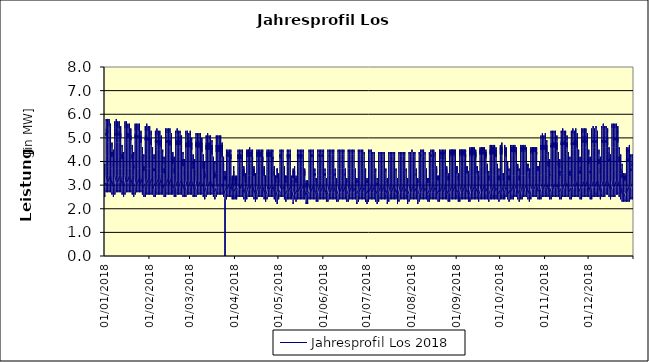
| Category | Jahresprofil Los 2018 |
|---|---|
| 01/01/2018 | 2.9 |
| 01/01/2018 | 2.8 |
| 01/01/2018 | 2.7 |
| 01/01/2018 | 2.6 |
| 01/01/2018 | 2.5 |
| 01/01/2018 | 2.5 |
| 01/01/2018 | 2.5 |
| 01/01/2018 | 2.6 |
| 01/01/2018 | 2.6 |
| 01/01/2018 | 2.8 |
| 01/01/2018 | 2.9 |
| 01/01/2018 | 3.1 |
| 01/01/2018 | 3.3 |
| 01/01/2018 | 3.3 |
| 01/01/2018 | 3.3 |
| 01/01/2018 | 3.4 |
| 01/01/2018 | 3.7 |
| 01/01/2018 | 3.9 |
| 01/01/2018 | 3.9 |
| 01/01/2018 | 3.8 |
| 01/01/2018 | 3.6 |
| 01/01/2018 | 3.3 |
| 01/01/2018 | 3.2 |
| 02/01/2018 | 3 |
| 02/01/2018 | 3.1 |
| 02/01/2018 | 2.9 |
| 02/01/2018 | 2.7 |
| 02/01/2018 | 2.7 |
| 02/01/2018 | 2.8 |
| 02/01/2018 | 3.1 |
| 02/01/2018 | 3.6 |
| 02/01/2018 | 4.3 |
| 02/01/2018 | 4.7 |
| 02/01/2018 | 4.9 |
| 02/01/2018 | 5.1 |
| 02/01/2018 | 5.2 |
| 02/01/2018 | 5.2 |
| 02/01/2018 | 5.1 |
| 02/01/2018 | 5.1 |
| 02/01/2018 | 5.1 |
| 02/01/2018 | 5.4 |
| 02/01/2018 | 5.8 |
| 02/01/2018 | 5.7 |
| 02/01/2018 | 5.3 |
| 02/01/2018 | 4.7 |
| 02/01/2018 | 4.2 |
| 02/01/2018 | 3.8 |
| 03/01/2018 | 3.4 |
| 03/01/2018 | 3.1 |
| 03/01/2018 | 2.8 |
| 03/01/2018 | 2.7 |
| 03/01/2018 | 2.7 |
| 03/01/2018 | 2.8 |
| 03/01/2018 | 3.1 |
| 03/01/2018 | 3.8 |
| 03/01/2018 | 4.5 |
| 03/01/2018 | 4.8 |
| 03/01/2018 | 5 |
| 03/01/2018 | 5.2 |
| 03/01/2018 | 5.3 |
| 03/01/2018 | 5.3 |
| 03/01/2018 | 5.2 |
| 03/01/2018 | 5.2 |
| 03/01/2018 | 5.2 |
| 03/01/2018 | 5.5 |
| 03/01/2018 | 5.8 |
| 03/01/2018 | 5.8 |
| 03/01/2018 | 5.5 |
| 03/01/2018 | 4.8 |
| 03/01/2018 | 4.2 |
| 03/01/2018 | 3.8 |
| 04/01/2018 | 3.4 |
| 04/01/2018 | 3.1 |
| 04/01/2018 | 2.8 |
| 04/01/2018 | 2.7 |
| 04/01/2018 | 2.7 |
| 04/01/2018 | 2.8 |
| 04/01/2018 | 3.1 |
| 04/01/2018 | 3.8 |
| 04/01/2018 | 4.5 |
| 04/01/2018 | 4.8 |
| 04/01/2018 | 5 |
| 04/01/2018 | 5.1 |
| 04/01/2018 | 5.2 |
| 04/01/2018 | 5.2 |
| 04/01/2018 | 5.2 |
| 04/01/2018 | 5.2 |
| 04/01/2018 | 5.2 |
| 04/01/2018 | 5.4 |
| 04/01/2018 | 5.8 |
| 04/01/2018 | 5.8 |
| 04/01/2018 | 5.5 |
| 04/01/2018 | 4.8 |
| 04/01/2018 | 4.2 |
| 04/01/2018 | 3.8 |
| 05/01/2018 | 3.4 |
| 05/01/2018 | 3.1 |
| 05/01/2018 | 2.9 |
| 05/01/2018 | 2.7 |
| 05/01/2018 | 2.7 |
| 05/01/2018 | 2.8 |
| 05/01/2018 | 3.1 |
| 05/01/2018 | 3.7 |
| 05/01/2018 | 4.4 |
| 05/01/2018 | 4.8 |
| 05/01/2018 | 5 |
| 05/01/2018 | 5.2 |
| 05/01/2018 | 5.2 |
| 05/01/2018 | 5.2 |
| 05/01/2018 | 5.1 |
| 05/01/2018 | 5 |
| 05/01/2018 | 5 |
| 05/01/2018 | 5.3 |
| 05/01/2018 | 5.6 |
| 05/01/2018 | 5.5 |
| 05/01/2018 | 5.2 |
| 05/01/2018 | 4.6 |
| 05/01/2018 | 4 |
| 05/01/2018 | 3.7 |
| 06/01/2018 | 3.4 |
| 06/01/2018 | 3 |
| 06/01/2018 | 2.8 |
| 06/01/2018 | 2.7 |
| 06/01/2018 | 2.6 |
| 06/01/2018 | 2.6 |
| 06/01/2018 | 2.7 |
| 06/01/2018 | 2.9 |
| 06/01/2018 | 3.2 |
| 06/01/2018 | 3.6 |
| 06/01/2018 | 4 |
| 06/01/2018 | 4.2 |
| 06/01/2018 | 4.4 |
| 06/01/2018 | 4.4 |
| 06/01/2018 | 4.3 |
| 06/01/2018 | 4.2 |
| 06/01/2018 | 4.2 |
| 06/01/2018 | 4.4 |
| 06/01/2018 | 4.8 |
| 06/01/2018 | 4.8 |
| 06/01/2018 | 4.6 |
| 06/01/2018 | 4.1 |
| 06/01/2018 | 3.7 |
| 06/01/2018 | 3.5 |
| 07/01/2018 | 3.2 |
| 07/01/2018 | 2.9 |
| 07/01/2018 | 2.7 |
| 07/01/2018 | 2.6 |
| 07/01/2018 | 2.5 |
| 07/01/2018 | 2.5 |
| 07/01/2018 | 2.5 |
| 07/01/2018 | 2.6 |
| 07/01/2018 | 2.9 |
| 07/01/2018 | 3.1 |
| 07/01/2018 | 3.4 |
| 07/01/2018 | 3.6 |
| 07/01/2018 | 3.8 |
| 07/01/2018 | 3.9 |
| 07/01/2018 | 3.8 |
| 07/01/2018 | 3.8 |
| 07/01/2018 | 3.8 |
| 07/01/2018 | 4 |
| 07/01/2018 | 4.4 |
| 07/01/2018 | 4.5 |
| 07/01/2018 | 4.3 |
| 07/01/2018 | 3.9 |
| 07/01/2018 | 3.6 |
| 07/01/2018 | 3.5 |
| 08/01/2018 | 3.2 |
| 08/01/2018 | 2.9 |
| 08/01/2018 | 2.7 |
| 08/01/2018 | 2.6 |
| 08/01/2018 | 2.6 |
| 08/01/2018 | 2.7 |
| 08/01/2018 | 3 |
| 08/01/2018 | 3.7 |
| 08/01/2018 | 4.4 |
| 08/01/2018 | 4.7 |
| 08/01/2018 | 4.9 |
| 08/01/2018 | 5.1 |
| 08/01/2018 | 5.2 |
| 08/01/2018 | 5.2 |
| 08/01/2018 | 5.2 |
| 08/01/2018 | 5.1 |
| 08/01/2018 | 5.1 |
| 08/01/2018 | 5.4 |
| 08/01/2018 | 5.7 |
| 08/01/2018 | 5.7 |
| 08/01/2018 | 5.4 |
| 08/01/2018 | 4.8 |
| 08/01/2018 | 4.2 |
| 08/01/2018 | 3.8 |
| 09/01/2018 | 3.4 |
| 09/01/2018 | 3.1 |
| 09/01/2018 | 2.8 |
| 09/01/2018 | 2.7 |
| 09/01/2018 | 2.7 |
| 09/01/2018 | 2.8 |
| 09/01/2018 | 3.1 |
| 09/01/2018 | 3.7 |
| 09/01/2018 | 4.4 |
| 09/01/2018 | 4.8 |
| 09/01/2018 | 5 |
| 09/01/2018 | 5.1 |
| 09/01/2018 | 5.2 |
| 09/01/2018 | 5.2 |
| 09/01/2018 | 5.2 |
| 09/01/2018 | 5.1 |
| 09/01/2018 | 5.1 |
| 09/01/2018 | 5.4 |
| 09/01/2018 | 5.8 |
| 09/01/2018 | 5.8 |
| 09/01/2018 | 5.5 |
| 09/01/2018 | 4.8 |
| 09/01/2018 | 4.2 |
| 09/01/2018 | 3.8 |
| 10/01/2018 | 3.4 |
| 10/01/2018 | 3.1 |
| 10/01/2018 | 2.8 |
| 10/01/2018 | 2.7 |
| 10/01/2018 | 2.7 |
| 10/01/2018 | 2.8 |
| 10/01/2018 | 3.1 |
| 10/01/2018 | 3.7 |
| 10/01/2018 | 4.4 |
| 10/01/2018 | 4.8 |
| 10/01/2018 | 5 |
| 10/01/2018 | 5.1 |
| 10/01/2018 | 5.2 |
| 10/01/2018 | 5.2 |
| 10/01/2018 | 5.1 |
| 10/01/2018 | 5.1 |
| 10/01/2018 | 5.1 |
| 10/01/2018 | 5.3 |
| 10/01/2018 | 5.7 |
| 10/01/2018 | 5.7 |
| 10/01/2018 | 5.4 |
| 10/01/2018 | 4.8 |
| 10/01/2018 | 4.2 |
| 10/01/2018 | 3.8 |
| 11/01/2018 | 3.4 |
| 11/01/2018 | 3.1 |
| 11/01/2018 | 2.8 |
| 11/01/2018 | 2.7 |
| 11/01/2018 | 2.7 |
| 11/01/2018 | 2.8 |
| 11/01/2018 | 3.1 |
| 11/01/2018 | 3.7 |
| 11/01/2018 | 4.4 |
| 11/01/2018 | 4.8 |
| 11/01/2018 | 5 |
| 11/01/2018 | 5.1 |
| 11/01/2018 | 5.2 |
| 11/01/2018 | 5.2 |
| 11/01/2018 | 5.1 |
| 11/01/2018 | 5.1 |
| 11/01/2018 | 5.1 |
| 11/01/2018 | 5.3 |
| 11/01/2018 | 5.7 |
| 11/01/2018 | 5.7 |
| 11/01/2018 | 5.4 |
| 11/01/2018 | 4.8 |
| 11/01/2018 | 4.2 |
| 11/01/2018 | 3.8 |
| 12/01/2018 | 3.4 |
| 12/01/2018 | 3.1 |
| 12/01/2018 | 2.8 |
| 12/01/2018 | 2.7 |
| 12/01/2018 | 2.7 |
| 12/01/2018 | 2.8 |
| 12/01/2018 | 3.1 |
| 12/01/2018 | 3.7 |
| 12/01/2018 | 4.4 |
| 12/01/2018 | 4.8 |
| 12/01/2018 | 5 |
| 12/01/2018 | 5.1 |
| 12/01/2018 | 5.2 |
| 12/01/2018 | 5.2 |
| 12/01/2018 | 5 |
| 12/01/2018 | 5 |
| 12/01/2018 | 5 |
| 12/01/2018 | 5.2 |
| 12/01/2018 | 5.5 |
| 12/01/2018 | 5.5 |
| 12/01/2018 | 5.2 |
| 12/01/2018 | 4.6 |
| 12/01/2018 | 4 |
| 12/01/2018 | 3.7 |
| 13/01/2018 | 3.4 |
| 13/01/2018 | 3 |
| 13/01/2018 | 2.8 |
| 13/01/2018 | 2.7 |
| 13/01/2018 | 2.6 |
| 13/01/2018 | 2.6 |
| 13/01/2018 | 2.7 |
| 13/01/2018 | 2.9 |
| 13/01/2018 | 3.2 |
| 13/01/2018 | 3.6 |
| 13/01/2018 | 3.9 |
| 13/01/2018 | 4.2 |
| 13/01/2018 | 4.3 |
| 13/01/2018 | 4.3 |
| 13/01/2018 | 4.2 |
| 13/01/2018 | 4.2 |
| 13/01/2018 | 4.1 |
| 13/01/2018 | 4.4 |
| 13/01/2018 | 4.7 |
| 13/01/2018 | 4.7 |
| 13/01/2018 | 4.6 |
| 13/01/2018 | 4.1 |
| 13/01/2018 | 3.7 |
| 13/01/2018 | 3.4 |
| 14/01/2018 | 3.2 |
| 14/01/2018 | 2.9 |
| 14/01/2018 | 2.7 |
| 14/01/2018 | 2.6 |
| 14/01/2018 | 2.5 |
| 14/01/2018 | 2.5 |
| 14/01/2018 | 2.5 |
| 14/01/2018 | 2.6 |
| 14/01/2018 | 2.8 |
| 14/01/2018 | 3.1 |
| 14/01/2018 | 3.4 |
| 14/01/2018 | 3.6 |
| 14/01/2018 | 3.8 |
| 14/01/2018 | 3.9 |
| 14/01/2018 | 3.8 |
| 14/01/2018 | 3.7 |
| 14/01/2018 | 3.7 |
| 14/01/2018 | 3.9 |
| 14/01/2018 | 4.3 |
| 14/01/2018 | 4.4 |
| 14/01/2018 | 4.3 |
| 14/01/2018 | 3.9 |
| 14/01/2018 | 3.6 |
| 14/01/2018 | 3.5 |
| 15/01/2018 | 3.2 |
| 15/01/2018 | 2.9 |
| 15/01/2018 | 2.7 |
| 15/01/2018 | 2.6 |
| 15/01/2018 | 2.6 |
| 15/01/2018 | 2.7 |
| 15/01/2018 | 3 |
| 15/01/2018 | 3.7 |
| 15/01/2018 | 4.3 |
| 15/01/2018 | 4.7 |
| 15/01/2018 | 4.9 |
| 15/01/2018 | 5 |
| 15/01/2018 | 5.1 |
| 15/01/2018 | 5.1 |
| 15/01/2018 | 5.1 |
| 15/01/2018 | 5.1 |
| 15/01/2018 | 5.1 |
| 15/01/2018 | 5.3 |
| 15/01/2018 | 5.6 |
| 15/01/2018 | 5.7 |
| 15/01/2018 | 5.4 |
| 15/01/2018 | 4.8 |
| 15/01/2018 | 4.2 |
| 15/01/2018 | 3.8 |
| 16/01/2018 | 3.4 |
| 16/01/2018 | 3 |
| 16/01/2018 | 2.8 |
| 16/01/2018 | 2.7 |
| 16/01/2018 | 2.7 |
| 16/01/2018 | 2.8 |
| 16/01/2018 | 3.1 |
| 16/01/2018 | 3.7 |
| 16/01/2018 | 4.4 |
| 16/01/2018 | 4.8 |
| 16/01/2018 | 4.9 |
| 16/01/2018 | 5.1 |
| 16/01/2018 | 5.1 |
| 16/01/2018 | 5.2 |
| 16/01/2018 | 5.1 |
| 16/01/2018 | 5.1 |
| 16/01/2018 | 5.1 |
| 16/01/2018 | 5.3 |
| 16/01/2018 | 5.7 |
| 16/01/2018 | 5.7 |
| 16/01/2018 | 5.4 |
| 16/01/2018 | 4.8 |
| 16/01/2018 | 4.2 |
| 16/01/2018 | 3.8 |
| 17/01/2018 | 3.4 |
| 17/01/2018 | 3.1 |
| 17/01/2018 | 2.8 |
| 17/01/2018 | 2.7 |
| 17/01/2018 | 2.7 |
| 17/01/2018 | 2.8 |
| 17/01/2018 | 3.1 |
| 17/01/2018 | 3.7 |
| 17/01/2018 | 4.4 |
| 17/01/2018 | 4.8 |
| 17/01/2018 | 4.9 |
| 17/01/2018 | 5.1 |
| 17/01/2018 | 5.1 |
| 17/01/2018 | 5.2 |
| 17/01/2018 | 5.1 |
| 17/01/2018 | 5.1 |
| 17/01/2018 | 5 |
| 17/01/2018 | 5.2 |
| 17/01/2018 | 5.6 |
| 17/01/2018 | 5.6 |
| 17/01/2018 | 5.4 |
| 17/01/2018 | 4.7 |
| 17/01/2018 | 4.2 |
| 17/01/2018 | 3.8 |
| 18/01/2018 | 3.4 |
| 18/01/2018 | 3.1 |
| 18/01/2018 | 2.8 |
| 18/01/2018 | 2.7 |
| 18/01/2018 | 2.7 |
| 18/01/2018 | 2.8 |
| 18/01/2018 | 3.1 |
| 18/01/2018 | 3.7 |
| 18/01/2018 | 4.4 |
| 18/01/2018 | 4.7 |
| 18/01/2018 | 4.9 |
| 18/01/2018 | 5.1 |
| 18/01/2018 | 5.1 |
| 18/01/2018 | 5.1 |
| 18/01/2018 | 5.1 |
| 18/01/2018 | 5 |
| 18/01/2018 | 5 |
| 18/01/2018 | 5.2 |
| 18/01/2018 | 5.6 |
| 18/01/2018 | 5.6 |
| 18/01/2018 | 5.4 |
| 18/01/2018 | 4.8 |
| 18/01/2018 | 4.2 |
| 18/01/2018 | 3.8 |
| 19/01/2018 | 3.4 |
| 19/01/2018 | 3.1 |
| 19/01/2018 | 2.8 |
| 19/01/2018 | 2.7 |
| 19/01/2018 | 2.7 |
| 19/01/2018 | 2.8 |
| 19/01/2018 | 3.1 |
| 19/01/2018 | 3.7 |
| 19/01/2018 | 4.4 |
| 19/01/2018 | 4.7 |
| 19/01/2018 | 4.9 |
| 19/01/2018 | 5.1 |
| 19/01/2018 | 5.1 |
| 19/01/2018 | 5.1 |
| 19/01/2018 | 5 |
| 19/01/2018 | 4.9 |
| 19/01/2018 | 4.9 |
| 19/01/2018 | 5.1 |
| 19/01/2018 | 5.4 |
| 19/01/2018 | 5.4 |
| 19/01/2018 | 5.1 |
| 19/01/2018 | 4.5 |
| 19/01/2018 | 4 |
| 19/01/2018 | 3.7 |
| 20/01/2018 | 3.3 |
| 20/01/2018 | 3 |
| 20/01/2018 | 2.8 |
| 20/01/2018 | 2.7 |
| 20/01/2018 | 2.6 |
| 20/01/2018 | 2.6 |
| 20/01/2018 | 2.7 |
| 20/01/2018 | 2.9 |
| 20/01/2018 | 3.2 |
| 20/01/2018 | 3.5 |
| 20/01/2018 | 3.9 |
| 20/01/2018 | 4.2 |
| 20/01/2018 | 4.3 |
| 20/01/2018 | 4.3 |
| 20/01/2018 | 4.2 |
| 20/01/2018 | 4.1 |
| 20/01/2018 | 4.1 |
| 20/01/2018 | 4.3 |
| 20/01/2018 | 4.6 |
| 20/01/2018 | 4.7 |
| 20/01/2018 | 4.5 |
| 20/01/2018 | 4.1 |
| 20/01/2018 | 3.7 |
| 20/01/2018 | 3.4 |
| 21/01/2018 | 3.1 |
| 21/01/2018 | 2.9 |
| 21/01/2018 | 2.7 |
| 21/01/2018 | 2.6 |
| 21/01/2018 | 2.5 |
| 21/01/2018 | 2.5 |
| 21/01/2018 | 2.5 |
| 21/01/2018 | 2.6 |
| 21/01/2018 | 2.8 |
| 21/01/2018 | 3.1 |
| 21/01/2018 | 3.4 |
| 21/01/2018 | 3.6 |
| 21/01/2018 | 3.8 |
| 21/01/2018 | 3.8 |
| 21/01/2018 | 3.8 |
| 21/01/2018 | 3.7 |
| 21/01/2018 | 3.7 |
| 21/01/2018 | 3.9 |
| 21/01/2018 | 4.2 |
| 21/01/2018 | 4.4 |
| 21/01/2018 | 4.2 |
| 21/01/2018 | 3.9 |
| 21/01/2018 | 3.6 |
| 21/01/2018 | 3.4 |
| 22/01/2018 | 3.1 |
| 22/01/2018 | 2.9 |
| 22/01/2018 | 2.7 |
| 22/01/2018 | 2.6 |
| 22/01/2018 | 2.6 |
| 22/01/2018 | 2.7 |
| 22/01/2018 | 3 |
| 22/01/2018 | 3.6 |
| 22/01/2018 | 4.3 |
| 22/01/2018 | 4.7 |
| 22/01/2018 | 4.9 |
| 22/01/2018 | 5 |
| 22/01/2018 | 5.1 |
| 22/01/2018 | 5.1 |
| 22/01/2018 | 5 |
| 22/01/2018 | 5 |
| 22/01/2018 | 5 |
| 22/01/2018 | 5.2 |
| 22/01/2018 | 5.5 |
| 22/01/2018 | 5.6 |
| 22/01/2018 | 5.3 |
| 22/01/2018 | 4.7 |
| 22/01/2018 | 4.2 |
| 22/01/2018 | 3.7 |
| 23/01/2018 | 3.3 |
| 23/01/2018 | 3 |
| 23/01/2018 | 2.8 |
| 23/01/2018 | 2.7 |
| 23/01/2018 | 2.7 |
| 23/01/2018 | 2.8 |
| 23/01/2018 | 3 |
| 23/01/2018 | 3.7 |
| 23/01/2018 | 4.4 |
| 23/01/2018 | 4.7 |
| 23/01/2018 | 4.9 |
| 23/01/2018 | 5 |
| 23/01/2018 | 5.1 |
| 23/01/2018 | 5.1 |
| 23/01/2018 | 5 |
| 23/01/2018 | 5 |
| 23/01/2018 | 5 |
| 23/01/2018 | 5.2 |
| 23/01/2018 | 5.5 |
| 23/01/2018 | 5.6 |
| 23/01/2018 | 5.4 |
| 23/01/2018 | 4.8 |
| 23/01/2018 | 4.2 |
| 23/01/2018 | 3.8 |
| 24/01/2018 | 3.3 |
| 24/01/2018 | 3 |
| 24/01/2018 | 2.8 |
| 24/01/2018 | 2.7 |
| 24/01/2018 | 2.7 |
| 24/01/2018 | 2.8 |
| 24/01/2018 | 3 |
| 24/01/2018 | 3.7 |
| 24/01/2018 | 4.4 |
| 24/01/2018 | 4.7 |
| 24/01/2018 | 4.9 |
| 24/01/2018 | 5 |
| 24/01/2018 | 5.1 |
| 24/01/2018 | 5.1 |
| 24/01/2018 | 5 |
| 24/01/2018 | 5 |
| 24/01/2018 | 5 |
| 24/01/2018 | 5.1 |
| 24/01/2018 | 5.5 |
| 24/01/2018 | 5.6 |
| 24/01/2018 | 5.3 |
| 24/01/2018 | 4.7 |
| 24/01/2018 | 4.1 |
| 24/01/2018 | 3.7 |
| 25/01/2018 | 3.3 |
| 25/01/2018 | 3 |
| 25/01/2018 | 2.8 |
| 25/01/2018 | 2.7 |
| 25/01/2018 | 2.7 |
| 25/01/2018 | 2.8 |
| 25/01/2018 | 3 |
| 25/01/2018 | 3.7 |
| 25/01/2018 | 4.4 |
| 25/01/2018 | 4.7 |
| 25/01/2018 | 4.9 |
| 25/01/2018 | 5 |
| 25/01/2018 | 5.1 |
| 25/01/2018 | 5.1 |
| 25/01/2018 | 5 |
| 25/01/2018 | 5 |
| 25/01/2018 | 4.9 |
| 25/01/2018 | 5.1 |
| 25/01/2018 | 5.5 |
| 25/01/2018 | 5.6 |
| 25/01/2018 | 5.3 |
| 25/01/2018 | 4.7 |
| 25/01/2018 | 4.2 |
| 25/01/2018 | 3.8 |
| 26/01/2018 | 3.4 |
| 26/01/2018 | 3 |
| 26/01/2018 | 2.8 |
| 26/01/2018 | 2.7 |
| 26/01/2018 | 2.7 |
| 26/01/2018 | 2.8 |
| 26/01/2018 | 3 |
| 26/01/2018 | 3.7 |
| 26/01/2018 | 4.3 |
| 26/01/2018 | 4.7 |
| 26/01/2018 | 4.9 |
| 26/01/2018 | 5 |
| 26/01/2018 | 5.1 |
| 26/01/2018 | 5 |
| 26/01/2018 | 4.9 |
| 26/01/2018 | 4.9 |
| 26/01/2018 | 4.8 |
| 26/01/2018 | 5 |
| 26/01/2018 | 5.3 |
| 26/01/2018 | 5.3 |
| 26/01/2018 | 5.1 |
| 26/01/2018 | 4.5 |
| 26/01/2018 | 4 |
| 26/01/2018 | 3.6 |
| 27/01/2018 | 3.3 |
| 27/01/2018 | 3 |
| 27/01/2018 | 2.8 |
| 27/01/2018 | 2.7 |
| 27/01/2018 | 2.6 |
| 27/01/2018 | 2.6 |
| 27/01/2018 | 2.7 |
| 27/01/2018 | 2.8 |
| 27/01/2018 | 3.1 |
| 27/01/2018 | 3.5 |
| 27/01/2018 | 3.9 |
| 27/01/2018 | 4.1 |
| 27/01/2018 | 4.2 |
| 27/01/2018 | 4.2 |
| 27/01/2018 | 4.1 |
| 27/01/2018 | 4 |
| 27/01/2018 | 4 |
| 27/01/2018 | 4.2 |
| 27/01/2018 | 4.5 |
| 27/01/2018 | 4.6 |
| 27/01/2018 | 4.5 |
| 27/01/2018 | 4.1 |
| 27/01/2018 | 3.6 |
| 27/01/2018 | 3.4 |
| 28/01/2018 | 3.1 |
| 28/01/2018 | 2.9 |
| 28/01/2018 | 2.7 |
| 28/01/2018 | 2.6 |
| 28/01/2018 | 2.5 |
| 28/01/2018 | 2.5 |
| 28/01/2018 | 2.5 |
| 28/01/2018 | 2.6 |
| 28/01/2018 | 2.8 |
| 28/01/2018 | 3 |
| 28/01/2018 | 3.3 |
| 28/01/2018 | 3.5 |
| 28/01/2018 | 3.7 |
| 28/01/2018 | 3.8 |
| 28/01/2018 | 3.7 |
| 28/01/2018 | 3.6 |
| 28/01/2018 | 3.6 |
| 28/01/2018 | 3.8 |
| 28/01/2018 | 4.1 |
| 28/01/2018 | 4.3 |
| 28/01/2018 | 4.2 |
| 28/01/2018 | 3.9 |
| 28/01/2018 | 3.6 |
| 28/01/2018 | 3.4 |
| 29/01/2018 | 3.1 |
| 29/01/2018 | 2.9 |
| 29/01/2018 | 2.7 |
| 29/01/2018 | 2.6 |
| 29/01/2018 | 2.5 |
| 29/01/2018 | 2.7 |
| 29/01/2018 | 3 |
| 29/01/2018 | 3.6 |
| 29/01/2018 | 4.3 |
| 29/01/2018 | 4.6 |
| 29/01/2018 | 4.8 |
| 29/01/2018 | 5 |
| 29/01/2018 | 5 |
| 29/01/2018 | 5 |
| 29/01/2018 | 5 |
| 29/01/2018 | 5 |
| 29/01/2018 | 4.9 |
| 29/01/2018 | 5.1 |
| 29/01/2018 | 5.4 |
| 29/01/2018 | 5.5 |
| 29/01/2018 | 5.3 |
| 29/01/2018 | 4.7 |
| 29/01/2018 | 4.1 |
| 29/01/2018 | 3.7 |
| 30/01/2018 | 3.3 |
| 30/01/2018 | 3 |
| 30/01/2018 | 2.8 |
| 30/01/2018 | 2.7 |
| 30/01/2018 | 2.6 |
| 30/01/2018 | 2.7 |
| 30/01/2018 | 3 |
| 30/01/2018 | 3.7 |
| 30/01/2018 | 4.3 |
| 30/01/2018 | 4.7 |
| 30/01/2018 | 4.9 |
| 30/01/2018 | 5 |
| 30/01/2018 | 5 |
| 30/01/2018 | 5 |
| 30/01/2018 | 5 |
| 30/01/2018 | 4.9 |
| 30/01/2018 | 4.9 |
| 30/01/2018 | 5.1 |
| 30/01/2018 | 5.4 |
| 30/01/2018 | 5.6 |
| 30/01/2018 | 5.3 |
| 30/01/2018 | 4.7 |
| 30/01/2018 | 4.1 |
| 30/01/2018 | 3.7 |
| 31/01/2018 | 3.3 |
| 31/01/2018 | 3 |
| 31/01/2018 | 2.8 |
| 31/01/2018 | 2.7 |
| 31/01/2018 | 2.6 |
| 31/01/2018 | 2.7 |
| 31/01/2018 | 3 |
| 31/01/2018 | 3.7 |
| 31/01/2018 | 4.3 |
| 31/01/2018 | 4.7 |
| 31/01/2018 | 4.9 |
| 31/01/2018 | 5 |
| 31/01/2018 | 5 |
| 31/01/2018 | 5 |
| 31/01/2018 | 5 |
| 31/01/2018 | 4.9 |
| 31/01/2018 | 4.9 |
| 31/01/2018 | 5 |
| 31/01/2018 | 5.4 |
| 31/01/2018 | 5.5 |
| 31/01/2018 | 5.3 |
| 31/01/2018 | 4.7 |
| 31/01/2018 | 4.1 |
| 31/01/2018 | 3.7 |
| 01/02/2018 | 3.3 |
| 01/02/2018 | 3 |
| 01/02/2018 | 2.8 |
| 01/02/2018 | 2.7 |
| 01/02/2018 | 2.6 |
| 01/02/2018 | 2.7 |
| 01/02/2018 | 3 |
| 01/02/2018 | 3.7 |
| 01/02/2018 | 4.3 |
| 01/02/2018 | 4.7 |
| 01/02/2018 | 4.9 |
| 01/02/2018 | 5 |
| 01/02/2018 | 5 |
| 01/02/2018 | 5 |
| 01/02/2018 | 5 |
| 01/02/2018 | 4.9 |
| 01/02/2018 | 4.9 |
| 01/02/2018 | 5 |
| 01/02/2018 | 5.4 |
| 01/02/2018 | 5.5 |
| 01/02/2018 | 5.3 |
| 01/02/2018 | 4.7 |
| 01/02/2018 | 4.1 |
| 01/02/2018 | 3.7 |
| 02/02/2018 | 3.3 |
| 02/02/2018 | 3 |
| 02/02/2018 | 2.8 |
| 02/02/2018 | 2.7 |
| 02/02/2018 | 2.6 |
| 02/02/2018 | 2.7 |
| 02/02/2018 | 3 |
| 02/02/2018 | 3.7 |
| 02/02/2018 | 4.3 |
| 02/02/2018 | 4.7 |
| 02/02/2018 | 4.9 |
| 02/02/2018 | 5 |
| 02/02/2018 | 5 |
| 02/02/2018 | 5 |
| 02/02/2018 | 4.9 |
| 02/02/2018 | 4.8 |
| 02/02/2018 | 4.7 |
| 02/02/2018 | 4.9 |
| 02/02/2018 | 5.2 |
| 02/02/2018 | 5.3 |
| 02/02/2018 | 5.1 |
| 02/02/2018 | 4.5 |
| 02/02/2018 | 3.9 |
| 02/02/2018 | 3.6 |
| 03/02/2018 | 3.3 |
| 03/02/2018 | 3 |
| 03/02/2018 | 2.8 |
| 03/02/2018 | 2.6 |
| 03/02/2018 | 2.6 |
| 03/02/2018 | 2.6 |
| 03/02/2018 | 2.6 |
| 03/02/2018 | 2.8 |
| 03/02/2018 | 3.1 |
| 03/02/2018 | 3.5 |
| 03/02/2018 | 3.8 |
| 03/02/2018 | 4.1 |
| 03/02/2018 | 4.2 |
| 03/02/2018 | 4.2 |
| 03/02/2018 | 4.1 |
| 03/02/2018 | 4 |
| 03/02/2018 | 4 |
| 03/02/2018 | 4.1 |
| 03/02/2018 | 4.4 |
| 03/02/2018 | 4.6 |
| 03/02/2018 | 4.4 |
| 03/02/2018 | 4 |
| 03/02/2018 | 3.6 |
| 03/02/2018 | 3.4 |
| 04/02/2018 | 3.1 |
| 04/02/2018 | 2.8 |
| 04/02/2018 | 2.7 |
| 04/02/2018 | 2.6 |
| 04/02/2018 | 2.5 |
| 04/02/2018 | 2.5 |
| 04/02/2018 | 2.5 |
| 04/02/2018 | 2.6 |
| 04/02/2018 | 2.8 |
| 04/02/2018 | 3 |
| 04/02/2018 | 3.3 |
| 04/02/2018 | 3.5 |
| 04/02/2018 | 3.7 |
| 04/02/2018 | 3.7 |
| 04/02/2018 | 3.7 |
| 04/02/2018 | 3.6 |
| 04/02/2018 | 3.6 |
| 04/02/2018 | 3.7 |
| 04/02/2018 | 4 |
| 04/02/2018 | 4.3 |
| 04/02/2018 | 4.1 |
| 04/02/2018 | 3.8 |
| 04/02/2018 | 3.5 |
| 04/02/2018 | 3.4 |
| 05/02/2018 | 3.1 |
| 05/02/2018 | 2.9 |
| 05/02/2018 | 2.7 |
| 05/02/2018 | 2.6 |
| 05/02/2018 | 2.5 |
| 05/02/2018 | 2.7 |
| 05/02/2018 | 2.9 |
| 05/02/2018 | 3.5 |
| 05/02/2018 | 4.1 |
| 05/02/2018 | 4.4 |
| 05/02/2018 | 4.7 |
| 05/02/2018 | 4.8 |
| 05/02/2018 | 4.9 |
| 05/02/2018 | 4.9 |
| 05/02/2018 | 4.9 |
| 05/02/2018 | 4.8 |
| 05/02/2018 | 4.8 |
| 05/02/2018 | 4.9 |
| 05/02/2018 | 5.2 |
| 05/02/2018 | 5.3 |
| 05/02/2018 | 5.1 |
| 05/02/2018 | 4.5 |
| 05/02/2018 | 4.1 |
| 05/02/2018 | 3.7 |
| 06/02/2018 | 3.3 |
| 06/02/2018 | 3 |
| 06/02/2018 | 2.8 |
| 06/02/2018 | 2.7 |
| 06/02/2018 | 2.6 |
| 06/02/2018 | 2.7 |
| 06/02/2018 | 3 |
| 06/02/2018 | 3.6 |
| 06/02/2018 | 4.1 |
| 06/02/2018 | 4.5 |
| 06/02/2018 | 4.7 |
| 06/02/2018 | 4.9 |
| 06/02/2018 | 4.9 |
| 06/02/2018 | 4.9 |
| 06/02/2018 | 4.9 |
| 06/02/2018 | 4.8 |
| 06/02/2018 | 4.8 |
| 06/02/2018 | 4.9 |
| 06/02/2018 | 5.2 |
| 06/02/2018 | 5.4 |
| 06/02/2018 | 5.1 |
| 06/02/2018 | 4.6 |
| 06/02/2018 | 4.1 |
| 06/02/2018 | 3.7 |
| 07/02/2018 | 3.3 |
| 07/02/2018 | 3 |
| 07/02/2018 | 2.8 |
| 07/02/2018 | 2.7 |
| 07/02/2018 | 2.6 |
| 07/02/2018 | 2.7 |
| 07/02/2018 | 3 |
| 07/02/2018 | 3.5 |
| 07/02/2018 | 4.1 |
| 07/02/2018 | 4.5 |
| 07/02/2018 | 4.7 |
| 07/02/2018 | 4.9 |
| 07/02/2018 | 4.9 |
| 07/02/2018 | 4.9 |
| 07/02/2018 | 4.9 |
| 07/02/2018 | 4.8 |
| 07/02/2018 | 4.7 |
| 07/02/2018 | 4.8 |
| 07/02/2018 | 5.2 |
| 07/02/2018 | 5.3 |
| 07/02/2018 | 5.1 |
| 07/02/2018 | 4.5 |
| 07/02/2018 | 4 |
| 07/02/2018 | 3.7 |
| 08/02/2018 | 3.3 |
| 08/02/2018 | 3 |
| 08/02/2018 | 2.8 |
| 08/02/2018 | 2.7 |
| 08/02/2018 | 2.6 |
| 08/02/2018 | 2.7 |
| 08/02/2018 | 3 |
| 08/02/2018 | 3.5 |
| 08/02/2018 | 4.1 |
| 08/02/2018 | 4.5 |
| 08/02/2018 | 4.7 |
| 08/02/2018 | 4.8 |
| 08/02/2018 | 4.9 |
| 08/02/2018 | 4.9 |
| 08/02/2018 | 4.8 |
| 08/02/2018 | 4.8 |
| 08/02/2018 | 4.7 |
| 08/02/2018 | 4.8 |
| 08/02/2018 | 5.2 |
| 08/02/2018 | 5.3 |
| 08/02/2018 | 5.1 |
| 08/02/2018 | 4.6 |
| 08/02/2018 | 4.1 |
| 08/02/2018 | 3.7 |
| 09/02/2018 | 3.3 |
| 09/02/2018 | 3 |
| 09/02/2018 | 2.8 |
| 09/02/2018 | 2.7 |
| 09/02/2018 | 2.6 |
| 09/02/2018 | 2.7 |
| 09/02/2018 | 3 |
| 09/02/2018 | 3.5 |
| 09/02/2018 | 4.1 |
| 09/02/2018 | 4.5 |
| 09/02/2018 | 4.7 |
| 09/02/2018 | 4.9 |
| 09/02/2018 | 4.9 |
| 09/02/2018 | 4.9 |
| 09/02/2018 | 4.8 |
| 09/02/2018 | 4.7 |
| 09/02/2018 | 4.6 |
| 09/02/2018 | 4.7 |
| 09/02/2018 | 5 |
| 09/02/2018 | 5.1 |
| 09/02/2018 | 4.8 |
| 09/02/2018 | 4.3 |
| 09/02/2018 | 3.9 |
| 09/02/2018 | 3.5 |
| 10/02/2018 | 3.2 |
| 10/02/2018 | 2.9 |
| 10/02/2018 | 2.7 |
| 10/02/2018 | 2.6 |
| 10/02/2018 | 2.6 |
| 10/02/2018 | 2.6 |
| 10/02/2018 | 2.6 |
| 10/02/2018 | 2.8 |
| 10/02/2018 | 3.1 |
| 10/02/2018 | 3.5 |
| 10/02/2018 | 3.8 |
| 10/02/2018 | 4.1 |
| 10/02/2018 | 4.2 |
| 10/02/2018 | 4.1 |
| 10/02/2018 | 4 |
| 10/02/2018 | 3.9 |
| 10/02/2018 | 3.9 |
| 10/02/2018 | 4 |
| 10/02/2018 | 4.3 |
| 10/02/2018 | 4.5 |
| 10/02/2018 | 4.4 |
| 10/02/2018 | 4 |
| 10/02/2018 | 3.6 |
| 10/02/2018 | 3.3 |
| 11/02/2018 | 3.1 |
| 11/02/2018 | 2.8 |
| 11/02/2018 | 2.6 |
| 11/02/2018 | 2.5 |
| 11/02/2018 | 2.5 |
| 11/02/2018 | 2.5 |
| 11/02/2018 | 2.5 |
| 11/02/2018 | 2.6 |
| 11/02/2018 | 2.7 |
| 11/02/2018 | 3 |
| 11/02/2018 | 3.3 |
| 11/02/2018 | 3.5 |
| 11/02/2018 | 3.6 |
| 11/02/2018 | 3.7 |
| 11/02/2018 | 3.6 |
| 11/02/2018 | 3.5 |
| 11/02/2018 | 3.5 |
| 11/02/2018 | 3.6 |
| 11/02/2018 | 4 |
| 11/02/2018 | 4.2 |
| 11/02/2018 | 4.1 |
| 11/02/2018 | 3.8 |
| 11/02/2018 | 3.5 |
| 11/02/2018 | 3.3 |
| 12/02/2018 | 3.1 |
| 12/02/2018 | 2.8 |
| 12/02/2018 | 2.6 |
| 12/02/2018 | 2.5 |
| 12/02/2018 | 2.5 |
| 12/02/2018 | 2.6 |
| 12/02/2018 | 2.9 |
| 12/02/2018 | 3.6 |
| 12/02/2018 | 4.2 |
| 12/02/2018 | 4.6 |
| 12/02/2018 | 4.8 |
| 12/02/2018 | 4.9 |
| 12/02/2018 | 4.9 |
| 12/02/2018 | 4.9 |
| 12/02/2018 | 4.9 |
| 12/02/2018 | 4.8 |
| 12/02/2018 | 4.8 |
| 12/02/2018 | 4.9 |
| 12/02/2018 | 5.2 |
| 12/02/2018 | 5.4 |
| 12/02/2018 | 5.2 |
| 12/02/2018 | 4.6 |
| 12/02/2018 | 4.1 |
| 12/02/2018 | 3.7 |
| 13/02/2018 | 3.3 |
| 13/02/2018 | 3 |
| 13/02/2018 | 2.7 |
| 13/02/2018 | 2.6 |
| 13/02/2018 | 2.6 |
| 13/02/2018 | 2.7 |
| 13/02/2018 | 3 |
| 13/02/2018 | 3.6 |
| 13/02/2018 | 4.3 |
| 13/02/2018 | 4.6 |
| 13/02/2018 | 4.8 |
| 13/02/2018 | 4.9 |
| 13/02/2018 | 4.9 |
| 13/02/2018 | 4.9 |
| 13/02/2018 | 4.9 |
| 13/02/2018 | 4.8 |
| 13/02/2018 | 4.8 |
| 13/02/2018 | 4.9 |
| 13/02/2018 | 5.2 |
| 13/02/2018 | 5.4 |
| 13/02/2018 | 5.2 |
| 13/02/2018 | 4.7 |
| 13/02/2018 | 4.1 |
| 13/02/2018 | 3.7 |
| 14/02/2018 | 3.3 |
| 14/02/2018 | 3 |
| 14/02/2018 | 2.7 |
| 14/02/2018 | 2.6 |
| 14/02/2018 | 2.6 |
| 14/02/2018 | 2.7 |
| 14/02/2018 | 3 |
| 14/02/2018 | 3.6 |
| 14/02/2018 | 4.3 |
| 14/02/2018 | 4.6 |
| 14/02/2018 | 4.8 |
| 14/02/2018 | 4.9 |
| 14/02/2018 | 5 |
| 14/02/2018 | 4.9 |
| 14/02/2018 | 4.9 |
| 14/02/2018 | 4.8 |
| 14/02/2018 | 4.8 |
| 14/02/2018 | 4.8 |
| 14/02/2018 | 5.2 |
| 14/02/2018 | 5.4 |
| 14/02/2018 | 5.2 |
| 14/02/2018 | 4.6 |
| 14/02/2018 | 4.1 |
| 14/02/2018 | 3.7 |
| 15/02/2018 | 3.3 |
| 15/02/2018 | 3 |
| 15/02/2018 | 2.7 |
| 15/02/2018 | 2.6 |
| 15/02/2018 | 2.6 |
| 15/02/2018 | 2.7 |
| 15/02/2018 | 3 |
| 15/02/2018 | 3.6 |
| 15/02/2018 | 4.3 |
| 15/02/2018 | 4.6 |
| 15/02/2018 | 4.8 |
| 15/02/2018 | 4.9 |
| 15/02/2018 | 4.9 |
| 15/02/2018 | 4.9 |
| 15/02/2018 | 4.9 |
| 15/02/2018 | 4.8 |
| 15/02/2018 | 4.7 |
| 15/02/2018 | 4.8 |
| 15/02/2018 | 5.2 |
| 15/02/2018 | 5.4 |
| 15/02/2018 | 5.2 |
| 15/02/2018 | 4.6 |
| 15/02/2018 | 4.1 |
| 15/02/2018 | 3.7 |
| 16/02/2018 | 3.3 |
| 16/02/2018 | 3 |
| 16/02/2018 | 2.8 |
| 16/02/2018 | 2.6 |
| 16/02/2018 | 2.6 |
| 16/02/2018 | 2.7 |
| 16/02/2018 | 3 |
| 16/02/2018 | 3.6 |
| 16/02/2018 | 4.2 |
| 16/02/2018 | 4.6 |
| 16/02/2018 | 4.8 |
| 16/02/2018 | 4.9 |
| 16/02/2018 | 4.9 |
| 16/02/2018 | 4.9 |
| 16/02/2018 | 4.8 |
| 16/02/2018 | 4.7 |
| 16/02/2018 | 4.6 |
| 16/02/2018 | 4.7 |
| 16/02/2018 | 5 |
| 16/02/2018 | 5.2 |
| 16/02/2018 | 5 |
| 16/02/2018 | 4.4 |
| 16/02/2018 | 3.9 |
| 16/02/2018 | 3.5 |
| 17/02/2018 | 3.2 |
| 17/02/2018 | 2.9 |
| 17/02/2018 | 2.7 |
| 17/02/2018 | 2.6 |
| 17/02/2018 | 2.6 |
| 17/02/2018 | 2.6 |
| 17/02/2018 | 2.6 |
| 17/02/2018 | 2.8 |
| 17/02/2018 | 3.1 |
| 17/02/2018 | 3.4 |
| 17/02/2018 | 3.8 |
| 17/02/2018 | 4 |
| 17/02/2018 | 4.1 |
| 17/02/2018 | 4.1 |
| 17/02/2018 | 4 |
| 17/02/2018 | 3.9 |
| 17/02/2018 | 3.9 |
| 17/02/2018 | 3.9 |
| 17/02/2018 | 4.2 |
| 17/02/2018 | 4.4 |
| 17/02/2018 | 4.4 |
| 17/02/2018 | 4 |
| 17/02/2018 | 3.6 |
| 17/02/2018 | 3.3 |
| 18/02/2018 | 3 |
| 18/02/2018 | 2.8 |
| 18/02/2018 | 2.6 |
| 18/02/2018 | 2.5 |
| 18/02/2018 | 2.5 |
| 18/02/2018 | 2.5 |
| 18/02/2018 | 2.5 |
| 18/02/2018 | 2.6 |
| 18/02/2018 | 2.7 |
| 18/02/2018 | 3 |
| 18/02/2018 | 3.2 |
| 18/02/2018 | 3.4 |
| 18/02/2018 | 3.6 |
| 18/02/2018 | 3.7 |
| 18/02/2018 | 3.6 |
| 18/02/2018 | 3.5 |
| 18/02/2018 | 3.5 |
| 18/02/2018 | 3.5 |
| 18/02/2018 | 3.9 |
| 18/02/2018 | 4.2 |
| 18/02/2018 | 4.1 |
| 18/02/2018 | 3.8 |
| 18/02/2018 | 3.5 |
| 18/02/2018 | 3.3 |
| 19/02/2018 | 3 |
| 19/02/2018 | 2.8 |
| 19/02/2018 | 2.6 |
| 19/02/2018 | 2.5 |
| 19/02/2018 | 2.5 |
| 19/02/2018 | 2.6 |
| 19/02/2018 | 2.9 |
| 19/02/2018 | 3.6 |
| 19/02/2018 | 4.2 |
| 19/02/2018 | 4.5 |
| 19/02/2018 | 4.7 |
| 19/02/2018 | 4.8 |
| 19/02/2018 | 4.9 |
| 19/02/2018 | 4.9 |
| 19/02/2018 | 4.8 |
| 19/02/2018 | 4.8 |
| 19/02/2018 | 4.7 |
| 19/02/2018 | 4.8 |
| 19/02/2018 | 5.1 |
| 19/02/2018 | 5.3 |
| 19/02/2018 | 5.2 |
| 19/02/2018 | 4.6 |
| 19/02/2018 | 4 |
| 19/02/2018 | 3.6 |
| 20/02/2018 | 3.2 |
| 20/02/2018 | 2.9 |
| 20/02/2018 | 2.7 |
| 20/02/2018 | 2.6 |
| 20/02/2018 | 2.6 |
| 20/02/2018 | 2.7 |
| 20/02/2018 | 3 |
| 20/02/2018 | 3.6 |
| 20/02/2018 | 4.2 |
| 20/02/2018 | 4.6 |
| 20/02/2018 | 4.8 |
| 20/02/2018 | 4.8 |
| 20/02/2018 | 4.9 |
| 20/02/2018 | 4.9 |
| 20/02/2018 | 4.8 |
| 20/02/2018 | 4.8 |
| 20/02/2018 | 4.7 |
| 20/02/2018 | 4.8 |
| 20/02/2018 | 5.1 |
| 20/02/2018 | 5.4 |
| 20/02/2018 | 5.2 |
| 20/02/2018 | 4.6 |
| 20/02/2018 | 4.1 |
| 20/02/2018 | 3.6 |
| 21/02/2018 | 3.2 |
| 21/02/2018 | 2.9 |
| 21/02/2018 | 2.7 |
| 21/02/2018 | 2.6 |
| 21/02/2018 | 2.6 |
| 21/02/2018 | 2.7 |
| 21/02/2018 | 3 |
| 21/02/2018 | 3.6 |
| 21/02/2018 | 4.2 |
| 21/02/2018 | 4.6 |
| 21/02/2018 | 4.8 |
| 21/02/2018 | 4.9 |
| 21/02/2018 | 4.9 |
| 21/02/2018 | 4.9 |
| 21/02/2018 | 4.8 |
| 21/02/2018 | 4.7 |
| 21/02/2018 | 4.7 |
| 21/02/2018 | 4.8 |
| 21/02/2018 | 5.1 |
| 21/02/2018 | 5.3 |
| 21/02/2018 | 5.2 |
| 21/02/2018 | 4.6 |
| 21/02/2018 | 4 |
| 21/02/2018 | 3.6 |
| 22/02/2018 | 3.2 |
| 22/02/2018 | 2.9 |
| 22/02/2018 | 2.7 |
| 22/02/2018 | 2.6 |
| 22/02/2018 | 2.6 |
| 22/02/2018 | 2.7 |
| 22/02/2018 | 3 |
| 22/02/2018 | 3.6 |
| 22/02/2018 | 4.2 |
| 22/02/2018 | 4.6 |
| 22/02/2018 | 4.7 |
| 22/02/2018 | 4.8 |
| 22/02/2018 | 4.9 |
| 22/02/2018 | 4.9 |
| 22/02/2018 | 4.8 |
| 22/02/2018 | 4.7 |
| 22/02/2018 | 4.7 |
| 22/02/2018 | 4.7 |
| 22/02/2018 | 5.1 |
| 22/02/2018 | 5.3 |
| 22/02/2018 | 5.2 |
| 22/02/2018 | 4.6 |
| 22/02/2018 | 4.1 |
| 22/02/2018 | 3.6 |
| 23/02/2018 | 3.2 |
| 23/02/2018 | 3 |
| 23/02/2018 | 2.7 |
| 23/02/2018 | 2.6 |
| 23/02/2018 | 2.6 |
| 23/02/2018 | 2.7 |
| 23/02/2018 | 3 |
| 23/02/2018 | 3.6 |
| 23/02/2018 | 4.2 |
| 23/02/2018 | 4.6 |
| 23/02/2018 | 4.7 |
| 23/02/2018 | 4.8 |
| 23/02/2018 | 4.9 |
| 23/02/2018 | 4.8 |
| 23/02/2018 | 4.7 |
| 23/02/2018 | 4.6 |
| 23/02/2018 | 4.5 |
| 23/02/2018 | 4.6 |
| 23/02/2018 | 4.9 |
| 23/02/2018 | 5.1 |
| 23/02/2018 | 4.9 |
| 23/02/2018 | 4.4 |
| 23/02/2018 | 3.9 |
| 23/02/2018 | 3.5 |
| 24/02/2018 | 3.2 |
| 24/02/2018 | 2.9 |
| 24/02/2018 | 2.7 |
| 24/02/2018 | 2.6 |
| 24/02/2018 | 2.6 |
| 24/02/2018 | 2.5 |
| 24/02/2018 | 2.6 |
| 24/02/2018 | 2.8 |
| 24/02/2018 | 3 |
| 24/02/2018 | 3.4 |
| 24/02/2018 | 3.8 |
| 24/02/2018 | 4 |
| 24/02/2018 | 4.1 |
| 24/02/2018 | 4 |
| 24/02/2018 | 3.9 |
| 24/02/2018 | 3.8 |
| 24/02/2018 | 3.8 |
| 24/02/2018 | 3.8 |
| 24/02/2018 | 4.1 |
| 24/02/2018 | 4.4 |
| 24/02/2018 | 4.3 |
| 24/02/2018 | 3.9 |
| 24/02/2018 | 3.6 |
| 24/02/2018 | 3.3 |
| 25/02/2018 | 3 |
| 25/02/2018 | 2.8 |
| 25/02/2018 | 2.6 |
| 25/02/2018 | 2.5 |
| 25/02/2018 | 2.5 |
| 25/02/2018 | 2.5 |
| 25/02/2018 | 2.5 |
| 25/02/2018 | 2.6 |
| 25/02/2018 | 2.7 |
| 25/02/2018 | 3 |
| 25/02/2018 | 3.2 |
| 25/02/2018 | 3.4 |
| 25/02/2018 | 3.6 |
| 25/02/2018 | 3.6 |
| 25/02/2018 | 3.5 |
| 25/02/2018 | 3.4 |
| 25/02/2018 | 3.4 |
| 25/02/2018 | 3.5 |
| 25/02/2018 | 3.8 |
| 25/02/2018 | 4.1 |
| 25/02/2018 | 4 |
| 25/02/2018 | 3.8 |
| 25/02/2018 | 3.5 |
| 25/02/2018 | 3.3 |
| 26/02/2018 | 3 |
| 26/02/2018 | 2.8 |
| 26/02/2018 | 2.6 |
| 26/02/2018 | 2.5 |
| 26/02/2018 | 2.5 |
| 26/02/2018 | 2.6 |
| 26/02/2018 | 2.9 |
| 26/02/2018 | 3.6 |
| 26/02/2018 | 4.1 |
| 26/02/2018 | 4.5 |
| 26/02/2018 | 4.7 |
| 26/02/2018 | 4.8 |
| 26/02/2018 | 4.8 |
| 26/02/2018 | 4.8 |
| 26/02/2018 | 4.8 |
| 26/02/2018 | 4.7 |
| 26/02/2018 | 4.6 |
| 26/02/2018 | 4.7 |
| 26/02/2018 | 5 |
| 26/02/2018 | 5.3 |
| 26/02/2018 | 5.1 |
| 26/02/2018 | 4.6 |
| 26/02/2018 | 4 |
| 26/02/2018 | 3.6 |
| 27/02/2018 | 3.2 |
| 27/02/2018 | 2.9 |
| 27/02/2018 | 2.7 |
| 27/02/2018 | 2.6 |
| 27/02/2018 | 2.6 |
| 27/02/2018 | 2.7 |
| 27/02/2018 | 3 |
| 27/02/2018 | 3.6 |
| 27/02/2018 | 4.2 |
| 27/02/2018 | 4.6 |
| 27/02/2018 | 4.7 |
| 27/02/2018 | 4.8 |
| 27/02/2018 | 4.8 |
| 27/02/2018 | 4.8 |
| 27/02/2018 | 4.8 |
| 27/02/2018 | 4.7 |
| 27/02/2018 | 4.6 |
| 27/02/2018 | 4.7 |
| 27/02/2018 | 5 |
| 27/02/2018 | 5.3 |
| 27/02/2018 | 5.2 |
| 27/02/2018 | 4.6 |
| 27/02/2018 | 4 |
| 27/02/2018 | 3.6 |
| 28/02/2018 | 3.2 |
| 28/02/2018 | 2.9 |
| 28/02/2018 | 2.7 |
| 28/02/2018 | 2.6 |
| 28/02/2018 | 2.6 |
| 28/02/2018 | 2.7 |
| 28/02/2018 | 3 |
| 28/02/2018 | 3.6 |
| 28/02/2018 | 4.2 |
| 28/02/2018 | 4.6 |
| 28/02/2018 | 4.7 |
| 28/02/2018 | 4.8 |
| 28/02/2018 | 4.9 |
| 28/02/2018 | 4.8 |
| 28/02/2018 | 4.8 |
| 28/02/2018 | 4.7 |
| 28/02/2018 | 4.6 |
| 28/02/2018 | 4.7 |
| 28/02/2018 | 5 |
| 28/02/2018 | 5.2 |
| 28/02/2018 | 5.1 |
| 28/02/2018 | 4.6 |
| 28/02/2018 | 4 |
| 28/02/2018 | 3.6 |
| 01/03/2018 | 3.2 |
| 01/03/2018 | 2.9 |
| 01/03/2018 | 2.7 |
| 01/03/2018 | 2.6 |
| 01/03/2018 | 2.6 |
| 01/03/2018 | 2.7 |
| 01/03/2018 | 3 |
| 01/03/2018 | 3.6 |
| 01/03/2018 | 4.2 |
| 01/03/2018 | 4.6 |
| 01/03/2018 | 4.7 |
| 01/03/2018 | 4.8 |
| 01/03/2018 | 4.8 |
| 01/03/2018 | 4.8 |
| 01/03/2018 | 4.7 |
| 01/03/2018 | 4.7 |
| 01/03/2018 | 4.6 |
| 01/03/2018 | 4.6 |
| 01/03/2018 | 5 |
| 01/03/2018 | 5.3 |
| 01/03/2018 | 5.1 |
| 01/03/2018 | 4.6 |
| 01/03/2018 | 4 |
| 01/03/2018 | 3.6 |
| 02/03/2018 | 3.2 |
| 02/03/2018 | 2.9 |
| 02/03/2018 | 2.7 |
| 02/03/2018 | 2.6 |
| 02/03/2018 | 2.6 |
| 02/03/2018 | 2.7 |
| 02/03/2018 | 3 |
| 02/03/2018 | 3.6 |
| 02/03/2018 | 4.2 |
| 02/03/2018 | 4.5 |
| 02/03/2018 | 4.7 |
| 02/03/2018 | 4.8 |
| 02/03/2018 | 4.8 |
| 02/03/2018 | 4.8 |
| 02/03/2018 | 4.7 |
| 02/03/2018 | 4.6 |
| 02/03/2018 | 4.5 |
| 02/03/2018 | 4.5 |
| 02/03/2018 | 4.8 |
| 02/03/2018 | 5 |
| 02/03/2018 | 4.9 |
| 02/03/2018 | 4.4 |
| 02/03/2018 | 3.8 |
| 02/03/2018 | 3.5 |
| 03/03/2018 | 3.2 |
| 03/03/2018 | 2.9 |
| 03/03/2018 | 2.7 |
| 03/03/2018 | 2.6 |
| 03/03/2018 | 2.5 |
| 03/03/2018 | 2.5 |
| 03/03/2018 | 2.6 |
| 03/03/2018 | 2.8 |
| 03/03/2018 | 3 |
| 03/03/2018 | 3.4 |
| 03/03/2018 | 3.7 |
| 03/03/2018 | 3.9 |
| 03/03/2018 | 4 |
| 03/03/2018 | 4 |
| 03/03/2018 | 3.9 |
| 03/03/2018 | 3.8 |
| 03/03/2018 | 3.7 |
| 03/03/2018 | 3.8 |
| 03/03/2018 | 4 |
| 03/03/2018 | 4.3 |
| 03/03/2018 | 4.3 |
| 03/03/2018 | 3.9 |
| 03/03/2018 | 3.5 |
| 03/03/2018 | 3.3 |
| 04/03/2018 | 3 |
| 04/03/2018 | 2.8 |
| 04/03/2018 | 2.6 |
| 04/03/2018 | 2.5 |
| 04/03/2018 | 2.5 |
| 04/03/2018 | 2.5 |
| 04/03/2018 | 2.5 |
| 04/03/2018 | 2.5 |
| 04/03/2018 | 2.7 |
| 04/03/2018 | 2.9 |
| 04/03/2018 | 3.2 |
| 04/03/2018 | 3.4 |
| 04/03/2018 | 3.5 |
| 04/03/2018 | 3.6 |
| 04/03/2018 | 3.5 |
| 04/03/2018 | 3.4 |
| 04/03/2018 | 3.4 |
| 04/03/2018 | 3.4 |
| 04/03/2018 | 3.7 |
| 04/03/2018 | 4.1 |
| 04/03/2018 | 4 |
| 04/03/2018 | 3.7 |
| 04/03/2018 | 3.5 |
| 04/03/2018 | 3.3 |
| 05/03/2018 | 3 |
| 05/03/2018 | 2.8 |
| 05/03/2018 | 2.6 |
| 05/03/2018 | 2.5 |
| 05/03/2018 | 2.5 |
| 05/03/2018 | 2.6 |
| 05/03/2018 | 2.9 |
| 05/03/2018 | 3.5 |
| 05/03/2018 | 4.1 |
| 05/03/2018 | 4.5 |
| 05/03/2018 | 4.6 |
| 05/03/2018 | 4.7 |
| 05/03/2018 | 4.8 |
| 05/03/2018 | 4.8 |
| 05/03/2018 | 4.7 |
| 05/03/2018 | 4.7 |
| 05/03/2018 | 4.6 |
| 05/03/2018 | 4.6 |
| 05/03/2018 | 4.9 |
| 05/03/2018 | 5.2 |
| 05/03/2018 | 5.1 |
| 05/03/2018 | 4.5 |
| 05/03/2018 | 4 |
| 05/03/2018 | 3.6 |
| 06/03/2018 | 3.2 |
| 06/03/2018 | 2.9 |
| 06/03/2018 | 2.7 |
| 06/03/2018 | 2.6 |
| 06/03/2018 | 2.6 |
| 06/03/2018 | 2.7 |
| 06/03/2018 | 3 |
| 06/03/2018 | 3.6 |
| 06/03/2018 | 4.2 |
| 06/03/2018 | 4.5 |
| 06/03/2018 | 4.7 |
| 06/03/2018 | 4.8 |
| 06/03/2018 | 4.8 |
| 06/03/2018 | 4.8 |
| 06/03/2018 | 4.7 |
| 06/03/2018 | 4.6 |
| 06/03/2018 | 4.6 |
| 06/03/2018 | 4.6 |
| 06/03/2018 | 4.9 |
| 06/03/2018 | 5.2 |
| 06/03/2018 | 5.1 |
| 06/03/2018 | 4.6 |
| 06/03/2018 | 4 |
| 06/03/2018 | 3.6 |
| 07/03/2018 | 3.2 |
| 07/03/2018 | 2.9 |
| 07/03/2018 | 2.7 |
| 07/03/2018 | 2.6 |
| 07/03/2018 | 2.6 |
| 07/03/2018 | 2.7 |
| 07/03/2018 | 3 |
| 07/03/2018 | 3.6 |
| 07/03/2018 | 4.2 |
| 07/03/2018 | 4.5 |
| 07/03/2018 | 4.7 |
| 07/03/2018 | 4.8 |
| 07/03/2018 | 4.8 |
| 07/03/2018 | 4.8 |
| 07/03/2018 | 4.7 |
| 07/03/2018 | 4.6 |
| 07/03/2018 | 4.6 |
| 07/03/2018 | 4.6 |
| 07/03/2018 | 4.9 |
| 07/03/2018 | 5.2 |
| 07/03/2018 | 5.1 |
| 07/03/2018 | 4.5 |
| 07/03/2018 | 4 |
| 07/03/2018 | 3.6 |
| 08/03/2018 | 3.2 |
| 08/03/2018 | 2.9 |
| 08/03/2018 | 2.7 |
| 08/03/2018 | 2.6 |
| 08/03/2018 | 2.6 |
| 08/03/2018 | 2.7 |
| 08/03/2018 | 3 |
| 08/03/2018 | 3.6 |
| 08/03/2018 | 4.2 |
| 08/03/2018 | 4.5 |
| 08/03/2018 | 4.7 |
| 08/03/2018 | 4.8 |
| 08/03/2018 | 4.8 |
| 08/03/2018 | 4.8 |
| 08/03/2018 | 4.7 |
| 08/03/2018 | 4.6 |
| 08/03/2018 | 4.5 |
| 08/03/2018 | 4.5 |
| 08/03/2018 | 4.9 |
| 08/03/2018 | 5.2 |
| 08/03/2018 | 5.1 |
| 08/03/2018 | 4.5 |
| 08/03/2018 | 4 |
| 08/03/2018 | 3.6 |
| 09/03/2018 | 3.2 |
| 09/03/2018 | 2.9 |
| 09/03/2018 | 2.7 |
| 09/03/2018 | 2.6 |
| 09/03/2018 | 2.6 |
| 09/03/2018 | 2.7 |
| 09/03/2018 | 3 |
| 09/03/2018 | 3.6 |
| 09/03/2018 | 4.1 |
| 09/03/2018 | 4.5 |
| 09/03/2018 | 4.7 |
| 09/03/2018 | 4.8 |
| 09/03/2018 | 4.8 |
| 09/03/2018 | 4.7 |
| 09/03/2018 | 4.6 |
| 09/03/2018 | 4.5 |
| 09/03/2018 | 4.4 |
| 09/03/2018 | 4.4 |
| 09/03/2018 | 4.7 |
| 09/03/2018 | 5 |
| 09/03/2018 | 4.8 |
| 09/03/2018 | 4.3 |
| 09/03/2018 | 3.8 |
| 09/03/2018 | 3.5 |
| 10/03/2018 | 3.1 |
| 10/03/2018 | 2.9 |
| 10/03/2018 | 2.7 |
| 10/03/2018 | 2.6 |
| 10/03/2018 | 2.5 |
| 10/03/2018 | 2.5 |
| 10/03/2018 | 2.6 |
| 10/03/2018 | 2.8 |
| 10/03/2018 | 3 |
| 10/03/2018 | 3.4 |
| 10/03/2018 | 3.7 |
| 10/03/2018 | 3.9 |
| 10/03/2018 | 4 |
| 10/03/2018 | 4 |
| 10/03/2018 | 3.8 |
| 10/03/2018 | 3.7 |
| 10/03/2018 | 3.7 |
| 10/03/2018 | 3.7 |
| 10/03/2018 | 3.9 |
| 10/03/2018 | 4.3 |
| 10/03/2018 | 4.2 |
| 10/03/2018 | 3.9 |
| 10/03/2018 | 3.5 |
| 10/03/2018 | 3.2 |
| 11/03/2018 | 3 |
| 11/03/2018 | 2.7 |
| 11/03/2018 | 2.6 |
| 11/03/2018 | 2.5 |
| 11/03/2018 | 2.5 |
| 11/03/2018 | 2.4 |
| 11/03/2018 | 2.5 |
| 11/03/2018 | 2.5 |
| 11/03/2018 | 2.7 |
| 11/03/2018 | 2.9 |
| 11/03/2018 | 3.2 |
| 11/03/2018 | 3.3 |
| 11/03/2018 | 3.5 |
| 11/03/2018 | 3.5 |
| 11/03/2018 | 3.4 |
| 11/03/2018 | 3.4 |
| 11/03/2018 | 3.3 |
| 11/03/2018 | 3.3 |
| 11/03/2018 | 3.6 |
| 11/03/2018 | 4 |
| 11/03/2018 | 4 |
| 11/03/2018 | 3.7 |
| 11/03/2018 | 3.4 |
| 11/03/2018 | 3.2 |
| 12/03/2018 | 3 |
| 12/03/2018 | 2.7 |
| 12/03/2018 | 2.6 |
| 12/03/2018 | 2.5 |
| 12/03/2018 | 2.5 |
| 12/03/2018 | 2.6 |
| 12/03/2018 | 2.9 |
| 12/03/2018 | 3.5 |
| 12/03/2018 | 4.1 |
| 12/03/2018 | 4.4 |
| 12/03/2018 | 4.6 |
| 12/03/2018 | 4.7 |
| 12/03/2018 | 4.7 |
| 12/03/2018 | 4.7 |
| 12/03/2018 | 4.7 |
| 12/03/2018 | 4.6 |
| 12/03/2018 | 4.5 |
| 12/03/2018 | 4.5 |
| 12/03/2018 | 4.8 |
| 12/03/2018 | 5.1 |
| 12/03/2018 | 5 |
| 12/03/2018 | 4.5 |
| 12/03/2018 | 4 |
| 12/03/2018 | 3.5 |
| 13/03/2018 | 3.1 |
| 13/03/2018 | 2.9 |
| 13/03/2018 | 2.7 |
| 13/03/2018 | 2.6 |
| 13/03/2018 | 2.6 |
| 13/03/2018 | 2.7 |
| 13/03/2018 | 3 |
| 13/03/2018 | 3.6 |
| 13/03/2018 | 4.1 |
| 13/03/2018 | 4.5 |
| 13/03/2018 | 4.7 |
| 13/03/2018 | 4.7 |
| 13/03/2018 | 4.7 |
| 13/03/2018 | 4.7 |
| 13/03/2018 | 4.7 |
| 13/03/2018 | 4.6 |
| 13/03/2018 | 4.5 |
| 13/03/2018 | 4.5 |
| 13/03/2018 | 4.8 |
| 13/03/2018 | 5.2 |
| 13/03/2018 | 5.1 |
| 13/03/2018 | 4.5 |
| 13/03/2018 | 4 |
| 13/03/2018 | 3.6 |
| 14/03/2018 | 3.2 |
| 14/03/2018 | 2.9 |
| 14/03/2018 | 2.7 |
| 14/03/2018 | 2.6 |
| 14/03/2018 | 2.6 |
| 14/03/2018 | 2.7 |
| 14/03/2018 | 3 |
| 14/03/2018 | 3.6 |
| 14/03/2018 | 4.1 |
| 14/03/2018 | 4.5 |
| 14/03/2018 | 4.7 |
| 14/03/2018 | 4.7 |
| 14/03/2018 | 4.8 |
| 14/03/2018 | 4.7 |
| 14/03/2018 | 4.6 |
| 14/03/2018 | 4.6 |
| 14/03/2018 | 4.5 |
| 14/03/2018 | 4.5 |
| 14/03/2018 | 4.8 |
| 14/03/2018 | 5.1 |
| 14/03/2018 | 5 |
| 14/03/2018 | 4.5 |
| 14/03/2018 | 4 |
| 14/03/2018 | 3.6 |
| 15/03/2018 | 3.2 |
| 15/03/2018 | 2.9 |
| 15/03/2018 | 2.7 |
| 15/03/2018 | 2.6 |
| 15/03/2018 | 2.6 |
| 15/03/2018 | 2.7 |
| 15/03/2018 | 3 |
| 15/03/2018 | 3.6 |
| 15/03/2018 | 4.1 |
| 15/03/2018 | 4.5 |
| 15/03/2018 | 4.6 |
| 15/03/2018 | 4.7 |
| 15/03/2018 | 4.7 |
| 15/03/2018 | 4.7 |
| 15/03/2018 | 4.6 |
| 15/03/2018 | 4.6 |
| 15/03/2018 | 4.5 |
| 15/03/2018 | 4.5 |
| 15/03/2018 | 4.8 |
| 15/03/2018 | 5.1 |
| 15/03/2018 | 5 |
| 15/03/2018 | 4.5 |
| 15/03/2018 | 4 |
| 15/03/2018 | 3.6 |
| 16/03/2018 | 3.2 |
| 16/03/2018 | 2.9 |
| 16/03/2018 | 2.7 |
| 16/03/2018 | 2.6 |
| 16/03/2018 | 2.6 |
| 16/03/2018 | 2.7 |
| 16/03/2018 | 3 |
| 16/03/2018 | 3.6 |
| 16/03/2018 | 4.1 |
| 16/03/2018 | 4.5 |
| 16/03/2018 | 4.6 |
| 16/03/2018 | 4.7 |
| 16/03/2018 | 4.7 |
| 16/03/2018 | 4.7 |
| 16/03/2018 | 4.5 |
| 16/03/2018 | 4.4 |
| 16/03/2018 | 4.4 |
| 16/03/2018 | 4.3 |
| 16/03/2018 | 4.6 |
| 16/03/2018 | 4.9 |
| 16/03/2018 | 4.8 |
| 16/03/2018 | 4.3 |
| 16/03/2018 | 3.8 |
| 16/03/2018 | 3.4 |
| 17/03/2018 | 3.1 |
| 17/03/2018 | 2.8 |
| 17/03/2018 | 2.7 |
| 17/03/2018 | 2.6 |
| 17/03/2018 | 2.5 |
| 17/03/2018 | 2.5 |
| 17/03/2018 | 2.6 |
| 17/03/2018 | 2.7 |
| 17/03/2018 | 3 |
| 17/03/2018 | 3.3 |
| 17/03/2018 | 3.7 |
| 17/03/2018 | 3.9 |
| 17/03/2018 | 3.9 |
| 17/03/2018 | 3.9 |
| 17/03/2018 | 3.8 |
| 17/03/2018 | 3.7 |
| 17/03/2018 | 3.6 |
| 17/03/2018 | 3.6 |
| 17/03/2018 | 3.9 |
| 17/03/2018 | 4.2 |
| 17/03/2018 | 4.2 |
| 17/03/2018 | 3.9 |
| 17/03/2018 | 3.5 |
| 17/03/2018 | 3.2 |
| 18/03/2018 | 2.9 |
| 18/03/2018 | 2.7 |
| 18/03/2018 | 2.6 |
| 18/03/2018 | 2.5 |
| 18/03/2018 | 2.4 |
| 18/03/2018 | 2.4 |
| 18/03/2018 | 2.5 |
| 18/03/2018 | 2.5 |
| 18/03/2018 | 2.6 |
| 18/03/2018 | 2.9 |
| 18/03/2018 | 3.1 |
| 18/03/2018 | 3.3 |
| 18/03/2018 | 3.5 |
| 18/03/2018 | 3.5 |
| 18/03/2018 | 3.4 |
| 18/03/2018 | 3.3 |
| 18/03/2018 | 3.3 |
| 18/03/2018 | 3.3 |
| 18/03/2018 | 3.6 |
| 18/03/2018 | 4 |
| 18/03/2018 | 3.9 |
| 18/03/2018 | 3.7 |
| 18/03/2018 | 3.4 |
| 18/03/2018 | 3.2 |
| 19/03/2018 | 2.9 |
| 19/03/2018 | 2.7 |
| 19/03/2018 | 2.6 |
| 19/03/2018 | 2.5 |
| 19/03/2018 | 2.5 |
| 19/03/2018 | 2.6 |
| 19/03/2018 | 2.9 |
| 19/03/2018 | 3.5 |
| 19/03/2018 | 4 |
| 19/03/2018 | 4.4 |
| 19/03/2018 | 4.6 |
| 19/03/2018 | 4.7 |
| 19/03/2018 | 4.7 |
| 19/03/2018 | 4.7 |
| 19/03/2018 | 4.6 |
| 19/03/2018 | 4.5 |
| 19/03/2018 | 4.4 |
| 19/03/2018 | 4.4 |
| 19/03/2018 | 4.7 |
| 19/03/2018 | 5.1 |
| 19/03/2018 | 5 |
| 19/03/2018 | 4.5 |
| 19/03/2018 | 3.9 |
| 19/03/2018 | 3.5 |
| 20/03/2018 | 3.1 |
| 20/03/2018 | 2.9 |
| 20/03/2018 | 2.7 |
| 20/03/2018 | 2.6 |
| 20/03/2018 | 2.6 |
| 20/03/2018 | 2.7 |
| 20/03/2018 | 3 |
| 20/03/2018 | 3.6 |
| 20/03/2018 | 4.1 |
| 20/03/2018 | 4.5 |
| 20/03/2018 | 4.6 |
| 20/03/2018 | 4.7 |
| 20/03/2018 | 4.7 |
| 20/03/2018 | 4.7 |
| 20/03/2018 | 4.6 |
| 20/03/2018 | 4.5 |
| 20/03/2018 | 4.5 |
| 20/03/2018 | 4.4 |
| 20/03/2018 | 4.7 |
| 20/03/2018 | 5.1 |
| 20/03/2018 | 5 |
| 20/03/2018 | 4.5 |
| 20/03/2018 | 4 |
| 20/03/2018 | 3.5 |
| 21/03/2018 | 3.1 |
| 21/03/2018 | 2.9 |
| 21/03/2018 | 2.7 |
| 21/03/2018 | 2.6 |
| 21/03/2018 | 2.6 |
| 21/03/2018 | 2.7 |
| 21/03/2018 | 3 |
| 21/03/2018 | 3.6 |
| 21/03/2018 | 4.1 |
| 21/03/2018 | 4.5 |
| 21/03/2018 | 4.6 |
| 21/03/2018 | 4.7 |
| 21/03/2018 | 4.7 |
| 21/03/2018 | 4.7 |
| 21/03/2018 | 4.6 |
| 21/03/2018 | 4.5 |
| 21/03/2018 | 4.4 |
| 21/03/2018 | 4.4 |
| 21/03/2018 | 4.7 |
| 21/03/2018 | 5.1 |
| 21/03/2018 | 5 |
| 21/03/2018 | 4.5 |
| 21/03/2018 | 3.9 |
| 21/03/2018 | 3.5 |
| 22/03/2018 | 3.1 |
| 22/03/2018 | 2.9 |
| 22/03/2018 | 2.7 |
| 22/03/2018 | 2.6 |
| 22/03/2018 | 2.6 |
| 22/03/2018 | 2.7 |
| 22/03/2018 | 3 |
| 22/03/2018 | 3.6 |
| 22/03/2018 | 4.1 |
| 22/03/2018 | 4.5 |
| 22/03/2018 | 4.6 |
| 22/03/2018 | 4.7 |
| 22/03/2018 | 4.7 |
| 22/03/2018 | 4.7 |
| 22/03/2018 | 4.6 |
| 22/03/2018 | 4.5 |
| 22/03/2018 | 4.4 |
| 22/03/2018 | 4.4 |
| 22/03/2018 | 4.7 |
| 22/03/2018 | 5.1 |
| 22/03/2018 | 5 |
| 22/03/2018 | 4.5 |
| 22/03/2018 | 3.9 |
| 22/03/2018 | 3.5 |
| 23/03/2018 | 3.1 |
| 23/03/2018 | 2.9 |
| 23/03/2018 | 2.7 |
| 23/03/2018 | 2.6 |
| 23/03/2018 | 2.6 |
| 23/03/2018 | 2.7 |
| 23/03/2018 | 3 |
| 23/03/2018 | 3.5 |
| 23/03/2018 | 4.1 |
| 23/03/2018 | 4.4 |
| 23/03/2018 | 4.6 |
| 23/03/2018 | 4.7 |
| 23/03/2018 | 4.7 |
| 23/03/2018 | 4.6 |
| 23/03/2018 | 4.5 |
| 23/03/2018 | 4.4 |
| 23/03/2018 | 4.3 |
| 23/03/2018 | 4.2 |
| 23/03/2018 | 4.5 |
| 23/03/2018 | 4.8 |
| 23/03/2018 | 4.8 |
| 23/03/2018 | 4.3 |
| 23/03/2018 | 3.8 |
| 23/03/2018 | 3.4 |
| 24/03/2018 | 3.1 |
| 24/03/2018 | 2.8 |
| 24/03/2018 | 2.6 |
| 24/03/2018 | 2.6 |
| 24/03/2018 | 2.5 |
| 24/03/2018 | 2.5 |
| 24/03/2018 | 2.6 |
| 24/03/2018 | 2.7 |
| 24/03/2018 | 2.9 |
| 24/03/2018 | 3.3 |
| 24/03/2018 | 3.6 |
| 24/03/2018 | 3.8 |
| 24/03/2018 | 3.9 |
| 24/03/2018 | 3.9 |
| 24/03/2018 | 3.7 |
| 24/03/2018 | 3.6 |
| 24/03/2018 | 3.6 |
| 24/03/2018 | 3.5 |
| 24/03/2018 | 3.8 |
| 24/03/2018 | 4.2 |
| 24/03/2018 | 4.2 |
| 24/03/2018 | 3.8 |
| 24/03/2018 | 3.5 |
| 24/03/2018 | 3.2 |
| 25/03/2018 | 2.9 |
| 25/03/2018 | 2.6 |
| 25/03/2018 | 2.5 |
| 25/03/2018 | 0 |
| 25/03/2018 | 2.4 |
| 25/03/2018 | 2.4 |
| 25/03/2018 | 2.4 |
| 25/03/2018 | 2.4 |
| 25/03/2018 | 2.5 |
| 25/03/2018 | 2.8 |
| 25/03/2018 | 3.1 |
| 25/03/2018 | 3.2 |
| 25/03/2018 | 3.4 |
| 25/03/2018 | 3.4 |
| 25/03/2018 | 3.3 |
| 25/03/2018 | 3.2 |
| 25/03/2018 | 3.2 |
| 25/03/2018 | 3.2 |
| 25/03/2018 | 3.2 |
| 25/03/2018 | 3.4 |
| 25/03/2018 | 3.5 |
| 25/03/2018 | 3.6 |
| 25/03/2018 | 3.4 |
| 25/03/2018 | 3.2 |
| 26/03/2018 | 2.9 |
| 26/03/2018 | 2.7 |
| 26/03/2018 | 2.5 |
| 26/03/2018 | 2.4 |
| 26/03/2018 | 2.4 |
| 26/03/2018 | 2.5 |
| 26/03/2018 | 2.8 |
| 26/03/2018 | 3.2 |
| 26/03/2018 | 3.7 |
| 26/03/2018 | 4.1 |
| 26/03/2018 | 4.3 |
| 26/03/2018 | 4.5 |
| 26/03/2018 | 4.5 |
| 26/03/2018 | 4.5 |
| 26/03/2018 | 4.5 |
| 26/03/2018 | 4.4 |
| 26/03/2018 | 4.3 |
| 26/03/2018 | 4.2 |
| 26/03/2018 | 4.2 |
| 26/03/2018 | 4.3 |
| 26/03/2018 | 4.3 |
| 26/03/2018 | 4.2 |
| 26/03/2018 | 3.9 |
| 26/03/2018 | 3.4 |
| 27/03/2018 | 3.1 |
| 27/03/2018 | 2.8 |
| 27/03/2018 | 2.6 |
| 27/03/2018 | 2.5 |
| 27/03/2018 | 2.5 |
| 27/03/2018 | 2.6 |
| 27/03/2018 | 2.8 |
| 27/03/2018 | 3.3 |
| 27/03/2018 | 3.8 |
| 27/03/2018 | 4.2 |
| 27/03/2018 | 4.4 |
| 27/03/2018 | 4.5 |
| 27/03/2018 | 4.5 |
| 27/03/2018 | 4.5 |
| 27/03/2018 | 4.5 |
| 27/03/2018 | 4.3 |
| 27/03/2018 | 4.3 |
| 27/03/2018 | 4.2 |
| 27/03/2018 | 4.2 |
| 27/03/2018 | 4.3 |
| 27/03/2018 | 4.4 |
| 27/03/2018 | 4.3 |
| 27/03/2018 | 3.9 |
| 27/03/2018 | 3.4 |
| 28/03/2018 | 3.1 |
| 28/03/2018 | 2.8 |
| 28/03/2018 | 2.6 |
| 28/03/2018 | 2.5 |
| 28/03/2018 | 2.5 |
| 28/03/2018 | 2.6 |
| 28/03/2018 | 2.8 |
| 28/03/2018 | 3.3 |
| 28/03/2018 | 3.8 |
| 28/03/2018 | 4.2 |
| 28/03/2018 | 4.4 |
| 28/03/2018 | 4.5 |
| 28/03/2018 | 4.5 |
| 28/03/2018 | 4.5 |
| 28/03/2018 | 4.4 |
| 28/03/2018 | 4.3 |
| 28/03/2018 | 4.3 |
| 28/03/2018 | 4.2 |
| 28/03/2018 | 4.2 |
| 28/03/2018 | 4.3 |
| 28/03/2018 | 4.3 |
| 28/03/2018 | 4.2 |
| 28/03/2018 | 3.9 |
| 28/03/2018 | 3.4 |
| 29/03/2018 | 3.1 |
| 29/03/2018 | 2.8 |
| 29/03/2018 | 2.6 |
| 29/03/2018 | 2.5 |
| 29/03/2018 | 2.5 |
| 29/03/2018 | 2.6 |
| 29/03/2018 | 2.9 |
| 29/03/2018 | 3.3 |
| 29/03/2018 | 3.8 |
| 29/03/2018 | 4.2 |
| 29/03/2018 | 4.4 |
| 29/03/2018 | 4.5 |
| 29/03/2018 | 4.5 |
| 29/03/2018 | 4.5 |
| 29/03/2018 | 4.4 |
| 29/03/2018 | 4.3 |
| 29/03/2018 | 4.2 |
| 29/03/2018 | 4.1 |
| 29/03/2018 | 4.2 |
| 29/03/2018 | 4.3 |
| 29/03/2018 | 4.3 |
| 29/03/2018 | 4.2 |
| 29/03/2018 | 3.9 |
| 29/03/2018 | 3.4 |
| 30/03/2018 | 3.1 |
| 30/03/2018 | 2.7 |
| 30/03/2018 | 2.6 |
| 30/03/2018 | 2.5 |
| 30/03/2018 | 2.4 |
| 30/03/2018 | 2.4 |
| 30/03/2018 | 2.4 |
| 30/03/2018 | 2.4 |
| 30/03/2018 | 2.6 |
| 30/03/2018 | 2.8 |
| 30/03/2018 | 3.1 |
| 30/03/2018 | 3.3 |
| 30/03/2018 | 3.4 |
| 30/03/2018 | 3.4 |
| 30/03/2018 | 3.3 |
| 30/03/2018 | 3.2 |
| 30/03/2018 | 3.1 |
| 30/03/2018 | 3 |
| 30/03/2018 | 3.1 |
| 30/03/2018 | 3.2 |
| 30/03/2018 | 3.2 |
| 30/03/2018 | 3.3 |
| 30/03/2018 | 3.2 |
| 30/03/2018 | 3 |
| 31/03/2018 | 2.8 |
| 31/03/2018 | 2.8 |
| 31/03/2018 | 2.6 |
| 31/03/2018 | 2.5 |
| 31/03/2018 | 2.4 |
| 31/03/2018 | 2.4 |
| 31/03/2018 | 2.5 |
| 31/03/2018 | 2.5 |
| 31/03/2018 | 2.7 |
| 31/03/2018 | 3.1 |
| 31/03/2018 | 3.4 |
| 31/03/2018 | 3.7 |
| 31/03/2018 | 3.8 |
| 31/03/2018 | 3.7 |
| 31/03/2018 | 3.6 |
| 31/03/2018 | 3.5 |
| 31/03/2018 | 3.4 |
| 31/03/2018 | 3.3 |
| 31/03/2018 | 3.4 |
| 31/03/2018 | 3.5 |
| 31/03/2018 | 3.6 |
| 31/03/2018 | 3.6 |
| 31/03/2018 | 3.4 |
| 31/03/2018 | 3.1 |
| 01/04/2018 | 2.9 |
| 01/04/2018 | 2.7 |
| 01/04/2018 | 2.5 |
| 01/04/2018 | 2.4 |
| 01/04/2018 | 2.4 |
| 01/04/2018 | 2.4 |
| 01/04/2018 | 2.4 |
| 01/04/2018 | 2.4 |
| 01/04/2018 | 2.6 |
| 01/04/2018 | 2.8 |
| 01/04/2018 | 3 |
| 01/04/2018 | 3.2 |
| 01/04/2018 | 3.3 |
| 01/04/2018 | 3.3 |
| 01/04/2018 | 3.2 |
| 01/04/2018 | 3.1 |
| 01/04/2018 | 3 |
| 01/04/2018 | 3 |
| 01/04/2018 | 3.1 |
| 01/04/2018 | 3.1 |
| 01/04/2018 | 3.3 |
| 01/04/2018 | 3.4 |
| 01/04/2018 | 3.2 |
| 01/04/2018 | 3.1 |
| 02/04/2018 | 2.9 |
| 02/04/2018 | 2.7 |
| 02/04/2018 | 2.5 |
| 02/04/2018 | 2.4 |
| 02/04/2018 | 2.4 |
| 02/04/2018 | 2.4 |
| 02/04/2018 | 2.4 |
| 02/04/2018 | 2.4 |
| 02/04/2018 | 2.6 |
| 02/04/2018 | 2.8 |
| 02/04/2018 | 3 |
| 02/04/2018 | 3.2 |
| 02/04/2018 | 3.3 |
| 02/04/2018 | 3.3 |
| 02/04/2018 | 3.2 |
| 02/04/2018 | 3.1 |
| 02/04/2018 | 3 |
| 02/04/2018 | 3 |
| 02/04/2018 | 3.1 |
| 02/04/2018 | 3.1 |
| 02/04/2018 | 3.3 |
| 02/04/2018 | 3.4 |
| 02/04/2018 | 3.2 |
| 02/04/2018 | 3.1 |
| 03/04/2018 | 2.9 |
| 03/04/2018 | 2.8 |
| 03/04/2018 | 2.6 |
| 03/04/2018 | 2.5 |
| 03/04/2018 | 2.5 |
| 03/04/2018 | 2.6 |
| 03/04/2018 | 2.8 |
| 03/04/2018 | 3.3 |
| 03/04/2018 | 3.8 |
| 03/04/2018 | 4.1 |
| 03/04/2018 | 4.4 |
| 03/04/2018 | 4.5 |
| 03/04/2018 | 4.5 |
| 03/04/2018 | 4.5 |
| 03/04/2018 | 4.4 |
| 03/04/2018 | 4.3 |
| 03/04/2018 | 4.2 |
| 03/04/2018 | 4.1 |
| 03/04/2018 | 4.1 |
| 03/04/2018 | 4.3 |
| 03/04/2018 | 4.3 |
| 03/04/2018 | 4.2 |
| 03/04/2018 | 3.9 |
| 03/04/2018 | 3.4 |
| 04/04/2018 | 3.1 |
| 04/04/2018 | 2.8 |
| 04/04/2018 | 2.6 |
| 04/04/2018 | 2.5 |
| 04/04/2018 | 2.5 |
| 04/04/2018 | 2.6 |
| 04/04/2018 | 2.8 |
| 04/04/2018 | 3.3 |
| 04/04/2018 | 3.8 |
| 04/04/2018 | 4.1 |
| 04/04/2018 | 4.4 |
| 04/04/2018 | 4.5 |
| 04/04/2018 | 4.5 |
| 04/04/2018 | 4.5 |
| 04/04/2018 | 4.4 |
| 04/04/2018 | 4.3 |
| 04/04/2018 | 4.2 |
| 04/04/2018 | 4.1 |
| 04/04/2018 | 4.1 |
| 04/04/2018 | 4.3 |
| 04/04/2018 | 4.3 |
| 04/04/2018 | 4.2 |
| 04/04/2018 | 3.8 |
| 04/04/2018 | 3.4 |
| 05/04/2018 | 3.1 |
| 05/04/2018 | 2.8 |
| 05/04/2018 | 2.6 |
| 05/04/2018 | 2.5 |
| 05/04/2018 | 2.5 |
| 05/04/2018 | 2.6 |
| 05/04/2018 | 2.8 |
| 05/04/2018 | 3.3 |
| 05/04/2018 | 3.8 |
| 05/04/2018 | 4.1 |
| 05/04/2018 | 4.3 |
| 05/04/2018 | 4.5 |
| 05/04/2018 | 4.5 |
| 05/04/2018 | 4.5 |
| 05/04/2018 | 4.4 |
| 05/04/2018 | 4.3 |
| 05/04/2018 | 4.2 |
| 05/04/2018 | 4.1 |
| 05/04/2018 | 4.1 |
| 05/04/2018 | 4.3 |
| 05/04/2018 | 4.3 |
| 05/04/2018 | 4.2 |
| 05/04/2018 | 3.9 |
| 05/04/2018 | 3.4 |
| 06/04/2018 | 3.1 |
| 06/04/2018 | 2.8 |
| 06/04/2018 | 2.6 |
| 06/04/2018 | 2.5 |
| 06/04/2018 | 2.5 |
| 06/04/2018 | 2.6 |
| 06/04/2018 | 2.8 |
| 06/04/2018 | 3.3 |
| 06/04/2018 | 3.7 |
| 06/04/2018 | 4.1 |
| 06/04/2018 | 4.3 |
| 06/04/2018 | 4.5 |
| 06/04/2018 | 4.5 |
| 06/04/2018 | 4.5 |
| 06/04/2018 | 4.3 |
| 06/04/2018 | 4.2 |
| 06/04/2018 | 4.1 |
| 06/04/2018 | 4 |
| 06/04/2018 | 4 |
| 06/04/2018 | 4.1 |
| 06/04/2018 | 4.1 |
| 06/04/2018 | 4 |
| 06/04/2018 | 3.7 |
| 06/04/2018 | 3.3 |
| 07/04/2018 | 3 |
| 07/04/2018 | 2.7 |
| 07/04/2018 | 2.6 |
| 07/04/2018 | 2.5 |
| 07/04/2018 | 2.4 |
| 07/04/2018 | 2.4 |
| 07/04/2018 | 2.5 |
| 07/04/2018 | 2.6 |
| 07/04/2018 | 2.8 |
| 07/04/2018 | 3.2 |
| 07/04/2018 | 3.5 |
| 07/04/2018 | 3.7 |
| 07/04/2018 | 3.8 |
| 07/04/2018 | 3.8 |
| 07/04/2018 | 3.7 |
| 07/04/2018 | 3.5 |
| 07/04/2018 | 3.5 |
| 07/04/2018 | 3.4 |
| 07/04/2018 | 3.4 |
| 07/04/2018 | 3.6 |
| 07/04/2018 | 3.7 |
| 07/04/2018 | 3.7 |
| 07/04/2018 | 3.4 |
| 07/04/2018 | 3.1 |
| 08/04/2018 | 2.9 |
| 08/04/2018 | 2.6 |
| 08/04/2018 | 2.5 |
| 08/04/2018 | 2.4 |
| 08/04/2018 | 2.4 |
| 08/04/2018 | 2.3 |
| 08/04/2018 | 2.4 |
| 08/04/2018 | 2.4 |
| 08/04/2018 | 2.5 |
| 08/04/2018 | 2.8 |
| 08/04/2018 | 3 |
| 08/04/2018 | 3.2 |
| 08/04/2018 | 3.3 |
| 08/04/2018 | 3.4 |
| 08/04/2018 | 3.3 |
| 08/04/2018 | 3.2 |
| 08/04/2018 | 3.1 |
| 08/04/2018 | 3.1 |
| 08/04/2018 | 3.1 |
| 08/04/2018 | 3.4 |
| 08/04/2018 | 3.5 |
| 08/04/2018 | 3.5 |
| 08/04/2018 | 3.3 |
| 08/04/2018 | 3.1 |
| 09/04/2018 | 2.9 |
| 09/04/2018 | 2.6 |
| 09/04/2018 | 2.5 |
| 09/04/2018 | 2.4 |
| 09/04/2018 | 2.4 |
| 09/04/2018 | 2.5 |
| 09/04/2018 | 2.8 |
| 09/04/2018 | 3.3 |
| 09/04/2018 | 3.8 |
| 09/04/2018 | 4.2 |
| 09/04/2018 | 4.4 |
| 09/04/2018 | 4.5 |
| 09/04/2018 | 4.5 |
| 09/04/2018 | 4.5 |
| 09/04/2018 | 4.5 |
| 09/04/2018 | 4.4 |
| 09/04/2018 | 4.3 |
| 09/04/2018 | 4.2 |
| 09/04/2018 | 4.2 |
| 09/04/2018 | 4.4 |
| 09/04/2018 | 4.4 |
| 09/04/2018 | 4.3 |
| 09/04/2018 | 3.9 |
| 09/04/2018 | 3.4 |
| 10/04/2018 | 3 |
| 10/04/2018 | 2.7 |
| 10/04/2018 | 2.6 |
| 10/04/2018 | 2.5 |
| 10/04/2018 | 2.5 |
| 10/04/2018 | 2.6 |
| 10/04/2018 | 2.8 |
| 10/04/2018 | 3.4 |
| 10/04/2018 | 3.9 |
| 10/04/2018 | 4.3 |
| 10/04/2018 | 4.4 |
| 10/04/2018 | 4.5 |
| 10/04/2018 | 4.5 |
| 10/04/2018 | 4.5 |
| 10/04/2018 | 4.5 |
| 10/04/2018 | 4.4 |
| 10/04/2018 | 4.3 |
| 10/04/2018 | 4.2 |
| 10/04/2018 | 4.2 |
| 10/04/2018 | 4.4 |
| 10/04/2018 | 4.5 |
| 10/04/2018 | 4.3 |
| 10/04/2018 | 3.9 |
| 10/04/2018 | 3.4 |
| 10/04/2018 | 3 |
| 11/04/2018 | 2.8 |
| 11/04/2018 | 2.6 |
| 11/04/2018 | 2.5 |
| 11/04/2018 | 2.5 |
| 11/04/2018 | 2.6 |
| 11/04/2018 | 2.8 |
| 11/04/2018 | 3.4 |
| 11/04/2018 | 3.9 |
| 11/04/2018 | 4.3 |
| 11/04/2018 | 4.5 |
| 11/04/2018 | 4.5 |
| 11/04/2018 | 4.6 |
| 11/04/2018 | 4.6 |
| 11/04/2018 | 4.5 |
| 11/04/2018 | 4.4 |
| 11/04/2018 | 4.3 |
| 11/04/2018 | 4.2 |
| 11/04/2018 | 4.2 |
| 11/04/2018 | 4.4 |
| 11/04/2018 | 4.4 |
| 11/04/2018 | 4.3 |
| 11/04/2018 | 3.9 |
| 11/04/2018 | 3.4 |
| 11/04/2018 | 3.1 |
| 12/04/2018 | 2.8 |
| 12/04/2018 | 2.6 |
| 12/04/2018 | 2.5 |
| 12/04/2018 | 2.5 |
| 12/04/2018 | 2.6 |
| 12/04/2018 | 2.8 |
| 12/04/2018 | 3.4 |
| 12/04/2018 | 3.9 |
| 12/04/2018 | 4.3 |
| 12/04/2018 | 4.4 |
| 12/04/2018 | 4.5 |
| 12/04/2018 | 4.5 |
| 12/04/2018 | 4.5 |
| 12/04/2018 | 4.5 |
| 12/04/2018 | 4.4 |
| 12/04/2018 | 4.3 |
| 12/04/2018 | 4.2 |
| 12/04/2018 | 4.2 |
| 12/04/2018 | 4.4 |
| 12/04/2018 | 4.4 |
| 12/04/2018 | 4.3 |
| 12/04/2018 | 3.9 |
| 12/04/2018 | 3.4 |
| 12/04/2018 | 3.1 |
| 13/04/2018 | 2.8 |
| 13/04/2018 | 2.6 |
| 13/04/2018 | 2.5 |
| 13/04/2018 | 2.5 |
| 13/04/2018 | 2.6 |
| 13/04/2018 | 2.8 |
| 13/04/2018 | 3.3 |
| 13/04/2018 | 3.9 |
| 13/04/2018 | 4.3 |
| 13/04/2018 | 4.4 |
| 13/04/2018 | 4.5 |
| 13/04/2018 | 4.5 |
| 13/04/2018 | 4.5 |
| 13/04/2018 | 4.4 |
| 13/04/2018 | 4.3 |
| 13/04/2018 | 4.2 |
| 13/04/2018 | 4.1 |
| 13/04/2018 | 4 |
| 13/04/2018 | 4.2 |
| 13/04/2018 | 4.2 |
| 13/04/2018 | 4.1 |
| 13/04/2018 | 3.7 |
| 13/04/2018 | 3.3 |
| 13/04/2018 | 3 |
| 14/04/2018 | 2.7 |
| 14/04/2018 | 2.6 |
| 14/04/2018 | 2.5 |
| 14/04/2018 | 2.4 |
| 14/04/2018 | 2.4 |
| 14/04/2018 | 2.5 |
| 14/04/2018 | 2.6 |
| 14/04/2018 | 2.8 |
| 14/04/2018 | 3.2 |
| 14/04/2018 | 3.5 |
| 14/04/2018 | 3.7 |
| 14/04/2018 | 3.8 |
| 14/04/2018 | 3.8 |
| 14/04/2018 | 3.7 |
| 14/04/2018 | 3.5 |
| 14/04/2018 | 3.5 |
| 14/04/2018 | 3.4 |
| 14/04/2018 | 3.4 |
| 14/04/2018 | 3.6 |
| 14/04/2018 | 3.7 |
| 14/04/2018 | 3.7 |
| 14/04/2018 | 3.4 |
| 14/04/2018 | 3.1 |
| 14/04/2018 | 2.8 |
| 15/04/2018 | 2.6 |
| 15/04/2018 | 2.5 |
| 15/04/2018 | 2.4 |
| 15/04/2018 | 2.3 |
| 15/04/2018 | 2.3 |
| 15/04/2018 | 2.3 |
| 15/04/2018 | 2.4 |
| 15/04/2018 | 2.5 |
| 15/04/2018 | 2.7 |
| 15/04/2018 | 3 |
| 15/04/2018 | 3.2 |
| 15/04/2018 | 3.3 |
| 15/04/2018 | 3.4 |
| 15/04/2018 | 3.3 |
| 15/04/2018 | 3.2 |
| 15/04/2018 | 3.1 |
| 15/04/2018 | 3.1 |
| 15/04/2018 | 3.1 |
| 15/04/2018 | 3.4 |
| 15/04/2018 | 3.4 |
| 15/04/2018 | 3.5 |
| 15/04/2018 | 3.3 |
| 15/04/2018 | 3.1 |
| 15/04/2018 | 2.9 |
| 16/04/2018 | 2.6 |
| 16/04/2018 | 2.5 |
| 16/04/2018 | 2.4 |
| 16/04/2018 | 2.4 |
| 16/04/2018 | 2.5 |
| 16/04/2018 | 2.7 |
| 16/04/2018 | 3.3 |
| 16/04/2018 | 3.8 |
| 16/04/2018 | 4.2 |
| 16/04/2018 | 4.4 |
| 16/04/2018 | 4.5 |
| 16/04/2018 | 4.5 |
| 16/04/2018 | 4.5 |
| 16/04/2018 | 4.5 |
| 16/04/2018 | 4.4 |
| 16/04/2018 | 4.3 |
| 16/04/2018 | 4.2 |
| 16/04/2018 | 4.2 |
| 16/04/2018 | 4.3 |
| 16/04/2018 | 4.4 |
| 16/04/2018 | 4.2 |
| 16/04/2018 | 3.9 |
| 16/04/2018 | 3.4 |
| 16/04/2018 | 3 |
| 17/04/2018 | 2.7 |
| 17/04/2018 | 2.6 |
| 17/04/2018 | 2.5 |
| 17/04/2018 | 2.5 |
| 17/04/2018 | 2.6 |
| 17/04/2018 | 2.8 |
| 17/04/2018 | 3.3 |
| 17/04/2018 | 3.9 |
| 17/04/2018 | 4.3 |
| 17/04/2018 | 4.4 |
| 17/04/2018 | 4.5 |
| 17/04/2018 | 4.5 |
| 17/04/2018 | 4.5 |
| 17/04/2018 | 4.5 |
| 17/04/2018 | 4.4 |
| 17/04/2018 | 4.3 |
| 17/04/2018 | 4.2 |
| 17/04/2018 | 4.2 |
| 17/04/2018 | 4.4 |
| 17/04/2018 | 4.4 |
| 17/04/2018 | 4.3 |
| 17/04/2018 | 3.9 |
| 17/04/2018 | 3.4 |
| 17/04/2018 | 3 |
| 18/04/2018 | 2.8 |
| 18/04/2018 | 2.6 |
| 18/04/2018 | 2.5 |
| 18/04/2018 | 2.5 |
| 18/04/2018 | 2.6 |
| 18/04/2018 | 2.8 |
| 18/04/2018 | 3.3 |
| 18/04/2018 | 3.9 |
| 18/04/2018 | 4.3 |
| 18/04/2018 | 4.4 |
| 18/04/2018 | 4.5 |
| 18/04/2018 | 4.5 |
| 18/04/2018 | 4.5 |
| 18/04/2018 | 4.5 |
| 18/04/2018 | 4.4 |
| 18/04/2018 | 4.3 |
| 18/04/2018 | 4.2 |
| 18/04/2018 | 4.2 |
| 18/04/2018 | 4.3 |
| 18/04/2018 | 4.4 |
| 18/04/2018 | 4.2 |
| 18/04/2018 | 3.8 |
| 18/04/2018 | 3.4 |
| 18/04/2018 | 3 |
| 19/04/2018 | 2.8 |
| 19/04/2018 | 2.6 |
| 19/04/2018 | 2.5 |
| 19/04/2018 | 2.5 |
| 19/04/2018 | 2.6 |
| 19/04/2018 | 2.8 |
| 19/04/2018 | 3.3 |
| 19/04/2018 | 3.9 |
| 19/04/2018 | 4.2 |
| 19/04/2018 | 4.4 |
| 19/04/2018 | 4.5 |
| 19/04/2018 | 4.5 |
| 19/04/2018 | 4.5 |
| 19/04/2018 | 4.5 |
| 19/04/2018 | 4.4 |
| 19/04/2018 | 4.3 |
| 19/04/2018 | 4.2 |
| 19/04/2018 | 4.2 |
| 19/04/2018 | 4.4 |
| 19/04/2018 | 4.4 |
| 19/04/2018 | 4.2 |
| 19/04/2018 | 3.9 |
| 19/04/2018 | 3.4 |
| 19/04/2018 | 3.1 |
| 20/04/2018 | 2.8 |
| 20/04/2018 | 2.6 |
| 20/04/2018 | 2.5 |
| 20/04/2018 | 2.5 |
| 20/04/2018 | 2.6 |
| 20/04/2018 | 2.8 |
| 20/04/2018 | 3.3 |
| 20/04/2018 | 3.9 |
| 20/04/2018 | 4.2 |
| 20/04/2018 | 4.4 |
| 20/04/2018 | 4.5 |
| 20/04/2018 | 4.5 |
| 20/04/2018 | 4.5 |
| 20/04/2018 | 4.4 |
| 20/04/2018 | 4.3 |
| 20/04/2018 | 4.2 |
| 20/04/2018 | 4.1 |
| 20/04/2018 | 4 |
| 20/04/2018 | 4.2 |
| 20/04/2018 | 4.2 |
| 20/04/2018 | 4 |
| 20/04/2018 | 3.7 |
| 20/04/2018 | 3.3 |
| 20/04/2018 | 3 |
| 21/04/2018 | 2.7 |
| 21/04/2018 | 2.5 |
| 21/04/2018 | 2.5 |
| 21/04/2018 | 2.4 |
| 21/04/2018 | 2.4 |
| 21/04/2018 | 2.5 |
| 21/04/2018 | 2.6 |
| 21/04/2018 | 2.8 |
| 21/04/2018 | 3.1 |
| 21/04/2018 | 3.5 |
| 21/04/2018 | 3.7 |
| 21/04/2018 | 3.8 |
| 21/04/2018 | 3.8 |
| 21/04/2018 | 3.7 |
| 21/04/2018 | 3.5 |
| 21/04/2018 | 3.5 |
| 21/04/2018 | 3.4 |
| 21/04/2018 | 3.4 |
| 21/04/2018 | 3.6 |
| 21/04/2018 | 3.7 |
| 21/04/2018 | 3.6 |
| 21/04/2018 | 3.4 |
| 21/04/2018 | 3.1 |
| 21/04/2018 | 2.8 |
| 22/04/2018 | 2.6 |
| 22/04/2018 | 2.5 |
| 22/04/2018 | 2.4 |
| 22/04/2018 | 2.3 |
| 22/04/2018 | 2.3 |
| 22/04/2018 | 2.3 |
| 22/04/2018 | 2.4 |
| 22/04/2018 | 2.5 |
| 22/04/2018 | 2.7 |
| 22/04/2018 | 3 |
| 22/04/2018 | 3.2 |
| 22/04/2018 | 3.3 |
| 22/04/2018 | 3.4 |
| 22/04/2018 | 3.3 |
| 22/04/2018 | 3.2 |
| 22/04/2018 | 3.1 |
| 22/04/2018 | 3.1 |
| 22/04/2018 | 3.2 |
| 22/04/2018 | 3.3 |
| 22/04/2018 | 3.4 |
| 22/04/2018 | 3.4 |
| 22/04/2018 | 3.3 |
| 22/04/2018 | 3.1 |
| 22/04/2018 | 2.8 |
| 23/04/2018 | 2.6 |
| 23/04/2018 | 2.4 |
| 23/04/2018 | 2.4 |
| 23/04/2018 | 2.4 |
| 23/04/2018 | 2.5 |
| 23/04/2018 | 2.7 |
| 23/04/2018 | 3.3 |
| 23/04/2018 | 3.8 |
| 23/04/2018 | 4.2 |
| 23/04/2018 | 4.4 |
| 23/04/2018 | 4.5 |
| 23/04/2018 | 4.5 |
| 23/04/2018 | 4.5 |
| 23/04/2018 | 4.5 |
| 23/04/2018 | 4.4 |
| 23/04/2018 | 4.3 |
| 23/04/2018 | 4.2 |
| 23/04/2018 | 4.2 |
| 23/04/2018 | 4.3 |
| 23/04/2018 | 4.4 |
| 23/04/2018 | 4.2 |
| 23/04/2018 | 3.8 |
| 23/04/2018 | 3.4 |
| 23/04/2018 | 3 |
| 24/04/2018 | 2.7 |
| 24/04/2018 | 2.5 |
| 24/04/2018 | 2.5 |
| 24/04/2018 | 2.5 |
| 24/04/2018 | 2.6 |
| 24/04/2018 | 2.8 |
| 24/04/2018 | 3.3 |
| 24/04/2018 | 3.9 |
| 24/04/2018 | 4.2 |
| 24/04/2018 | 4.4 |
| 24/04/2018 | 4.5 |
| 24/04/2018 | 4.5 |
| 24/04/2018 | 4.5 |
| 24/04/2018 | 4.5 |
| 24/04/2018 | 4.4 |
| 24/04/2018 | 4.3 |
| 24/04/2018 | 4.2 |
| 24/04/2018 | 4.2 |
| 24/04/2018 | 4.4 |
| 24/04/2018 | 4.4 |
| 24/04/2018 | 4.2 |
| 24/04/2018 | 3.8 |
| 24/04/2018 | 3.4 |
| 24/04/2018 | 3 |
| 25/04/2018 | 2.8 |
| 25/04/2018 | 2.6 |
| 25/04/2018 | 2.5 |
| 25/04/2018 | 2.5 |
| 25/04/2018 | 2.6 |
| 25/04/2018 | 2.8 |
| 25/04/2018 | 3.3 |
| 25/04/2018 | 3.9 |
| 25/04/2018 | 4.2 |
| 25/04/2018 | 4.4 |
| 25/04/2018 | 4.5 |
| 25/04/2018 | 4.5 |
| 25/04/2018 | 4.5 |
| 25/04/2018 | 4.5 |
| 25/04/2018 | 4.4 |
| 25/04/2018 | 4.3 |
| 25/04/2018 | 4.2 |
| 25/04/2018 | 4.2 |
| 25/04/2018 | 4.3 |
| 25/04/2018 | 4.4 |
| 25/04/2018 | 4.2 |
| 25/04/2018 | 3.8 |
| 25/04/2018 | 3.4 |
| 25/04/2018 | 3 |
| 26/04/2018 | 2.8 |
| 26/04/2018 | 2.6 |
| 26/04/2018 | 2.5 |
| 26/04/2018 | 2.5 |
| 26/04/2018 | 2.6 |
| 26/04/2018 | 2.8 |
| 26/04/2018 | 3.3 |
| 26/04/2018 | 3.9 |
| 26/04/2018 | 4.2 |
| 26/04/2018 | 4.4 |
| 26/04/2018 | 4.5 |
| 26/04/2018 | 4.5 |
| 26/04/2018 | 4.5 |
| 26/04/2018 | 4.5 |
| 26/04/2018 | 4.4 |
| 26/04/2018 | 4.3 |
| 26/04/2018 | 4.2 |
| 26/04/2018 | 4.2 |
| 26/04/2018 | 4.3 |
| 26/04/2018 | 4.4 |
| 26/04/2018 | 4.2 |
| 26/04/2018 | 3.8 |
| 26/04/2018 | 3.4 |
| 26/04/2018 | 3.1 |
| 27/04/2018 | 2.8 |
| 27/04/2018 | 2.6 |
| 27/04/2018 | 2.5 |
| 27/04/2018 | 2.5 |
| 27/04/2018 | 2.6 |
| 27/04/2018 | 2.8 |
| 27/04/2018 | 3.3 |
| 27/04/2018 | 3.8 |
| 27/04/2018 | 4.2 |
| 27/04/2018 | 4.4 |
| 27/04/2018 | 4.5 |
| 27/04/2018 | 4.5 |
| 27/04/2018 | 4.5 |
| 27/04/2018 | 4.4 |
| 27/04/2018 | 4.3 |
| 27/04/2018 | 4.2 |
| 27/04/2018 | 4.1 |
| 27/04/2018 | 4.1 |
| 27/04/2018 | 4.1 |
| 27/04/2018 | 4.2 |
| 27/04/2018 | 4 |
| 27/04/2018 | 3.7 |
| 27/04/2018 | 3.3 |
| 27/04/2018 | 3 |
| 28/04/2018 | 2.7 |
| 28/04/2018 | 2.5 |
| 28/04/2018 | 2.5 |
| 28/04/2018 | 2.4 |
| 28/04/2018 | 2.4 |
| 28/04/2018 | 2.5 |
| 28/04/2018 | 2.6 |
| 28/04/2018 | 2.8 |
| 28/04/2018 | 3.1 |
| 28/04/2018 | 3.5 |
| 28/04/2018 | 3.7 |
| 28/04/2018 | 3.8 |
| 28/04/2018 | 3.8 |
| 28/04/2018 | 3.6 |
| 28/04/2018 | 3.5 |
| 28/04/2018 | 3.5 |
| 28/04/2018 | 3.4 |
| 28/04/2018 | 3.4 |
| 28/04/2018 | 3.6 |
| 28/04/2018 | 3.6 |
| 28/04/2018 | 3.6 |
| 28/04/2018 | 3.4 |
| 28/04/2018 | 3.1 |
| 28/04/2018 | 2.8 |
| 29/04/2018 | 2.6 |
| 29/04/2018 | 2.4 |
| 29/04/2018 | 2.4 |
| 29/04/2018 | 2.3 |
| 29/04/2018 | 2.3 |
| 29/04/2018 | 2.3 |
| 29/04/2018 | 2.4 |
| 29/04/2018 | 2.5 |
| 29/04/2018 | 2.7 |
| 29/04/2018 | 3 |
| 29/04/2018 | 3.2 |
| 29/04/2018 | 3.3 |
| 29/04/2018 | 3.4 |
| 29/04/2018 | 3.3 |
| 29/04/2018 | 3.2 |
| 29/04/2018 | 3.1 |
| 29/04/2018 | 3.1 |
| 29/04/2018 | 3.2 |
| 29/04/2018 | 3.3 |
| 29/04/2018 | 3.4 |
| 29/04/2018 | 3.4 |
| 29/04/2018 | 3.3 |
| 29/04/2018 | 3.1 |
| 29/04/2018 | 2.8 |
| 30/04/2018 | 2.5 |
| 30/04/2018 | 2.3 |
| 30/04/2018 | 2.3 |
| 30/04/2018 | 2.2 |
| 30/04/2018 | 2.3 |
| 30/04/2018 | 2.5 |
| 30/04/2018 | 2.7 |
| 30/04/2018 | 2.9 |
| 30/04/2018 | 3.2 |
| 30/04/2018 | 3.5 |
| 30/04/2018 | 3.7 |
| 30/04/2018 | 3.7 |
| 30/04/2018 | 3.7 |
| 30/04/2018 | 3.6 |
| 30/04/2018 | 3.5 |
| 30/04/2018 | 3.4 |
| 30/04/2018 | 3.3 |
| 30/04/2018 | 3.4 |
| 30/04/2018 | 3.6 |
| 30/04/2018 | 3.7 |
| 30/04/2018 | 3.6 |
| 30/04/2018 | 3.4 |
| 30/04/2018 | 3.1 |
| 30/04/2018 | 2.8 |
| 01/05/2018 | 2.7 |
| 01/05/2018 | 2.5 |
| 01/05/2018 | 2.4 |
| 01/05/2018 | 2.4 |
| 01/05/2018 | 2.4 |
| 01/05/2018 | 2.4 |
| 01/05/2018 | 2.4 |
| 01/05/2018 | 2.6 |
| 01/05/2018 | 2.9 |
| 01/05/2018 | 3.1 |
| 01/05/2018 | 3.3 |
| 01/05/2018 | 3.4 |
| 01/05/2018 | 3.5 |
| 01/05/2018 | 3.3 |
| 01/05/2018 | 3.2 |
| 01/05/2018 | 3.1 |
| 01/05/2018 | 3.1 |
| 01/05/2018 | 3.1 |
| 01/05/2018 | 3.2 |
| 01/05/2018 | 3.3 |
| 01/05/2018 | 3.2 |
| 01/05/2018 | 3.2 |
| 01/05/2018 | 3 |
| 01/05/2018 | 2.8 |
| 02/05/2018 | 2.7 |
| 02/05/2018 | 2.6 |
| 02/05/2018 | 2.5 |
| 02/05/2018 | 2.5 |
| 02/05/2018 | 2.6 |
| 02/05/2018 | 2.8 |
| 02/05/2018 | 3.3 |
| 02/05/2018 | 3.8 |
| 02/05/2018 | 4.2 |
| 02/05/2018 | 4.4 |
| 02/05/2018 | 4.5 |
| 02/05/2018 | 4.5 |
| 02/05/2018 | 4.5 |
| 02/05/2018 | 4.5 |
| 02/05/2018 | 4.4 |
| 02/05/2018 | 4.3 |
| 02/05/2018 | 4.2 |
| 02/05/2018 | 4.2 |
| 02/05/2018 | 4.3 |
| 02/05/2018 | 4.3 |
| 02/05/2018 | 4.1 |
| 02/05/2018 | 3.8 |
| 02/05/2018 | 3.4 |
| 02/05/2018 | 3 |
| 03/05/2018 | 2.8 |
| 03/05/2018 | 2.6 |
| 03/05/2018 | 2.5 |
| 03/05/2018 | 2.5 |
| 03/05/2018 | 2.6 |
| 03/05/2018 | 2.8 |
| 03/05/2018 | 3.3 |
| 03/05/2018 | 3.9 |
| 03/05/2018 | 4.2 |
| 03/05/2018 | 4.4 |
| 03/05/2018 | 4.5 |
| 03/05/2018 | 4.5 |
| 03/05/2018 | 4.5 |
| 03/05/2018 | 4.4 |
| 03/05/2018 | 4.4 |
| 03/05/2018 | 4.3 |
| 03/05/2018 | 4.2 |
| 03/05/2018 | 4.2 |
| 03/05/2018 | 4.3 |
| 03/05/2018 | 4.3 |
| 03/05/2018 | 4.2 |
| 03/05/2018 | 3.8 |
| 03/05/2018 | 3.4 |
| 03/05/2018 | 3 |
| 04/05/2018 | 2.8 |
| 04/05/2018 | 2.6 |
| 04/05/2018 | 2.5 |
| 04/05/2018 | 2.5 |
| 04/05/2018 | 2.6 |
| 04/05/2018 | 2.8 |
| 04/05/2018 | 3.3 |
| 04/05/2018 | 3.8 |
| 04/05/2018 | 4.2 |
| 04/05/2018 | 4.4 |
| 04/05/2018 | 4.5 |
| 04/05/2018 | 4.5 |
| 04/05/2018 | 4.5 |
| 04/05/2018 | 4.4 |
| 04/05/2018 | 4.3 |
| 04/05/2018 | 4.2 |
| 04/05/2018 | 4.1 |
| 04/05/2018 | 4.1 |
| 04/05/2018 | 4.1 |
| 04/05/2018 | 4.1 |
| 04/05/2018 | 3.9 |
| 04/05/2018 | 3.6 |
| 04/05/2018 | 3.3 |
| 04/05/2018 | 3 |
| 05/05/2018 | 2.7 |
| 05/05/2018 | 2.5 |
| 05/05/2018 | 2.4 |
| 05/05/2018 | 2.4 |
| 05/05/2018 | 2.4 |
| 05/05/2018 | 2.4 |
| 05/05/2018 | 2.5 |
| 05/05/2018 | 2.8 |
| 05/05/2018 | 3.1 |
| 05/05/2018 | 3.5 |
| 05/05/2018 | 3.7 |
| 05/05/2018 | 3.8 |
| 05/05/2018 | 3.8 |
| 05/05/2018 | 3.6 |
| 05/05/2018 | 3.5 |
| 05/05/2018 | 3.5 |
| 05/05/2018 | 3.4 |
| 05/05/2018 | 3.4 |
| 05/05/2018 | 3.5 |
| 05/05/2018 | 3.6 |
| 05/05/2018 | 3.5 |
| 05/05/2018 | 3.3 |
| 05/05/2018 | 3.1 |
| 05/05/2018 | 2.8 |
| 06/05/2018 | 2.6 |
| 06/05/2018 | 2.4 |
| 06/05/2018 | 2.4 |
| 06/05/2018 | 2.3 |
| 06/05/2018 | 2.3 |
| 06/05/2018 | 2.3 |
| 06/05/2018 | 2.3 |
| 06/05/2018 | 2.5 |
| 06/05/2018 | 2.7 |
| 06/05/2018 | 3 |
| 06/05/2018 | 3.2 |
| 06/05/2018 | 3.3 |
| 06/05/2018 | 3.4 |
| 06/05/2018 | 3.3 |
| 06/05/2018 | 3.2 |
| 06/05/2018 | 3.1 |
| 06/05/2018 | 3.1 |
| 06/05/2018 | 3.2 |
| 06/05/2018 | 3.3 |
| 06/05/2018 | 3.4 |
| 06/05/2018 | 3.4 |
| 06/05/2018 | 3.3 |
| 06/05/2018 | 3.1 |
| 06/05/2018 | 2.8 |
| 07/05/2018 | 2.6 |
| 07/05/2018 | 2.4 |
| 07/05/2018 | 2.4 |
| 07/05/2018 | 2.4 |
| 07/05/2018 | 2.5 |
| 07/05/2018 | 2.7 |
| 07/05/2018 | 3.2 |
| 07/05/2018 | 3.8 |
| 07/05/2018 | 4.1 |
| 07/05/2018 | 4.3 |
| 07/05/2018 | 4.4 |
| 07/05/2018 | 4.5 |
| 07/05/2018 | 4.5 |
| 07/05/2018 | 4.5 |
| 07/05/2018 | 4.4 |
| 07/05/2018 | 4.3 |
| 07/05/2018 | 4.2 |
| 07/05/2018 | 4.2 |
| 07/05/2018 | 4.3 |
| 07/05/2018 | 4.3 |
| 07/05/2018 | 4.1 |
| 07/05/2018 | 3.8 |
| 07/05/2018 | 3.4 |
| 07/05/2018 | 3 |
| 08/05/2018 | 2.7 |
| 08/05/2018 | 2.5 |
| 08/05/2018 | 2.5 |
| 08/05/2018 | 2.4 |
| 08/05/2018 | 2.5 |
| 08/05/2018 | 2.8 |
| 08/05/2018 | 3.3 |
| 08/05/2018 | 3.8 |
| 08/05/2018 | 4.2 |
| 08/05/2018 | 4.4 |
| 08/05/2018 | 4.5 |
| 08/05/2018 | 4.5 |
| 08/05/2018 | 4.5 |
| 08/05/2018 | 4.5 |
| 08/05/2018 | 4.4 |
| 08/05/2018 | 4.3 |
| 08/05/2018 | 4.2 |
| 08/05/2018 | 4.2 |
| 08/05/2018 | 4.3 |
| 08/05/2018 | 4.3 |
| 08/05/2018 | 4.1 |
| 08/05/2018 | 3.8 |
| 08/05/2018 | 3.4 |
| 08/05/2018 | 3 |
| 09/05/2018 | 2.7 |
| 09/05/2018 | 2.5 |
| 09/05/2018 | 2.5 |
| 09/05/2018 | 2.4 |
| 09/05/2018 | 2.5 |
| 09/05/2018 | 2.8 |
| 09/05/2018 | 3.3 |
| 09/05/2018 | 3.8 |
| 09/05/2018 | 4.2 |
| 09/05/2018 | 4.4 |
| 09/05/2018 | 4.5 |
| 09/05/2018 | 4.5 |
| 09/05/2018 | 4.5 |
| 09/05/2018 | 4.5 |
| 09/05/2018 | 4.4 |
| 09/05/2018 | 4.3 |
| 09/05/2018 | 4.2 |
| 09/05/2018 | 4.2 |
| 09/05/2018 | 4.3 |
| 09/05/2018 | 4.3 |
| 09/05/2018 | 4.1 |
| 09/05/2018 | 3.8 |
| 09/05/2018 | 3.4 |
| 09/05/2018 | 3 |
| 10/05/2018 | 2.7 |
| 10/05/2018 | 2.5 |
| 10/05/2018 | 2.4 |
| 10/05/2018 | 2.4 |
| 10/05/2018 | 2.4 |
| 10/05/2018 | 2.4 |
| 10/05/2018 | 2.4 |
| 10/05/2018 | 2.6 |
| 10/05/2018 | 2.9 |
| 10/05/2018 | 3.1 |
| 10/05/2018 | 3.3 |
| 10/05/2018 | 3.4 |
| 10/05/2018 | 3.4 |
| 10/05/2018 | 3.3 |
| 10/05/2018 | 3.2 |
| 10/05/2018 | 3.1 |
| 10/05/2018 | 3.1 |
| 10/05/2018 | 3.1 |
| 10/05/2018 | 3.2 |
| 10/05/2018 | 3.2 |
| 10/05/2018 | 3.2 |
| 10/05/2018 | 3.2 |
| 10/05/2018 | 3 |
| 10/05/2018 | 2.8 |
| 11/05/2018 | 2.5 |
| 11/05/2018 | 2.3 |
| 11/05/2018 | 2.3 |
| 11/05/2018 | 2.2 |
| 11/05/2018 | 2.3 |
| 11/05/2018 | 2.4 |
| 11/05/2018 | 2.6 |
| 11/05/2018 | 2.9 |
| 11/05/2018 | 3.2 |
| 11/05/2018 | 3.5 |
| 11/05/2018 | 3.7 |
| 11/05/2018 | 3.7 |
| 11/05/2018 | 3.7 |
| 11/05/2018 | 3.6 |
| 11/05/2018 | 3.5 |
| 11/05/2018 | 3.4 |
| 11/05/2018 | 3.3 |
| 11/05/2018 | 3.4 |
| 11/05/2018 | 3.5 |
| 11/05/2018 | 3.6 |
| 11/05/2018 | 3.5 |
| 11/05/2018 | 3.3 |
| 11/05/2018 | 3.1 |
| 11/05/2018 | 2.8 |
| 12/05/2018 | 2.7 |
| 12/05/2018 | 2.5 |
| 12/05/2018 | 2.4 |
| 12/05/2018 | 2.4 |
| 12/05/2018 | 2.4 |
| 12/05/2018 | 2.4 |
| 12/05/2018 | 2.5 |
| 12/05/2018 | 2.7 |
| 12/05/2018 | 3.1 |
| 12/05/2018 | 3.4 |
| 12/05/2018 | 3.7 |
| 12/05/2018 | 3.8 |
| 12/05/2018 | 3.7 |
| 12/05/2018 | 3.6 |
| 12/05/2018 | 3.5 |
| 12/05/2018 | 3.5 |
| 12/05/2018 | 3.4 |
| 12/05/2018 | 3.4 |
| 12/05/2018 | 3.5 |
| 12/05/2018 | 3.6 |
| 12/05/2018 | 3.5 |
| 12/05/2018 | 3.3 |
| 12/05/2018 | 3.1 |
| 12/05/2018 | 2.8 |
| 13/05/2018 | 2.6 |
| 13/05/2018 | 2.4 |
| 13/05/2018 | 2.4 |
| 13/05/2018 | 2.3 |
| 13/05/2018 | 2.3 |
| 13/05/2018 | 2.3 |
| 13/05/2018 | 2.3 |
| 13/05/2018 | 2.5 |
| 13/05/2018 | 2.7 |
| 13/05/2018 | 3 |
| 13/05/2018 | 3.1 |
| 13/05/2018 | 3.3 |
| 13/05/2018 | 3.4 |
| 13/05/2018 | 3.3 |
| 13/05/2018 | 3.2 |
| 13/05/2018 | 3.1 |
| 13/05/2018 | 3.1 |
| 13/05/2018 | 3.2 |
| 13/05/2018 | 3.3 |
| 13/05/2018 | 3.3 |
| 13/05/2018 | 3.3 |
| 13/05/2018 | 3.2 |
| 13/05/2018 | 3.1 |
| 13/05/2018 | 2.8 |
| 14/05/2018 | 2.6 |
| 14/05/2018 | 2.4 |
| 14/05/2018 | 2.4 |
| 14/05/2018 | 2.4 |
| 14/05/2018 | 2.5 |
| 14/05/2018 | 2.7 |
| 14/05/2018 | 3.2 |
| 14/05/2018 | 3.7 |
| 14/05/2018 | 4.1 |
| 14/05/2018 | 4.3 |
| 14/05/2018 | 4.4 |
| 14/05/2018 | 4.5 |
| 14/05/2018 | 4.5 |
| 14/05/2018 | 4.5 |
| 14/05/2018 | 4.4 |
| 14/05/2018 | 4.3 |
| 14/05/2018 | 4.2 |
| 14/05/2018 | 4.2 |
| 14/05/2018 | 4.3 |
| 14/05/2018 | 4.3 |
| 14/05/2018 | 4.1 |
| 14/05/2018 | 3.8 |
| 14/05/2018 | 3.4 |
| 14/05/2018 | 3 |
| 15/05/2018 | 2.7 |
| 15/05/2018 | 2.5 |
| 15/05/2018 | 2.4 |
| 15/05/2018 | 2.4 |
| 15/05/2018 | 2.5 |
| 15/05/2018 | 2.8 |
| 15/05/2018 | 3.3 |
| 15/05/2018 | 3.8 |
| 15/05/2018 | 4.2 |
| 15/05/2018 | 4.4 |
| 15/05/2018 | 4.5 |
| 15/05/2018 | 4.5 |
| 15/05/2018 | 4.5 |
| 15/05/2018 | 4.5 |
| 15/05/2018 | 4.4 |
| 15/05/2018 | 4.3 |
| 15/05/2018 | 4.2 |
| 15/05/2018 | 4.2 |
| 15/05/2018 | 4.3 |
| 15/05/2018 | 4.3 |
| 15/05/2018 | 4.1 |
| 15/05/2018 | 3.8 |
| 15/05/2018 | 3.4 |
| 15/05/2018 | 3 |
| 16/05/2018 | 2.7 |
| 16/05/2018 | 2.5 |
| 16/05/2018 | 2.5 |
| 16/05/2018 | 2.4 |
| 16/05/2018 | 2.5 |
| 16/05/2018 | 2.8 |
| 16/05/2018 | 3.3 |
| 16/05/2018 | 3.8 |
| 16/05/2018 | 4.2 |
| 16/05/2018 | 4.4 |
| 16/05/2018 | 4.5 |
| 16/05/2018 | 4.5 |
| 16/05/2018 | 4.5 |
| 16/05/2018 | 4.5 |
| 16/05/2018 | 4.4 |
| 16/05/2018 | 4.3 |
| 16/05/2018 | 4.2 |
| 16/05/2018 | 4.2 |
| 16/05/2018 | 4.3 |
| 16/05/2018 | 4.3 |
| 16/05/2018 | 4.1 |
| 16/05/2018 | 3.8 |
| 16/05/2018 | 3.4 |
| 16/05/2018 | 3 |
| 17/05/2018 | 2.7 |
| 17/05/2018 | 2.5 |
| 17/05/2018 | 2.5 |
| 17/05/2018 | 2.4 |
| 17/05/2018 | 2.5 |
| 17/05/2018 | 2.8 |
| 17/05/2018 | 3.3 |
| 17/05/2018 | 3.8 |
| 17/05/2018 | 4.2 |
| 17/05/2018 | 4.3 |
| 17/05/2018 | 4.5 |
| 17/05/2018 | 4.5 |
| 17/05/2018 | 4.5 |
| 17/05/2018 | 4.4 |
| 17/05/2018 | 4.4 |
| 17/05/2018 | 4.3 |
| 17/05/2018 | 4.2 |
| 17/05/2018 | 4.2 |
| 17/05/2018 | 4.3 |
| 17/05/2018 | 4.3 |
| 17/05/2018 | 4.1 |
| 17/05/2018 | 3.8 |
| 17/05/2018 | 3.4 |
| 17/05/2018 | 3 |
| 18/05/2018 | 2.8 |
| 18/05/2018 | 2.6 |
| 18/05/2018 | 2.5 |
| 18/05/2018 | 2.4 |
| 18/05/2018 | 2.5 |
| 18/05/2018 | 2.8 |
| 18/05/2018 | 3.3 |
| 18/05/2018 | 3.8 |
| 18/05/2018 | 4.2 |
| 18/05/2018 | 4.3 |
| 18/05/2018 | 4.5 |
| 18/05/2018 | 4.5 |
| 18/05/2018 | 4.5 |
| 18/05/2018 | 4.4 |
| 18/05/2018 | 4.3 |
| 18/05/2018 | 4.2 |
| 18/05/2018 | 4.1 |
| 18/05/2018 | 4.1 |
| 18/05/2018 | 4.1 |
| 18/05/2018 | 4.1 |
| 18/05/2018 | 3.9 |
| 18/05/2018 | 3.6 |
| 18/05/2018 | 3.3 |
| 18/05/2018 | 3 |
| 19/05/2018 | 2.7 |
| 19/05/2018 | 2.5 |
| 19/05/2018 | 2.4 |
| 19/05/2018 | 2.4 |
| 19/05/2018 | 2.4 |
| 19/05/2018 | 2.4 |
| 19/05/2018 | 2.5 |
| 19/05/2018 | 2.7 |
| 19/05/2018 | 3.1 |
| 19/05/2018 | 3.4 |
| 19/05/2018 | 3.7 |
| 19/05/2018 | 3.7 |
| 19/05/2018 | 3.7 |
| 19/05/2018 | 3.6 |
| 19/05/2018 | 3.5 |
| 19/05/2018 | 3.5 |
| 19/05/2018 | 3.4 |
| 19/05/2018 | 3.4 |
| 19/05/2018 | 3.5 |
| 19/05/2018 | 3.6 |
| 19/05/2018 | 3.5 |
| 19/05/2018 | 3.3 |
| 19/05/2018 | 3.1 |
| 19/05/2018 | 2.8 |
| 20/05/2018 | 2.5 |
| 20/05/2018 | 2.4 |
| 20/05/2018 | 2.3 |
| 20/05/2018 | 2.3 |
| 20/05/2018 | 2.3 |
| 20/05/2018 | 2.2 |
| 20/05/2018 | 2.3 |
| 20/05/2018 | 2.5 |
| 20/05/2018 | 2.7 |
| 20/05/2018 | 3 |
| 20/05/2018 | 3.1 |
| 20/05/2018 | 3.2 |
| 20/05/2018 | 3.2 |
| 20/05/2018 | 3.1 |
| 20/05/2018 | 3 |
| 20/05/2018 | 3 |
| 20/05/2018 | 2.9 |
| 20/05/2018 | 3 |
| 20/05/2018 | 3.1 |
| 20/05/2018 | 3.1 |
| 20/05/2018 | 3.1 |
| 20/05/2018 | 3.1 |
| 20/05/2018 | 3 |
| 20/05/2018 | 2.7 |
| 21/05/2018 | 2.5 |
| 21/05/2018 | 2.4 |
| 21/05/2018 | 2.3 |
| 21/05/2018 | 2.3 |
| 21/05/2018 | 2.3 |
| 21/05/2018 | 2.2 |
| 21/05/2018 | 2.3 |
| 21/05/2018 | 2.5 |
| 21/05/2018 | 2.7 |
| 21/05/2018 | 3 |
| 21/05/2018 | 3.1 |
| 21/05/2018 | 3.2 |
| 21/05/2018 | 3.2 |
| 21/05/2018 | 3.1 |
| 21/05/2018 | 3 |
| 21/05/2018 | 3 |
| 21/05/2018 | 2.9 |
| 21/05/2018 | 3 |
| 21/05/2018 | 3.1 |
| 21/05/2018 | 3.1 |
| 21/05/2018 | 3.1 |
| 21/05/2018 | 3.1 |
| 21/05/2018 | 3 |
| 21/05/2018 | 2.7 |
| 22/05/2018 | 2.7 |
| 22/05/2018 | 2.5 |
| 22/05/2018 | 2.5 |
| 22/05/2018 | 2.4 |
| 22/05/2018 | 2.5 |
| 22/05/2018 | 2.7 |
| 22/05/2018 | 3.2 |
| 22/05/2018 | 3.6 |
| 22/05/2018 | 4 |
| 22/05/2018 | 4.2 |
| 22/05/2018 | 4.4 |
| 22/05/2018 | 4.4 |
| 22/05/2018 | 4.5 |
| 22/05/2018 | 4.4 |
| 22/05/2018 | 4.3 |
| 22/05/2018 | 4.2 |
| 22/05/2018 | 4.2 |
| 22/05/2018 | 4.2 |
| 22/05/2018 | 4.2 |
| 22/05/2018 | 4.1 |
| 22/05/2018 | 3.9 |
| 22/05/2018 | 3.7 |
| 22/05/2018 | 3.4 |
| 22/05/2018 | 3 |
| 23/05/2018 | 2.7 |
| 23/05/2018 | 2.5 |
| 23/05/2018 | 2.4 |
| 23/05/2018 | 2.4 |
| 23/05/2018 | 2.5 |
| 23/05/2018 | 2.7 |
| 23/05/2018 | 3.3 |
| 23/05/2018 | 3.8 |
| 23/05/2018 | 4.2 |
| 23/05/2018 | 4.3 |
| 23/05/2018 | 4.5 |
| 23/05/2018 | 4.5 |
| 23/05/2018 | 4.5 |
| 23/05/2018 | 4.4 |
| 23/05/2018 | 4.4 |
| 23/05/2018 | 4.3 |
| 23/05/2018 | 4.2 |
| 23/05/2018 | 4.2 |
| 23/05/2018 | 4.3 |
| 23/05/2018 | 4.2 |
| 23/05/2018 | 4 |
| 23/05/2018 | 3.7 |
| 23/05/2018 | 3.4 |
| 23/05/2018 | 3 |
| 24/05/2018 | 2.7 |
| 24/05/2018 | 2.5 |
| 24/05/2018 | 2.5 |
| 24/05/2018 | 2.4 |
| 24/05/2018 | 2.5 |
| 24/05/2018 | 2.8 |
| 24/05/2018 | 3.3 |
| 24/05/2018 | 3.8 |
| 24/05/2018 | 4.1 |
| 24/05/2018 | 4.3 |
| 24/05/2018 | 4.4 |
| 24/05/2018 | 4.5 |
| 24/05/2018 | 4.5 |
| 24/05/2018 | 4.4 |
| 24/05/2018 | 4.4 |
| 24/05/2018 | 4.3 |
| 24/05/2018 | 4.2 |
| 24/05/2018 | 4.2 |
| 24/05/2018 | 4.3 |
| 24/05/2018 | 4.2 |
| 24/05/2018 | 4 |
| 24/05/2018 | 3.7 |
| 24/05/2018 | 3.4 |
| 24/05/2018 | 3 |
| 25/05/2018 | 2.7 |
| 25/05/2018 | 2.5 |
| 25/05/2018 | 2.5 |
| 25/05/2018 | 2.4 |
| 25/05/2018 | 2.5 |
| 25/05/2018 | 2.7 |
| 25/05/2018 | 3.2 |
| 25/05/2018 | 3.8 |
| 25/05/2018 | 4.1 |
| 25/05/2018 | 4.3 |
| 25/05/2018 | 4.5 |
| 25/05/2018 | 4.5 |
| 25/05/2018 | 4.5 |
| 25/05/2018 | 4.4 |
| 25/05/2018 | 4.3 |
| 25/05/2018 | 4.2 |
| 25/05/2018 | 4.1 |
| 25/05/2018 | 4.1 |
| 25/05/2018 | 4.1 |
| 25/05/2018 | 4 |
| 25/05/2018 | 3.8 |
| 25/05/2018 | 3.6 |
| 25/05/2018 | 3.3 |
| 25/05/2018 | 3 |
| 26/05/2018 | 2.7 |
| 26/05/2018 | 2.5 |
| 26/05/2018 | 2.4 |
| 26/05/2018 | 2.4 |
| 26/05/2018 | 2.4 |
| 26/05/2018 | 2.4 |
| 26/05/2018 | 2.5 |
| 26/05/2018 | 2.7 |
| 26/05/2018 | 3.1 |
| 26/05/2018 | 3.4 |
| 26/05/2018 | 3.7 |
| 26/05/2018 | 3.7 |
| 26/05/2018 | 3.7 |
| 26/05/2018 | 3.6 |
| 26/05/2018 | 3.5 |
| 26/05/2018 | 3.5 |
| 26/05/2018 | 3.4 |
| 26/05/2018 | 3.4 |
| 26/05/2018 | 3.5 |
| 26/05/2018 | 3.5 |
| 26/05/2018 | 3.4 |
| 26/05/2018 | 3.3 |
| 26/05/2018 | 3.1 |
| 26/05/2018 | 2.8 |
| 27/05/2018 | 2.6 |
| 27/05/2018 | 2.4 |
| 27/05/2018 | 2.4 |
| 27/05/2018 | 2.3 |
| 27/05/2018 | 2.3 |
| 27/05/2018 | 2.3 |
| 27/05/2018 | 2.3 |
| 27/05/2018 | 2.4 |
| 27/05/2018 | 2.7 |
| 27/05/2018 | 2.9 |
| 27/05/2018 | 3.1 |
| 27/05/2018 | 3.3 |
| 27/05/2018 | 3.3 |
| 27/05/2018 | 3.3 |
| 27/05/2018 | 3.2 |
| 27/05/2018 | 3.1 |
| 27/05/2018 | 3.1 |
| 27/05/2018 | 3.2 |
| 27/05/2018 | 3.3 |
| 27/05/2018 | 3.3 |
| 27/05/2018 | 3.3 |
| 27/05/2018 | 3.2 |
| 27/05/2018 | 3.1 |
| 27/05/2018 | 2.8 |
| 28/05/2018 | 2.6 |
| 28/05/2018 | 2.4 |
| 28/05/2018 | 2.4 |
| 28/05/2018 | 2.3 |
| 28/05/2018 | 2.4 |
| 28/05/2018 | 2.7 |
| 28/05/2018 | 3.2 |
| 28/05/2018 | 3.7 |
| 28/05/2018 | 4.1 |
| 28/05/2018 | 4.3 |
| 28/05/2018 | 4.4 |
| 28/05/2018 | 4.5 |
| 28/05/2018 | 4.5 |
| 28/05/2018 | 4.4 |
| 28/05/2018 | 4.4 |
| 28/05/2018 | 4.3 |
| 28/05/2018 | 4.2 |
| 28/05/2018 | 4.2 |
| 28/05/2018 | 4.2 |
| 28/05/2018 | 4.2 |
| 28/05/2018 | 4 |
| 28/05/2018 | 3.7 |
| 28/05/2018 | 3.4 |
| 28/05/2018 | 3 |
| 29/05/2018 | 2.7 |
| 29/05/2018 | 2.5 |
| 29/05/2018 | 2.4 |
| 29/05/2018 | 2.4 |
| 29/05/2018 | 2.5 |
| 29/05/2018 | 2.7 |
| 29/05/2018 | 3.2 |
| 29/05/2018 | 3.8 |
| 29/05/2018 | 4.1 |
| 29/05/2018 | 4.3 |
| 29/05/2018 | 4.4 |
| 29/05/2018 | 4.5 |
| 29/05/2018 | 4.5 |
| 29/05/2018 | 4.4 |
| 29/05/2018 | 4.4 |
| 29/05/2018 | 4.3 |
| 29/05/2018 | 4.3 |
| 29/05/2018 | 4.2 |
| 29/05/2018 | 4.3 |
| 29/05/2018 | 4.2 |
| 29/05/2018 | 4 |
| 29/05/2018 | 3.7 |
| 29/05/2018 | 3.4 |
| 29/05/2018 | 3 |
| 30/05/2018 | 2.7 |
| 30/05/2018 | 2.5 |
| 30/05/2018 | 2.4 |
| 30/05/2018 | 2.4 |
| 30/05/2018 | 2.5 |
| 30/05/2018 | 2.7 |
| 30/05/2018 | 3.2 |
| 30/05/2018 | 3.8 |
| 30/05/2018 | 4.1 |
| 30/05/2018 | 4.3 |
| 30/05/2018 | 4.5 |
| 30/05/2018 | 4.5 |
| 30/05/2018 | 4.5 |
| 30/05/2018 | 4.4 |
| 30/05/2018 | 4.4 |
| 30/05/2018 | 4.3 |
| 30/05/2018 | 4.2 |
| 30/05/2018 | 4.2 |
| 30/05/2018 | 4.2 |
| 30/05/2018 | 4.2 |
| 30/05/2018 | 4 |
| 30/05/2018 | 3.7 |
| 30/05/2018 | 3.4 |
| 30/05/2018 | 3 |
| 31/05/2018 | 2.7 |
| 31/05/2018 | 2.5 |
| 31/05/2018 | 2.4 |
| 31/05/2018 | 2.4 |
| 31/05/2018 | 2.5 |
| 31/05/2018 | 2.7 |
| 31/05/2018 | 3.2 |
| 31/05/2018 | 3.8 |
| 31/05/2018 | 4.1 |
| 31/05/2018 | 4.3 |
| 31/05/2018 | 4.4 |
| 31/05/2018 | 4.5 |
| 31/05/2018 | 4.5 |
| 31/05/2018 | 4.4 |
| 31/05/2018 | 4.4 |
| 31/05/2018 | 4.3 |
| 31/05/2018 | 4.2 |
| 31/05/2018 | 4.2 |
| 31/05/2018 | 4.3 |
| 31/05/2018 | 4.2 |
| 31/05/2018 | 4 |
| 31/05/2018 | 3.7 |
| 31/05/2018 | 3.4 |
| 31/05/2018 | 3 |
| 01/06/2018 | 2.7 |
| 01/06/2018 | 2.5 |
| 01/06/2018 | 2.5 |
| 01/06/2018 | 2.4 |
| 01/06/2018 | 2.5 |
| 01/06/2018 | 2.7 |
| 01/06/2018 | 3.2 |
| 01/06/2018 | 3.7 |
| 01/06/2018 | 4.1 |
| 01/06/2018 | 4.3 |
| 01/06/2018 | 4.4 |
| 01/06/2018 | 4.5 |
| 01/06/2018 | 4.5 |
| 01/06/2018 | 4.4 |
| 01/06/2018 | 4.3 |
| 01/06/2018 | 4.2 |
| 01/06/2018 | 4.1 |
| 01/06/2018 | 4.1 |
| 01/06/2018 | 4.1 |
| 01/06/2018 | 4 |
| 01/06/2018 | 3.8 |
| 01/06/2018 | 3.6 |
| 01/06/2018 | 3.3 |
| 01/06/2018 | 3 |
| 02/06/2018 | 2.7 |
| 02/06/2018 | 2.5 |
| 02/06/2018 | 2.4 |
| 02/06/2018 | 2.4 |
| 02/06/2018 | 2.4 |
| 02/06/2018 | 2.4 |
| 02/06/2018 | 2.5 |
| 02/06/2018 | 2.7 |
| 02/06/2018 | 3.1 |
| 02/06/2018 | 3.4 |
| 02/06/2018 | 3.6 |
| 02/06/2018 | 3.7 |
| 02/06/2018 | 3.7 |
| 02/06/2018 | 3.6 |
| 02/06/2018 | 3.5 |
| 02/06/2018 | 3.5 |
| 02/06/2018 | 3.4 |
| 02/06/2018 | 3.4 |
| 02/06/2018 | 3.5 |
| 02/06/2018 | 3.5 |
| 02/06/2018 | 3.4 |
| 02/06/2018 | 3.3 |
| 02/06/2018 | 3.1 |
| 02/06/2018 | 2.8 |
| 03/06/2018 | 2.6 |
| 03/06/2018 | 2.4 |
| 03/06/2018 | 2.3 |
| 03/06/2018 | 2.3 |
| 03/06/2018 | 2.3 |
| 03/06/2018 | 2.3 |
| 03/06/2018 | 2.3 |
| 03/06/2018 | 2.4 |
| 03/06/2018 | 2.7 |
| 03/06/2018 | 2.9 |
| 03/06/2018 | 3.1 |
| 03/06/2018 | 3.3 |
| 03/06/2018 | 3.3 |
| 03/06/2018 | 3.3 |
| 03/06/2018 | 3.2 |
| 03/06/2018 | 3.1 |
| 03/06/2018 | 3.1 |
| 03/06/2018 | 3.2 |
| 03/06/2018 | 3.3 |
| 03/06/2018 | 3.3 |
| 03/06/2018 | 3.2 |
| 03/06/2018 | 3.2 |
| 03/06/2018 | 3.1 |
| 03/06/2018 | 2.8 |
| 04/06/2018 | 2.6 |
| 04/06/2018 | 2.4 |
| 04/06/2018 | 2.4 |
| 04/06/2018 | 2.3 |
| 04/06/2018 | 2.4 |
| 04/06/2018 | 2.7 |
| 04/06/2018 | 3.2 |
| 04/06/2018 | 3.7 |
| 04/06/2018 | 4.1 |
| 04/06/2018 | 4.3 |
| 04/06/2018 | 4.4 |
| 04/06/2018 | 4.4 |
| 04/06/2018 | 4.5 |
| 04/06/2018 | 4.4 |
| 04/06/2018 | 4.4 |
| 04/06/2018 | 4.3 |
| 04/06/2018 | 4.2 |
| 04/06/2018 | 4.2 |
| 04/06/2018 | 4.2 |
| 04/06/2018 | 4.2 |
| 04/06/2018 | 3.9 |
| 04/06/2018 | 3.7 |
| 04/06/2018 | 3.4 |
| 04/06/2018 | 3 |
| 05/06/2018 | 2.7 |
| 05/06/2018 | 2.5 |
| 05/06/2018 | 2.4 |
| 05/06/2018 | 2.4 |
| 05/06/2018 | 2.5 |
| 05/06/2018 | 2.7 |
| 05/06/2018 | 3.2 |
| 05/06/2018 | 3.8 |
| 05/06/2018 | 4.1 |
| 05/06/2018 | 4.3 |
| 05/06/2018 | 4.4 |
| 05/06/2018 | 4.5 |
| 05/06/2018 | 4.5 |
| 05/06/2018 | 4.4 |
| 05/06/2018 | 4.4 |
| 05/06/2018 | 4.3 |
| 05/06/2018 | 4.3 |
| 05/06/2018 | 4.2 |
| 05/06/2018 | 4.3 |
| 05/06/2018 | 4.2 |
| 05/06/2018 | 4 |
| 05/06/2018 | 3.7 |
| 05/06/2018 | 3.4 |
| 05/06/2018 | 3 |
| 06/06/2018 | 2.7 |
| 06/06/2018 | 2.5 |
| 06/06/2018 | 2.4 |
| 06/06/2018 | 2.4 |
| 06/06/2018 | 2.5 |
| 06/06/2018 | 2.7 |
| 06/06/2018 | 3.2 |
| 06/06/2018 | 3.8 |
| 06/06/2018 | 4.1 |
| 06/06/2018 | 4.3 |
| 06/06/2018 | 4.4 |
| 06/06/2018 | 4.5 |
| 06/06/2018 | 4.5 |
| 06/06/2018 | 4.4 |
| 06/06/2018 | 4.4 |
| 06/06/2018 | 4.3 |
| 06/06/2018 | 4.2 |
| 06/06/2018 | 4.2 |
| 06/06/2018 | 4.2 |
| 06/06/2018 | 4.2 |
| 06/06/2018 | 3.9 |
| 06/06/2018 | 3.7 |
| 06/06/2018 | 3.4 |
| 06/06/2018 | 3 |
| 07/06/2018 | 2.7 |
| 07/06/2018 | 2.5 |
| 07/06/2018 | 2.4 |
| 07/06/2018 | 2.4 |
| 07/06/2018 | 2.5 |
| 07/06/2018 | 2.7 |
| 07/06/2018 | 3.2 |
| 07/06/2018 | 3.8 |
| 07/06/2018 | 4.1 |
| 07/06/2018 | 4.3 |
| 07/06/2018 | 4.4 |
| 07/06/2018 | 4.5 |
| 07/06/2018 | 4.5 |
| 07/06/2018 | 4.4 |
| 07/06/2018 | 4.4 |
| 07/06/2018 | 4.3 |
| 07/06/2018 | 4.2 |
| 07/06/2018 | 4.2 |
| 07/06/2018 | 4.2 |
| 07/06/2018 | 4.2 |
| 07/06/2018 | 3.9 |
| 07/06/2018 | 3.7 |
| 07/06/2018 | 3.4 |
| 07/06/2018 | 3 |
| 08/06/2018 | 2.7 |
| 08/06/2018 | 2.5 |
| 08/06/2018 | 2.4 |
| 08/06/2018 | 2.4 |
| 08/06/2018 | 2.5 |
| 08/06/2018 | 2.7 |
| 08/06/2018 | 3.2 |
| 08/06/2018 | 3.7 |
| 08/06/2018 | 4.1 |
| 08/06/2018 | 4.3 |
| 08/06/2018 | 4.4 |
| 08/06/2018 | 4.5 |
| 08/06/2018 | 4.5 |
| 08/06/2018 | 4.4 |
| 08/06/2018 | 4.3 |
| 08/06/2018 | 4.2 |
| 08/06/2018 | 4.1 |
| 08/06/2018 | 4.1 |
| 08/06/2018 | 4 |
| 08/06/2018 | 4 |
| 08/06/2018 | 3.7 |
| 08/06/2018 | 3.5 |
| 08/06/2018 | 3.3 |
| 08/06/2018 | 3 |
| 09/06/2018 | 2.7 |
| 09/06/2018 | 2.5 |
| 09/06/2018 | 2.4 |
| 09/06/2018 | 2.4 |
| 09/06/2018 | 2.4 |
| 09/06/2018 | 2.4 |
| 09/06/2018 | 2.5 |
| 09/06/2018 | 2.7 |
| 09/06/2018 | 3 |
| 09/06/2018 | 3.4 |
| 09/06/2018 | 3.6 |
| 09/06/2018 | 3.7 |
| 09/06/2018 | 3.7 |
| 09/06/2018 | 3.6 |
| 09/06/2018 | 3.5 |
| 09/06/2018 | 3.5 |
| 09/06/2018 | 3.4 |
| 09/06/2018 | 3.4 |
| 09/06/2018 | 3.5 |
| 09/06/2018 | 3.5 |
| 09/06/2018 | 3.4 |
| 09/06/2018 | 3.2 |
| 09/06/2018 | 3.1 |
| 09/06/2018 | 2.8 |
| 10/06/2018 | 2.6 |
| 10/06/2018 | 2.4 |
| 10/06/2018 | 2.3 |
| 10/06/2018 | 2.3 |
| 10/06/2018 | 2.3 |
| 10/06/2018 | 2.3 |
| 10/06/2018 | 2.3 |
| 10/06/2018 | 2.4 |
| 10/06/2018 | 2.6 |
| 10/06/2018 | 2.9 |
| 10/06/2018 | 3.1 |
| 10/06/2018 | 3.3 |
| 10/06/2018 | 3.3 |
| 10/06/2018 | 3.3 |
| 10/06/2018 | 3.2 |
| 10/06/2018 | 3.1 |
| 10/06/2018 | 3.1 |
| 10/06/2018 | 3.2 |
| 10/06/2018 | 3.2 |
| 10/06/2018 | 3.2 |
| 10/06/2018 | 3.2 |
| 10/06/2018 | 3.2 |
| 10/06/2018 | 3.1 |
| 10/06/2018 | 2.8 |
| 11/06/2018 | 2.6 |
| 11/06/2018 | 2.4 |
| 11/06/2018 | 2.3 |
| 11/06/2018 | 2.3 |
| 11/06/2018 | 2.4 |
| 11/06/2018 | 2.6 |
| 11/06/2018 | 3.2 |
| 11/06/2018 | 3.7 |
| 11/06/2018 | 4 |
| 11/06/2018 | 4.2 |
| 11/06/2018 | 4.4 |
| 11/06/2018 | 4.4 |
| 11/06/2018 | 4.5 |
| 11/06/2018 | 4.4 |
| 11/06/2018 | 4.4 |
| 11/06/2018 | 4.3 |
| 11/06/2018 | 4.2 |
| 11/06/2018 | 4.2 |
| 11/06/2018 | 4.2 |
| 11/06/2018 | 4.2 |
| 11/06/2018 | 3.9 |
| 11/06/2018 | 3.7 |
| 11/06/2018 | 3.4 |
| 11/06/2018 | 3 |
| 12/06/2018 | 2.7 |
| 12/06/2018 | 2.5 |
| 12/06/2018 | 2.4 |
| 12/06/2018 | 2.4 |
| 12/06/2018 | 2.5 |
| 12/06/2018 | 2.7 |
| 12/06/2018 | 3.2 |
| 12/06/2018 | 3.7 |
| 12/06/2018 | 4.1 |
| 12/06/2018 | 4.3 |
| 12/06/2018 | 4.4 |
| 12/06/2018 | 4.5 |
| 12/06/2018 | 4.5 |
| 12/06/2018 | 4.4 |
| 12/06/2018 | 4.4 |
| 12/06/2018 | 4.3 |
| 12/06/2018 | 4.3 |
| 12/06/2018 | 4.2 |
| 12/06/2018 | 4.2 |
| 12/06/2018 | 4.2 |
| 12/06/2018 | 3.9 |
| 12/06/2018 | 3.7 |
| 12/06/2018 | 3.4 |
| 12/06/2018 | 3 |
| 13/06/2018 | 2.7 |
| 13/06/2018 | 2.5 |
| 13/06/2018 | 2.4 |
| 13/06/2018 | 2.4 |
| 13/06/2018 | 2.5 |
| 13/06/2018 | 2.7 |
| 13/06/2018 | 3.2 |
| 13/06/2018 | 3.7 |
| 13/06/2018 | 4.1 |
| 13/06/2018 | 4.3 |
| 13/06/2018 | 4.4 |
| 13/06/2018 | 4.5 |
| 13/06/2018 | 4.5 |
| 13/06/2018 | 4.4 |
| 13/06/2018 | 4.4 |
| 13/06/2018 | 4.3 |
| 13/06/2018 | 4.2 |
| 13/06/2018 | 4.2 |
| 13/06/2018 | 4.2 |
| 13/06/2018 | 4.1 |
| 13/06/2018 | 3.9 |
| 13/06/2018 | 3.7 |
| 13/06/2018 | 3.4 |
| 13/06/2018 | 3 |
| 14/06/2018 | 2.7 |
| 14/06/2018 | 2.5 |
| 14/06/2018 | 2.4 |
| 14/06/2018 | 2.4 |
| 14/06/2018 | 2.5 |
| 14/06/2018 | 2.7 |
| 14/06/2018 | 3.2 |
| 14/06/2018 | 3.7 |
| 14/06/2018 | 4.1 |
| 14/06/2018 | 4.3 |
| 14/06/2018 | 4.4 |
| 14/06/2018 | 4.5 |
| 14/06/2018 | 4.5 |
| 14/06/2018 | 4.4 |
| 14/06/2018 | 4.4 |
| 14/06/2018 | 4.3 |
| 14/06/2018 | 4.2 |
| 14/06/2018 | 4.2 |
| 14/06/2018 | 4.2 |
| 14/06/2018 | 4.1 |
| 14/06/2018 | 3.9 |
| 14/06/2018 | 3.7 |
| 14/06/2018 | 3.4 |
| 14/06/2018 | 3 |
| 15/06/2018 | 2.7 |
| 15/06/2018 | 2.5 |
| 15/06/2018 | 2.4 |
| 15/06/2018 | 2.4 |
| 15/06/2018 | 2.5 |
| 15/06/2018 | 2.7 |
| 15/06/2018 | 3.2 |
| 15/06/2018 | 3.7 |
| 15/06/2018 | 4.1 |
| 15/06/2018 | 4.3 |
| 15/06/2018 | 4.4 |
| 15/06/2018 | 4.5 |
| 15/06/2018 | 4.5 |
| 15/06/2018 | 4.4 |
| 15/06/2018 | 4.3 |
| 15/06/2018 | 4.2 |
| 15/06/2018 | 4.1 |
| 15/06/2018 | 4.1 |
| 15/06/2018 | 4 |
| 15/06/2018 | 3.9 |
| 15/06/2018 | 3.7 |
| 15/06/2018 | 3.5 |
| 15/06/2018 | 3.3 |
| 15/06/2018 | 3 |
| 16/06/2018 | 2.7 |
| 16/06/2018 | 2.5 |
| 16/06/2018 | 2.4 |
| 16/06/2018 | 2.4 |
| 16/06/2018 | 2.4 |
| 16/06/2018 | 2.4 |
| 16/06/2018 | 2.5 |
| 16/06/2018 | 2.7 |
| 16/06/2018 | 3 |
| 16/06/2018 | 3.4 |
| 16/06/2018 | 3.6 |
| 16/06/2018 | 3.7 |
| 16/06/2018 | 3.7 |
| 16/06/2018 | 3.6 |
| 16/06/2018 | 3.5 |
| 16/06/2018 | 3.5 |
| 16/06/2018 | 3.5 |
| 16/06/2018 | 3.4 |
| 16/06/2018 | 3.5 |
| 16/06/2018 | 3.4 |
| 16/06/2018 | 3.3 |
| 16/06/2018 | 3.2 |
| 16/06/2018 | 3 |
| 16/06/2018 | 2.8 |
| 17/06/2018 | 2.6 |
| 17/06/2018 | 2.4 |
| 17/06/2018 | 2.3 |
| 17/06/2018 | 2.3 |
| 17/06/2018 | 2.3 |
| 17/06/2018 | 2.3 |
| 17/06/2018 | 2.3 |
| 17/06/2018 | 2.4 |
| 17/06/2018 | 2.6 |
| 17/06/2018 | 2.9 |
| 17/06/2018 | 3.1 |
| 17/06/2018 | 3.3 |
| 17/06/2018 | 3.3 |
| 17/06/2018 | 3.3 |
| 17/06/2018 | 3.2 |
| 17/06/2018 | 3.1 |
| 17/06/2018 | 3.1 |
| 17/06/2018 | 3.2 |
| 17/06/2018 | 3.2 |
| 17/06/2018 | 3.2 |
| 17/06/2018 | 3.2 |
| 17/06/2018 | 3.2 |
| 17/06/2018 | 3.1 |
| 17/06/2018 | 2.8 |
| 18/06/2018 | 2.6 |
| 18/06/2018 | 2.4 |
| 18/06/2018 | 2.3 |
| 18/06/2018 | 2.3 |
| 18/06/2018 | 2.4 |
| 18/06/2018 | 2.6 |
| 18/06/2018 | 3.1 |
| 18/06/2018 | 3.7 |
| 18/06/2018 | 4 |
| 18/06/2018 | 4.2 |
| 18/06/2018 | 4.4 |
| 18/06/2018 | 4.4 |
| 18/06/2018 | 4.5 |
| 18/06/2018 | 4.4 |
| 18/06/2018 | 4.4 |
| 18/06/2018 | 4.3 |
| 18/06/2018 | 4.2 |
| 18/06/2018 | 4.2 |
| 18/06/2018 | 4.2 |
| 18/06/2018 | 4.1 |
| 18/06/2018 | 3.9 |
| 18/06/2018 | 3.7 |
| 18/06/2018 | 3.4 |
| 18/06/2018 | 3 |
| 19/06/2018 | 2.7 |
| 19/06/2018 | 2.5 |
| 19/06/2018 | 2.4 |
| 19/06/2018 | 2.4 |
| 19/06/2018 | 2.5 |
| 19/06/2018 | 2.7 |
| 19/06/2018 | 3.2 |
| 19/06/2018 | 3.7 |
| 19/06/2018 | 4.1 |
| 19/06/2018 | 4.3 |
| 19/06/2018 | 4.4 |
| 19/06/2018 | 4.5 |
| 19/06/2018 | 4.5 |
| 19/06/2018 | 4.4 |
| 19/06/2018 | 4.4 |
| 19/06/2018 | 4.3 |
| 19/06/2018 | 4.3 |
| 19/06/2018 | 4.3 |
| 19/06/2018 | 4.2 |
| 19/06/2018 | 4.1 |
| 19/06/2018 | 3.9 |
| 19/06/2018 | 3.7 |
| 19/06/2018 | 3.4 |
| 19/06/2018 | 3 |
| 20/06/2018 | 2.7 |
| 20/06/2018 | 2.5 |
| 20/06/2018 | 2.4 |
| 20/06/2018 | 2.4 |
| 20/06/2018 | 2.5 |
| 20/06/2018 | 2.7 |
| 20/06/2018 | 3.2 |
| 20/06/2018 | 3.7 |
| 20/06/2018 | 4.1 |
| 20/06/2018 | 4.3 |
| 20/06/2018 | 4.4 |
| 20/06/2018 | 4.5 |
| 20/06/2018 | 4.5 |
| 20/06/2018 | 4.4 |
| 20/06/2018 | 4.4 |
| 20/06/2018 | 4.3 |
| 20/06/2018 | 4.2 |
| 20/06/2018 | 4.2 |
| 20/06/2018 | 4.2 |
| 20/06/2018 | 4.1 |
| 20/06/2018 | 3.8 |
| 20/06/2018 | 3.6 |
| 20/06/2018 | 3.4 |
| 20/06/2018 | 3 |
| 21/06/2018 | 2.7 |
| 21/06/2018 | 2.5 |
| 21/06/2018 | 2.4 |
| 21/06/2018 | 2.4 |
| 21/06/2018 | 2.5 |
| 21/06/2018 | 2.7 |
| 21/06/2018 | 3.2 |
| 21/06/2018 | 3.7 |
| 21/06/2018 | 4.1 |
| 21/06/2018 | 4.3 |
| 21/06/2018 | 4.4 |
| 21/06/2018 | 4.5 |
| 21/06/2018 | 4.5 |
| 21/06/2018 | 4.4 |
| 21/06/2018 | 4.4 |
| 21/06/2018 | 4.3 |
| 21/06/2018 | 4.2 |
| 21/06/2018 | 4.2 |
| 21/06/2018 | 4.2 |
| 21/06/2018 | 4.1 |
| 21/06/2018 | 3.9 |
| 21/06/2018 | 3.7 |
| 21/06/2018 | 3.4 |
| 21/06/2018 | 3 |
| 22/06/2018 | 2.7 |
| 22/06/2018 | 2.5 |
| 22/06/2018 | 2.4 |
| 22/06/2018 | 2.4 |
| 22/06/2018 | 2.5 |
| 22/06/2018 | 2.7 |
| 22/06/2018 | 3.2 |
| 22/06/2018 | 3.7 |
| 22/06/2018 | 4.1 |
| 22/06/2018 | 4.3 |
| 22/06/2018 | 4.4 |
| 22/06/2018 | 4.5 |
| 22/06/2018 | 4.5 |
| 22/06/2018 | 4.4 |
| 22/06/2018 | 4.3 |
| 22/06/2018 | 4.2 |
| 22/06/2018 | 4.1 |
| 22/06/2018 | 4.1 |
| 22/06/2018 | 4 |
| 22/06/2018 | 3.9 |
| 22/06/2018 | 3.7 |
| 22/06/2018 | 3.5 |
| 22/06/2018 | 3.3 |
| 22/06/2018 | 2.9 |
| 23/06/2018 | 2.7 |
| 23/06/2018 | 2.5 |
| 23/06/2018 | 2.4 |
| 23/06/2018 | 2.4 |
| 23/06/2018 | 2.4 |
| 23/06/2018 | 2.4 |
| 23/06/2018 | 2.5 |
| 23/06/2018 | 2.7 |
| 23/06/2018 | 3 |
| 23/06/2018 | 3.4 |
| 23/06/2018 | 3.6 |
| 23/06/2018 | 3.7 |
| 23/06/2018 | 3.7 |
| 23/06/2018 | 3.6 |
| 23/06/2018 | 3.5 |
| 23/06/2018 | 3.5 |
| 23/06/2018 | 3.5 |
| 23/06/2018 | 3.4 |
| 23/06/2018 | 3.4 |
| 23/06/2018 | 3.4 |
| 23/06/2018 | 3.3 |
| 23/06/2018 | 3.2 |
| 23/06/2018 | 3 |
| 23/06/2018 | 2.8 |
| 24/06/2018 | 2.6 |
| 24/06/2018 | 2.4 |
| 24/06/2018 | 2.3 |
| 24/06/2018 | 2.3 |
| 24/06/2018 | 2.3 |
| 24/06/2018 | 2.2 |
| 24/06/2018 | 2.3 |
| 24/06/2018 | 2.4 |
| 24/06/2018 | 2.6 |
| 24/06/2018 | 2.9 |
| 24/06/2018 | 3.1 |
| 24/06/2018 | 3.3 |
| 24/06/2018 | 3.3 |
| 24/06/2018 | 3.3 |
| 24/06/2018 | 3.2 |
| 24/06/2018 | 3.1 |
| 24/06/2018 | 3.1 |
| 24/06/2018 | 3.2 |
| 24/06/2018 | 3.2 |
| 24/06/2018 | 3.2 |
| 24/06/2018 | 3.1 |
| 24/06/2018 | 3.1 |
| 24/06/2018 | 3.1 |
| 24/06/2018 | 2.8 |
| 25/06/2018 | 2.6 |
| 25/06/2018 | 2.4 |
| 25/06/2018 | 2.3 |
| 25/06/2018 | 2.3 |
| 25/06/2018 | 2.4 |
| 25/06/2018 | 2.6 |
| 25/06/2018 | 3.1 |
| 25/06/2018 | 3.6 |
| 25/06/2018 | 4 |
| 25/06/2018 | 4.2 |
| 25/06/2018 | 4.4 |
| 25/06/2018 | 4.4 |
| 25/06/2018 | 4.5 |
| 25/06/2018 | 4.4 |
| 25/06/2018 | 4.4 |
| 25/06/2018 | 4.3 |
| 25/06/2018 | 4.2 |
| 25/06/2018 | 4.2 |
| 25/06/2018 | 4.2 |
| 25/06/2018 | 4.1 |
| 25/06/2018 | 3.8 |
| 25/06/2018 | 3.6 |
| 25/06/2018 | 3.3 |
| 25/06/2018 | 3 |
| 26/06/2018 | 2.7 |
| 26/06/2018 | 2.5 |
| 26/06/2018 | 2.4 |
| 26/06/2018 | 2.4 |
| 26/06/2018 | 2.5 |
| 26/06/2018 | 2.7 |
| 26/06/2018 | 3.2 |
| 26/06/2018 | 3.7 |
| 26/06/2018 | 4.1 |
| 26/06/2018 | 4.2 |
| 26/06/2018 | 4.4 |
| 26/06/2018 | 4.4 |
| 26/06/2018 | 4.5 |
| 26/06/2018 | 4.4 |
| 26/06/2018 | 4.4 |
| 26/06/2018 | 4.3 |
| 26/06/2018 | 4.3 |
| 26/06/2018 | 4.3 |
| 26/06/2018 | 4.2 |
| 26/06/2018 | 4.1 |
| 26/06/2018 | 3.8 |
| 26/06/2018 | 3.6 |
| 26/06/2018 | 3.4 |
| 26/06/2018 | 3 |
| 27/06/2018 | 2.7 |
| 27/06/2018 | 2.5 |
| 27/06/2018 | 2.4 |
| 27/06/2018 | 2.4 |
| 27/06/2018 | 2.5 |
| 27/06/2018 | 2.7 |
| 27/06/2018 | 3.2 |
| 27/06/2018 | 3.7 |
| 27/06/2018 | 4.1 |
| 27/06/2018 | 4.3 |
| 27/06/2018 | 4.4 |
| 27/06/2018 | 4.5 |
| 27/06/2018 | 4.5 |
| 27/06/2018 | 4.4 |
| 27/06/2018 | 4.4 |
| 27/06/2018 | 4.3 |
| 27/06/2018 | 4.3 |
| 27/06/2018 | 4.2 |
| 27/06/2018 | 4.2 |
| 27/06/2018 | 4.1 |
| 27/06/2018 | 3.8 |
| 27/06/2018 | 3.6 |
| 27/06/2018 | 3.4 |
| 27/06/2018 | 3 |
| 28/06/2018 | 2.7 |
| 28/06/2018 | 2.5 |
| 28/06/2018 | 2.4 |
| 28/06/2018 | 2.4 |
| 28/06/2018 | 2.5 |
| 28/06/2018 | 2.7 |
| 28/06/2018 | 3.2 |
| 28/06/2018 | 3.7 |
| 28/06/2018 | 4.1 |
| 28/06/2018 | 4.2 |
| 28/06/2018 | 4.4 |
| 28/06/2018 | 4.4 |
| 28/06/2018 | 4.5 |
| 28/06/2018 | 4.4 |
| 28/06/2018 | 4.4 |
| 28/06/2018 | 4.3 |
| 28/06/2018 | 4.2 |
| 28/06/2018 | 4.2 |
| 28/06/2018 | 4.2 |
| 28/06/2018 | 4.1 |
| 28/06/2018 | 3.8 |
| 28/06/2018 | 3.6 |
| 28/06/2018 | 3.4 |
| 28/06/2018 | 3 |
| 29/06/2018 | 2.7 |
| 29/06/2018 | 2.5 |
| 29/06/2018 | 2.4 |
| 29/06/2018 | 2.4 |
| 29/06/2018 | 2.5 |
| 29/06/2018 | 2.7 |
| 29/06/2018 | 3.1 |
| 29/06/2018 | 3.7 |
| 29/06/2018 | 4 |
| 29/06/2018 | 4.2 |
| 29/06/2018 | 4.4 |
| 29/06/2018 | 4.4 |
| 29/06/2018 | 4.4 |
| 29/06/2018 | 4.4 |
| 29/06/2018 | 4.3 |
| 29/06/2018 | 4.2 |
| 29/06/2018 | 4.1 |
| 29/06/2018 | 4.1 |
| 29/06/2018 | 4 |
| 29/06/2018 | 3.9 |
| 29/06/2018 | 3.6 |
| 29/06/2018 | 3.5 |
| 29/06/2018 | 3.2 |
| 29/06/2018 | 2.9 |
| 30/06/2018 | 2.7 |
| 30/06/2018 | 2.5 |
| 30/06/2018 | 2.4 |
| 30/06/2018 | 2.4 |
| 30/06/2018 | 2.3 |
| 30/06/2018 | 2.3 |
| 30/06/2018 | 2.4 |
| 30/06/2018 | 2.7 |
| 30/06/2018 | 3 |
| 30/06/2018 | 3.3 |
| 30/06/2018 | 3.6 |
| 30/06/2018 | 3.7 |
| 30/06/2018 | 3.7 |
| 30/06/2018 | 3.6 |
| 30/06/2018 | 3.5 |
| 30/06/2018 | 3.5 |
| 30/06/2018 | 3.5 |
| 30/06/2018 | 3.4 |
| 30/06/2018 | 3.4 |
| 30/06/2018 | 3.4 |
| 30/06/2018 | 3.3 |
| 30/06/2018 | 3.2 |
| 30/06/2018 | 3 |
| 30/06/2018 | 2.8 |
| 01/07/2018 | 2.6 |
| 01/07/2018 | 2.4 |
| 01/07/2018 | 2.3 |
| 01/07/2018 | 2.3 |
| 01/07/2018 | 2.3 |
| 01/07/2018 | 2.2 |
| 01/07/2018 | 2.2 |
| 01/07/2018 | 2.4 |
| 01/07/2018 | 2.6 |
| 01/07/2018 | 2.9 |
| 01/07/2018 | 3.1 |
| 01/07/2018 | 3.2 |
| 01/07/2018 | 3.3 |
| 01/07/2018 | 3.3 |
| 01/07/2018 | 3.2 |
| 01/07/2018 | 3.1 |
| 01/07/2018 | 3.1 |
| 01/07/2018 | 3.2 |
| 01/07/2018 | 3.2 |
| 01/07/2018 | 3.2 |
| 01/07/2018 | 3.1 |
| 01/07/2018 | 3.1 |
| 01/07/2018 | 3.1 |
| 01/07/2018 | 2.8 |
| 02/07/2018 | 2.6 |
| 02/07/2018 | 2.4 |
| 02/07/2018 | 2.3 |
| 02/07/2018 | 2.3 |
| 02/07/2018 | 2.4 |
| 02/07/2018 | 2.6 |
| 02/07/2018 | 3.1 |
| 02/07/2018 | 3.6 |
| 02/07/2018 | 4 |
| 02/07/2018 | 4.2 |
| 02/07/2018 | 4.3 |
| 02/07/2018 | 4.4 |
| 02/07/2018 | 4.5 |
| 02/07/2018 | 4.4 |
| 02/07/2018 | 4.4 |
| 02/07/2018 | 4.3 |
| 02/07/2018 | 4.3 |
| 02/07/2018 | 4.2 |
| 02/07/2018 | 4.2 |
| 02/07/2018 | 4.1 |
| 02/07/2018 | 3.8 |
| 02/07/2018 | 3.6 |
| 02/07/2018 | 3.3 |
| 02/07/2018 | 3 |
| 03/07/2018 | 2.7 |
| 03/07/2018 | 2.5 |
| 03/07/2018 | 2.4 |
| 03/07/2018 | 2.4 |
| 03/07/2018 | 2.5 |
| 03/07/2018 | 2.7 |
| 03/07/2018 | 3.2 |
| 03/07/2018 | 3.7 |
| 03/07/2018 | 4 |
| 03/07/2018 | 4.2 |
| 03/07/2018 | 4.4 |
| 03/07/2018 | 4.4 |
| 03/07/2018 | 4.5 |
| 03/07/2018 | 4.4 |
| 03/07/2018 | 4.4 |
| 03/07/2018 | 4.3 |
| 03/07/2018 | 4.3 |
| 03/07/2018 | 4.3 |
| 03/07/2018 | 4.2 |
| 03/07/2018 | 4.1 |
| 03/07/2018 | 3.8 |
| 03/07/2018 | 3.6 |
| 03/07/2018 | 3.3 |
| 03/07/2018 | 3 |
| 04/07/2018 | 2.7 |
| 04/07/2018 | 2.5 |
| 04/07/2018 | 2.4 |
| 04/07/2018 | 2.4 |
| 04/07/2018 | 2.5 |
| 04/07/2018 | 2.7 |
| 04/07/2018 | 3.2 |
| 04/07/2018 | 3.7 |
| 04/07/2018 | 4 |
| 04/07/2018 | 4.2 |
| 04/07/2018 | 4.4 |
| 04/07/2018 | 4.5 |
| 04/07/2018 | 4.5 |
| 04/07/2018 | 4.4 |
| 04/07/2018 | 4.4 |
| 04/07/2018 | 4.3 |
| 04/07/2018 | 4.3 |
| 04/07/2018 | 4.2 |
| 04/07/2018 | 4.2 |
| 04/07/2018 | 4.1 |
| 04/07/2018 | 3.8 |
| 04/07/2018 | 3.6 |
| 04/07/2018 | 3.4 |
| 04/07/2018 | 3 |
| 05/07/2018 | 2.7 |
| 05/07/2018 | 2.5 |
| 05/07/2018 | 2.4 |
| 05/07/2018 | 2.4 |
| 05/07/2018 | 2.5 |
| 05/07/2018 | 2.7 |
| 05/07/2018 | 3.1 |
| 05/07/2018 | 3.5 |
| 05/07/2018 | 3.9 |
| 05/07/2018 | 4.1 |
| 05/07/2018 | 4.3 |
| 05/07/2018 | 4.4 |
| 05/07/2018 | 4.4 |
| 05/07/2018 | 4.4 |
| 05/07/2018 | 4.3 |
| 05/07/2018 | 4.2 |
| 05/07/2018 | 4.2 |
| 05/07/2018 | 4.2 |
| 05/07/2018 | 4.1 |
| 05/07/2018 | 3.9 |
| 05/07/2018 | 3.7 |
| 05/07/2018 | 3.6 |
| 05/07/2018 | 3.3 |
| 05/07/2018 | 3 |
| 06/07/2018 | 2.7 |
| 06/07/2018 | 2.5 |
| 06/07/2018 | 2.4 |
| 06/07/2018 | 2.4 |
| 06/07/2018 | 2.5 |
| 06/07/2018 | 2.7 |
| 06/07/2018 | 3.1 |
| 06/07/2018 | 3.5 |
| 06/07/2018 | 3.9 |
| 06/07/2018 | 4.1 |
| 06/07/2018 | 4.3 |
| 06/07/2018 | 4.4 |
| 06/07/2018 | 4.4 |
| 06/07/2018 | 4.3 |
| 06/07/2018 | 4.2 |
| 06/07/2018 | 4.1 |
| 06/07/2018 | 4 |
| 06/07/2018 | 4 |
| 06/07/2018 | 3.9 |
| 06/07/2018 | 3.7 |
| 06/07/2018 | 3.5 |
| 06/07/2018 | 3.4 |
| 06/07/2018 | 3.2 |
| 06/07/2018 | 2.9 |
| 07/07/2018 | 2.7 |
| 07/07/2018 | 2.5 |
| 07/07/2018 | 2.4 |
| 07/07/2018 | 2.4 |
| 07/07/2018 | 2.4 |
| 07/07/2018 | 2.3 |
| 07/07/2018 | 2.4 |
| 07/07/2018 | 2.6 |
| 07/07/2018 | 2.9 |
| 07/07/2018 | 3.3 |
| 07/07/2018 | 3.5 |
| 07/07/2018 | 3.7 |
| 07/07/2018 | 3.7 |
| 07/07/2018 | 3.6 |
| 07/07/2018 | 3.5 |
| 07/07/2018 | 3.4 |
| 07/07/2018 | 3.4 |
| 07/07/2018 | 3.4 |
| 07/07/2018 | 3.3 |
| 07/07/2018 | 3.3 |
| 07/07/2018 | 3.2 |
| 07/07/2018 | 3.2 |
| 07/07/2018 | 3 |
| 07/07/2018 | 2.8 |
| 08/07/2018 | 2.6 |
| 08/07/2018 | 2.4 |
| 08/07/2018 | 2.3 |
| 08/07/2018 | 2.3 |
| 08/07/2018 | 2.3 |
| 08/07/2018 | 2.2 |
| 08/07/2018 | 2.2 |
| 08/07/2018 | 2.3 |
| 08/07/2018 | 2.5 |
| 08/07/2018 | 2.8 |
| 08/07/2018 | 3 |
| 08/07/2018 | 3.2 |
| 08/07/2018 | 3.3 |
| 08/07/2018 | 3.2 |
| 08/07/2018 | 3.1 |
| 08/07/2018 | 3.1 |
| 08/07/2018 | 3.1 |
| 08/07/2018 | 3.1 |
| 08/07/2018 | 3.1 |
| 08/07/2018 | 3.1 |
| 08/07/2018 | 3 |
| 08/07/2018 | 3.1 |
| 08/07/2018 | 3 |
| 08/07/2018 | 2.8 |
| 09/07/2018 | 2.6 |
| 09/07/2018 | 2.4 |
| 09/07/2018 | 2.3 |
| 09/07/2018 | 2.3 |
| 09/07/2018 | 2.4 |
| 09/07/2018 | 2.6 |
| 09/07/2018 | 3 |
| 09/07/2018 | 3.5 |
| 09/07/2018 | 3.9 |
| 09/07/2018 | 4.1 |
| 09/07/2018 | 4.3 |
| 09/07/2018 | 4.4 |
| 09/07/2018 | 4.4 |
| 09/07/2018 | 4.4 |
| 09/07/2018 | 4.3 |
| 09/07/2018 | 4.2 |
| 09/07/2018 | 4.2 |
| 09/07/2018 | 4.2 |
| 09/07/2018 | 4.1 |
| 09/07/2018 | 3.9 |
| 09/07/2018 | 3.7 |
| 09/07/2018 | 3.6 |
| 09/07/2018 | 3.3 |
| 09/07/2018 | 3 |
| 10/07/2018 | 2.7 |
| 10/07/2018 | 2.5 |
| 10/07/2018 | 2.4 |
| 10/07/2018 | 2.4 |
| 10/07/2018 | 2.5 |
| 10/07/2018 | 2.7 |
| 10/07/2018 | 3.1 |
| 10/07/2018 | 3.6 |
| 10/07/2018 | 3.9 |
| 10/07/2018 | 4.1 |
| 10/07/2018 | 4.3 |
| 10/07/2018 | 4.4 |
| 10/07/2018 | 4.4 |
| 10/07/2018 | 4.4 |
| 10/07/2018 | 4.3 |
| 10/07/2018 | 4.2 |
| 10/07/2018 | 4.2 |
| 10/07/2018 | 4.2 |
| 10/07/2018 | 4.1 |
| 10/07/2018 | 4 |
| 10/07/2018 | 3.7 |
| 10/07/2018 | 3.6 |
| 10/07/2018 | 3.3 |
| 10/07/2018 | 3 |
| 11/07/2018 | 2.7 |
| 11/07/2018 | 2.5 |
| 11/07/2018 | 2.4 |
| 11/07/2018 | 2.4 |
| 11/07/2018 | 2.5 |
| 11/07/2018 | 2.7 |
| 11/07/2018 | 3.1 |
| 11/07/2018 | 3.6 |
| 11/07/2018 | 3.9 |
| 11/07/2018 | 4.2 |
| 11/07/2018 | 4.3 |
| 11/07/2018 | 4.4 |
| 11/07/2018 | 4.4 |
| 11/07/2018 | 4.4 |
| 11/07/2018 | 4.3 |
| 11/07/2018 | 4.2 |
| 11/07/2018 | 4.2 |
| 11/07/2018 | 4.2 |
| 11/07/2018 | 4.1 |
| 11/07/2018 | 4 |
| 11/07/2018 | 3.7 |
| 11/07/2018 | 3.6 |
| 11/07/2018 | 3.3 |
| 11/07/2018 | 3 |
| 12/07/2018 | 2.7 |
| 12/07/2018 | 2.5 |
| 12/07/2018 | 2.4 |
| 12/07/2018 | 2.4 |
| 12/07/2018 | 2.5 |
| 12/07/2018 | 2.7 |
| 12/07/2018 | 3.1 |
| 12/07/2018 | 3.6 |
| 12/07/2018 | 3.9 |
| 12/07/2018 | 4.1 |
| 12/07/2018 | 4.3 |
| 12/07/2018 | 4.4 |
| 12/07/2018 | 4.4 |
| 12/07/2018 | 4.4 |
| 12/07/2018 | 4.3 |
| 12/07/2018 | 4.2 |
| 12/07/2018 | 4.2 |
| 12/07/2018 | 4.2 |
| 12/07/2018 | 4.1 |
| 12/07/2018 | 4 |
| 12/07/2018 | 3.7 |
| 12/07/2018 | 3.6 |
| 12/07/2018 | 3.3 |
| 12/07/2018 | 3 |
| 13/07/2018 | 2.7 |
| 13/07/2018 | 2.5 |
| 13/07/2018 | 2.4 |
| 13/07/2018 | 2.4 |
| 13/07/2018 | 2.5 |
| 13/07/2018 | 2.7 |
| 13/07/2018 | 3.1 |
| 13/07/2018 | 3.5 |
| 13/07/2018 | 3.9 |
| 13/07/2018 | 4.2 |
| 13/07/2018 | 4.3 |
| 13/07/2018 | 4.4 |
| 13/07/2018 | 4.4 |
| 13/07/2018 | 4.3 |
| 13/07/2018 | 4.2 |
| 13/07/2018 | 4.1 |
| 13/07/2018 | 4.1 |
| 13/07/2018 | 4 |
| 13/07/2018 | 3.9 |
| 13/07/2018 | 3.8 |
| 13/07/2018 | 3.6 |
| 13/07/2018 | 3.4 |
| 13/07/2018 | 3.2 |
| 13/07/2018 | 2.9 |
| 14/07/2018 | 2.7 |
| 14/07/2018 | 2.5 |
| 14/07/2018 | 2.4 |
| 14/07/2018 | 2.4 |
| 14/07/2018 | 2.4 |
| 14/07/2018 | 2.4 |
| 14/07/2018 | 2.4 |
| 14/07/2018 | 2.6 |
| 14/07/2018 | 2.9 |
| 14/07/2018 | 3.3 |
| 14/07/2018 | 3.5 |
| 14/07/2018 | 3.7 |
| 14/07/2018 | 3.7 |
| 14/07/2018 | 3.6 |
| 14/07/2018 | 3.5 |
| 14/07/2018 | 3.4 |
| 14/07/2018 | 3.4 |
| 14/07/2018 | 3.4 |
| 14/07/2018 | 3.4 |
| 14/07/2018 | 3.3 |
| 14/07/2018 | 3.2 |
| 14/07/2018 | 3.2 |
| 14/07/2018 | 3 |
| 14/07/2018 | 2.8 |
| 15/07/2018 | 2.6 |
| 15/07/2018 | 2.4 |
| 15/07/2018 | 2.3 |
| 15/07/2018 | 2.3 |
| 15/07/2018 | 2.3 |
| 15/07/2018 | 2.2 |
| 15/07/2018 | 2.2 |
| 15/07/2018 | 2.3 |
| 15/07/2018 | 2.5 |
| 15/07/2018 | 2.8 |
| 15/07/2018 | 3 |
| 15/07/2018 | 3.2 |
| 15/07/2018 | 3.3 |
| 15/07/2018 | 3.2 |
| 15/07/2018 | 3.1 |
| 15/07/2018 | 3.1 |
| 15/07/2018 | 3.1 |
| 15/07/2018 | 3.1 |
| 15/07/2018 | 3.2 |
| 15/07/2018 | 3.1 |
| 15/07/2018 | 3.1 |
| 15/07/2018 | 3.1 |
| 15/07/2018 | 3 |
| 15/07/2018 | 2.8 |
| 16/07/2018 | 2.6 |
| 16/07/2018 | 2.4 |
| 16/07/2018 | 2.3 |
| 16/07/2018 | 2.3 |
| 16/07/2018 | 2.4 |
| 16/07/2018 | 2.6 |
| 16/07/2018 | 3 |
| 16/07/2018 | 3.5 |
| 16/07/2018 | 3.9 |
| 16/07/2018 | 4.1 |
| 16/07/2018 | 4.3 |
| 16/07/2018 | 4.4 |
| 16/07/2018 | 4.4 |
| 16/07/2018 | 4.4 |
| 16/07/2018 | 4.3 |
| 16/07/2018 | 4.2 |
| 16/07/2018 | 4.2 |
| 16/07/2018 | 4.2 |
| 16/07/2018 | 4.1 |
| 16/07/2018 | 4 |
| 16/07/2018 | 3.8 |
| 16/07/2018 | 3.6 |
| 16/07/2018 | 3.3 |
| 16/07/2018 | 3 |
| 17/07/2018 | 2.7 |
| 17/07/2018 | 2.5 |
| 17/07/2018 | 2.4 |
| 17/07/2018 | 2.4 |
| 17/07/2018 | 2.5 |
| 17/07/2018 | 2.7 |
| 17/07/2018 | 3.1 |
| 17/07/2018 | 3.6 |
| 17/07/2018 | 3.9 |
| 17/07/2018 | 4.2 |
| 17/07/2018 | 4.3 |
| 17/07/2018 | 4.4 |
| 17/07/2018 | 4.4 |
| 17/07/2018 | 4.4 |
| 17/07/2018 | 4.3 |
| 17/07/2018 | 4.2 |
| 17/07/2018 | 4.2 |
| 17/07/2018 | 4.2 |
| 17/07/2018 | 4.1 |
| 17/07/2018 | 4 |
| 17/07/2018 | 3.8 |
| 17/07/2018 | 3.6 |
| 17/07/2018 | 3.3 |
| 17/07/2018 | 3 |
| 18/07/2018 | 2.7 |
| 18/07/2018 | 2.5 |
| 18/07/2018 | 2.4 |
| 18/07/2018 | 2.4 |
| 18/07/2018 | 2.5 |
| 18/07/2018 | 2.7 |
| 18/07/2018 | 3.1 |
| 18/07/2018 | 3.6 |
| 18/07/2018 | 3.9 |
| 18/07/2018 | 4.2 |
| 18/07/2018 | 4.3 |
| 18/07/2018 | 4.4 |
| 18/07/2018 | 4.4 |
| 18/07/2018 | 4.4 |
| 18/07/2018 | 4.3 |
| 18/07/2018 | 4.2 |
| 18/07/2018 | 4.2 |
| 18/07/2018 | 4.2 |
| 18/07/2018 | 4.1 |
| 18/07/2018 | 4 |
| 18/07/2018 | 3.8 |
| 18/07/2018 | 3.6 |
| 18/07/2018 | 3.3 |
| 18/07/2018 | 3 |
| 19/07/2018 | 2.7 |
| 19/07/2018 | 2.5 |
| 19/07/2018 | 2.4 |
| 19/07/2018 | 2.4 |
| 19/07/2018 | 2.5 |
| 19/07/2018 | 2.7 |
| 19/07/2018 | 3.1 |
| 19/07/2018 | 3.6 |
| 19/07/2018 | 3.9 |
| 19/07/2018 | 4.2 |
| 19/07/2018 | 4.3 |
| 19/07/2018 | 4.4 |
| 19/07/2018 | 4.4 |
| 19/07/2018 | 4.4 |
| 19/07/2018 | 4.3 |
| 19/07/2018 | 4.2 |
| 19/07/2018 | 4.2 |
| 19/07/2018 | 4.2 |
| 19/07/2018 | 4.1 |
| 19/07/2018 | 4 |
| 19/07/2018 | 3.8 |
| 19/07/2018 | 3.6 |
| 19/07/2018 | 3.3 |
| 19/07/2018 | 3 |
| 20/07/2018 | 2.7 |
| 20/07/2018 | 2.5 |
| 20/07/2018 | 2.4 |
| 20/07/2018 | 2.4 |
| 20/07/2018 | 2.5 |
| 20/07/2018 | 2.7 |
| 20/07/2018 | 3.1 |
| 20/07/2018 | 3.6 |
| 20/07/2018 | 3.9 |
| 20/07/2018 | 4.2 |
| 20/07/2018 | 4.3 |
| 20/07/2018 | 4.4 |
| 20/07/2018 | 4.4 |
| 20/07/2018 | 4.3 |
| 20/07/2018 | 4.2 |
| 20/07/2018 | 4.1 |
| 20/07/2018 | 4.1 |
| 20/07/2018 | 4 |
| 20/07/2018 | 4 |
| 20/07/2018 | 3.8 |
| 20/07/2018 | 3.6 |
| 20/07/2018 | 3.5 |
| 20/07/2018 | 3.2 |
| 20/07/2018 | 2.9 |
| 21/07/2018 | 2.7 |
| 21/07/2018 | 2.5 |
| 21/07/2018 | 2.4 |
| 21/07/2018 | 2.4 |
| 21/07/2018 | 2.4 |
| 21/07/2018 | 2.4 |
| 21/07/2018 | 2.4 |
| 21/07/2018 | 2.6 |
| 21/07/2018 | 2.9 |
| 21/07/2018 | 3.3 |
| 21/07/2018 | 3.6 |
| 21/07/2018 | 3.7 |
| 21/07/2018 | 3.7 |
| 21/07/2018 | 3.6 |
| 21/07/2018 | 3.5 |
| 21/07/2018 | 3.4 |
| 21/07/2018 | 3.4 |
| 21/07/2018 | 3.4 |
| 21/07/2018 | 3.4 |
| 21/07/2018 | 3.4 |
| 21/07/2018 | 3.3 |
| 21/07/2018 | 3.2 |
| 21/07/2018 | 3 |
| 21/07/2018 | 2.8 |
| 22/07/2018 | 2.6 |
| 22/07/2018 | 2.4 |
| 22/07/2018 | 2.3 |
| 22/07/2018 | 2.3 |
| 22/07/2018 | 2.3 |
| 22/07/2018 | 2.3 |
| 22/07/2018 | 2.2 |
| 22/07/2018 | 2.3 |
| 22/07/2018 | 2.5 |
| 22/07/2018 | 2.8 |
| 22/07/2018 | 3 |
| 22/07/2018 | 3.2 |
| 22/07/2018 | 3.3 |
| 22/07/2018 | 3.2 |
| 22/07/2018 | 3.1 |
| 22/07/2018 | 3.1 |
| 22/07/2018 | 3.1 |
| 22/07/2018 | 3.2 |
| 22/07/2018 | 3.2 |
| 22/07/2018 | 3.1 |
| 22/07/2018 | 3.1 |
| 22/07/2018 | 3.1 |
| 22/07/2018 | 3 |
| 22/07/2018 | 2.8 |
| 23/07/2018 | 2.6 |
| 23/07/2018 | 2.4 |
| 23/07/2018 | 2.3 |
| 23/07/2018 | 2.3 |
| 23/07/2018 | 2.4 |
| 23/07/2018 | 2.6 |
| 23/07/2018 | 3.1 |
| 23/07/2018 | 3.5 |
| 23/07/2018 | 3.9 |
| 23/07/2018 | 4.1 |
| 23/07/2018 | 4.3 |
| 23/07/2018 | 4.4 |
| 23/07/2018 | 4.4 |
| 23/07/2018 | 4.4 |
| 23/07/2018 | 4.3 |
| 23/07/2018 | 4.2 |
| 23/07/2018 | 4.2 |
| 23/07/2018 | 4.2 |
| 23/07/2018 | 4.1 |
| 23/07/2018 | 4 |
| 23/07/2018 | 3.8 |
| 23/07/2018 | 3.6 |
| 23/07/2018 | 3.3 |
| 23/07/2018 | 3 |
| 24/07/2018 | 2.7 |
| 24/07/2018 | 2.5 |
| 24/07/2018 | 2.4 |
| 24/07/2018 | 2.4 |
| 24/07/2018 | 2.5 |
| 24/07/2018 | 2.7 |
| 24/07/2018 | 3.1 |
| 24/07/2018 | 3.6 |
| 24/07/2018 | 4 |
| 24/07/2018 | 4.2 |
| 24/07/2018 | 4.3 |
| 24/07/2018 | 4.4 |
| 24/07/2018 | 4.4 |
| 24/07/2018 | 4.4 |
| 24/07/2018 | 4.3 |
| 24/07/2018 | 4.2 |
| 24/07/2018 | 4.2 |
| 24/07/2018 | 4.2 |
| 24/07/2018 | 4.2 |
| 24/07/2018 | 4.1 |
| 24/07/2018 | 3.8 |
| 24/07/2018 | 3.6 |
| 24/07/2018 | 3.3 |
| 24/07/2018 | 3 |
| 25/07/2018 | 2.7 |
| 25/07/2018 | 2.5 |
| 25/07/2018 | 2.4 |
| 25/07/2018 | 2.4 |
| 25/07/2018 | 2.5 |
| 25/07/2018 | 2.7 |
| 25/07/2018 | 3.1 |
| 25/07/2018 | 3.6 |
| 25/07/2018 | 4 |
| 25/07/2018 | 4.2 |
| 25/07/2018 | 4.4 |
| 25/07/2018 | 4.4 |
| 25/07/2018 | 4.4 |
| 25/07/2018 | 4.4 |
| 25/07/2018 | 4.3 |
| 25/07/2018 | 4.2 |
| 25/07/2018 | 4.2 |
| 25/07/2018 | 4.2 |
| 25/07/2018 | 4.1 |
| 25/07/2018 | 4 |
| 25/07/2018 | 3.8 |
| 25/07/2018 | 3.6 |
| 25/07/2018 | 3.3 |
| 25/07/2018 | 3 |
| 26/07/2018 | 2.7 |
| 26/07/2018 | 2.5 |
| 26/07/2018 | 2.4 |
| 26/07/2018 | 2.4 |
| 26/07/2018 | 2.5 |
| 26/07/2018 | 2.7 |
| 26/07/2018 | 3.1 |
| 26/07/2018 | 3.6 |
| 26/07/2018 | 4 |
| 26/07/2018 | 4.2 |
| 26/07/2018 | 4.3 |
| 26/07/2018 | 4.4 |
| 26/07/2018 | 4.4 |
| 26/07/2018 | 4.4 |
| 26/07/2018 | 4.3 |
| 26/07/2018 | 4.2 |
| 26/07/2018 | 4.2 |
| 26/07/2018 | 4.2 |
| 26/07/2018 | 4.2 |
| 26/07/2018 | 4.1 |
| 26/07/2018 | 3.8 |
| 26/07/2018 | 3.6 |
| 26/07/2018 | 3.3 |
| 26/07/2018 | 3 |
| 27/07/2018 | 2.7 |
| 27/07/2018 | 2.5 |
| 27/07/2018 | 2.4 |
| 27/07/2018 | 2.4 |
| 27/07/2018 | 2.5 |
| 27/07/2018 | 2.7 |
| 27/07/2018 | 3.1 |
| 27/07/2018 | 3.6 |
| 27/07/2018 | 4 |
| 27/07/2018 | 4.2 |
| 27/07/2018 | 4.4 |
| 27/07/2018 | 4.4 |
| 27/07/2018 | 4.4 |
| 27/07/2018 | 4.3 |
| 27/07/2018 | 4.2 |
| 27/07/2018 | 4.1 |
| 27/07/2018 | 4.1 |
| 27/07/2018 | 4.1 |
| 27/07/2018 | 4 |
| 27/07/2018 | 3.9 |
| 27/07/2018 | 3.7 |
| 27/07/2018 | 3.5 |
| 27/07/2018 | 3.2 |
| 27/07/2018 | 2.9 |
| 28/07/2018 | 2.7 |
| 28/07/2018 | 2.5 |
| 28/07/2018 | 2.4 |
| 28/07/2018 | 2.4 |
| 28/07/2018 | 2.4 |
| 28/07/2018 | 2.4 |
| 28/07/2018 | 2.4 |
| 28/07/2018 | 2.6 |
| 28/07/2018 | 2.9 |
| 28/07/2018 | 3.3 |
| 28/07/2018 | 3.6 |
| 28/07/2018 | 3.7 |
| 28/07/2018 | 3.7 |
| 28/07/2018 | 3.6 |
| 28/07/2018 | 3.5 |
| 28/07/2018 | 3.4 |
| 28/07/2018 | 3.4 |
| 28/07/2018 | 3.4 |
| 28/07/2018 | 3.4 |
| 28/07/2018 | 3.4 |
| 28/07/2018 | 3.3 |
| 28/07/2018 | 3.2 |
| 28/07/2018 | 3 |
| 28/07/2018 | 2.8 |
| 29/07/2018 | 2.6 |
| 29/07/2018 | 2.4 |
| 29/07/2018 | 2.3 |
| 29/07/2018 | 2.3 |
| 29/07/2018 | 2.3 |
| 29/07/2018 | 2.3 |
| 29/07/2018 | 2.2 |
| 29/07/2018 | 2.3 |
| 29/07/2018 | 2.6 |
| 29/07/2018 | 2.8 |
| 29/07/2018 | 3.1 |
| 29/07/2018 | 3.2 |
| 29/07/2018 | 3.3 |
| 29/07/2018 | 3.2 |
| 29/07/2018 | 3.1 |
| 29/07/2018 | 3.1 |
| 29/07/2018 | 3.1 |
| 29/07/2018 | 3.2 |
| 29/07/2018 | 3.2 |
| 29/07/2018 | 3.2 |
| 29/07/2018 | 3.1 |
| 29/07/2018 | 3.1 |
| 29/07/2018 | 3 |
| 29/07/2018 | 2.8 |
| 30/07/2018 | 2.6 |
| 30/07/2018 | 2.4 |
| 30/07/2018 | 2.4 |
| 30/07/2018 | 2.3 |
| 30/07/2018 | 2.4 |
| 30/07/2018 | 2.6 |
| 30/07/2018 | 3.1 |
| 30/07/2018 | 3.5 |
| 30/07/2018 | 3.9 |
| 30/07/2018 | 4.1 |
| 30/07/2018 | 4.3 |
| 30/07/2018 | 4.4 |
| 30/07/2018 | 4.4 |
| 30/07/2018 | 4.4 |
| 30/07/2018 | 4.3 |
| 30/07/2018 | 4.2 |
| 30/07/2018 | 4.2 |
| 30/07/2018 | 4.2 |
| 30/07/2018 | 4.2 |
| 30/07/2018 | 4.1 |
| 30/07/2018 | 3.8 |
| 30/07/2018 | 3.6 |
| 30/07/2018 | 3.3 |
| 30/07/2018 | 3 |
| 31/07/2018 | 2.7 |
| 31/07/2018 | 2.5 |
| 31/07/2018 | 2.4 |
| 31/07/2018 | 2.4 |
| 31/07/2018 | 2.5 |
| 31/07/2018 | 2.7 |
| 31/07/2018 | 3.1 |
| 31/07/2018 | 3.6 |
| 31/07/2018 | 4 |
| 31/07/2018 | 4.2 |
| 31/07/2018 | 4.3 |
| 31/07/2018 | 4.4 |
| 31/07/2018 | 4.4 |
| 31/07/2018 | 4.4 |
| 31/07/2018 | 4.3 |
| 31/07/2018 | 4.3 |
| 31/07/2018 | 4.2 |
| 31/07/2018 | 4.2 |
| 31/07/2018 | 4.2 |
| 31/07/2018 | 4.1 |
| 31/07/2018 | 3.9 |
| 31/07/2018 | 3.6 |
| 31/07/2018 | 3.3 |
| 31/07/2018 | 3 |
| 01/08/2018 | 2.7 |
| 01/08/2018 | 2.5 |
| 01/08/2018 | 2.4 |
| 01/08/2018 | 2.4 |
| 01/08/2018 | 2.5 |
| 01/08/2018 | 2.7 |
| 01/08/2018 | 3.1 |
| 01/08/2018 | 3.6 |
| 01/08/2018 | 4 |
| 01/08/2018 | 4.2 |
| 01/08/2018 | 4.4 |
| 01/08/2018 | 4.4 |
| 01/08/2018 | 4.5 |
| 01/08/2018 | 4.4 |
| 01/08/2018 | 4.3 |
| 01/08/2018 | 4.2 |
| 01/08/2018 | 4.2 |
| 01/08/2018 | 4.2 |
| 01/08/2018 | 4.2 |
| 01/08/2018 | 4.1 |
| 01/08/2018 | 3.9 |
| 01/08/2018 | 3.6 |
| 01/08/2018 | 3.3 |
| 01/08/2018 | 3 |
| 02/08/2018 | 2.7 |
| 02/08/2018 | 2.5 |
| 02/08/2018 | 2.4 |
| 02/08/2018 | 2.4 |
| 02/08/2018 | 2.5 |
| 02/08/2018 | 2.7 |
| 02/08/2018 | 3.1 |
| 02/08/2018 | 3.6 |
| 02/08/2018 | 4 |
| 02/08/2018 | 4.2 |
| 02/08/2018 | 4.3 |
| 02/08/2018 | 4.4 |
| 02/08/2018 | 4.4 |
| 02/08/2018 | 4.4 |
| 02/08/2018 | 4.3 |
| 02/08/2018 | 4.2 |
| 02/08/2018 | 4.2 |
| 02/08/2018 | 4.2 |
| 02/08/2018 | 4.2 |
| 02/08/2018 | 4.1 |
| 02/08/2018 | 3.9 |
| 02/08/2018 | 3.6 |
| 02/08/2018 | 3.3 |
| 02/08/2018 | 3 |
| 03/08/2018 | 2.7 |
| 03/08/2018 | 2.5 |
| 03/08/2018 | 2.5 |
| 03/08/2018 | 2.4 |
| 03/08/2018 | 2.5 |
| 03/08/2018 | 2.7 |
| 03/08/2018 | 3.1 |
| 03/08/2018 | 3.6 |
| 03/08/2018 | 4 |
| 03/08/2018 | 4.2 |
| 03/08/2018 | 4.4 |
| 03/08/2018 | 4.4 |
| 03/08/2018 | 4.4 |
| 03/08/2018 | 4.3 |
| 03/08/2018 | 4.2 |
| 03/08/2018 | 4.1 |
| 03/08/2018 | 4.1 |
| 03/08/2018 | 4.1 |
| 03/08/2018 | 4 |
| 03/08/2018 | 3.9 |
| 03/08/2018 | 3.7 |
| 03/08/2018 | 3.5 |
| 03/08/2018 | 3.2 |
| 03/08/2018 | 2.9 |
| 04/08/2018 | 2.7 |
| 04/08/2018 | 2.5 |
| 04/08/2018 | 2.4 |
| 04/08/2018 | 2.4 |
| 04/08/2018 | 2.4 |
| 04/08/2018 | 2.4 |
| 04/08/2018 | 2.4 |
| 04/08/2018 | 2.6 |
| 04/08/2018 | 2.9 |
| 04/08/2018 | 3.3 |
| 04/08/2018 | 3.6 |
| 04/08/2018 | 3.7 |
| 04/08/2018 | 3.7 |
| 04/08/2018 | 3.6 |
| 04/08/2018 | 3.5 |
| 04/08/2018 | 3.4 |
| 04/08/2018 | 3.4 |
| 04/08/2018 | 3.4 |
| 04/08/2018 | 3.5 |
| 04/08/2018 | 3.4 |
| 04/08/2018 | 3.3 |
| 04/08/2018 | 3.2 |
| 04/08/2018 | 3 |
| 04/08/2018 | 2.8 |
| 05/08/2018 | 2.6 |
| 05/08/2018 | 2.4 |
| 05/08/2018 | 2.3 |
| 05/08/2018 | 2.3 |
| 05/08/2018 | 2.3 |
| 05/08/2018 | 2.3 |
| 05/08/2018 | 2.2 |
| 05/08/2018 | 2.3 |
| 05/08/2018 | 2.6 |
| 05/08/2018 | 2.8 |
| 05/08/2018 | 3.1 |
| 05/08/2018 | 3.2 |
| 05/08/2018 | 3.3 |
| 05/08/2018 | 3.2 |
| 05/08/2018 | 3.1 |
| 05/08/2018 | 3.1 |
| 05/08/2018 | 3.1 |
| 05/08/2018 | 3.2 |
| 05/08/2018 | 3.2 |
| 05/08/2018 | 3.2 |
| 05/08/2018 | 3.2 |
| 05/08/2018 | 3.1 |
| 05/08/2018 | 3 |
| 05/08/2018 | 2.8 |
| 06/08/2018 | 2.6 |
| 06/08/2018 | 2.4 |
| 06/08/2018 | 2.4 |
| 06/08/2018 | 2.3 |
| 06/08/2018 | 2.4 |
| 06/08/2018 | 2.7 |
| 06/08/2018 | 3.1 |
| 06/08/2018 | 3.6 |
| 06/08/2018 | 3.9 |
| 06/08/2018 | 4.2 |
| 06/08/2018 | 4.3 |
| 06/08/2018 | 4.4 |
| 06/08/2018 | 4.4 |
| 06/08/2018 | 4.4 |
| 06/08/2018 | 4.3 |
| 06/08/2018 | 4.2 |
| 06/08/2018 | 4.2 |
| 06/08/2018 | 4.2 |
| 06/08/2018 | 4.2 |
| 06/08/2018 | 4.1 |
| 06/08/2018 | 3.9 |
| 06/08/2018 | 3.6 |
| 06/08/2018 | 3.3 |
| 06/08/2018 | 3 |
| 07/08/2018 | 2.7 |
| 07/08/2018 | 2.5 |
| 07/08/2018 | 2.4 |
| 07/08/2018 | 2.4 |
| 07/08/2018 | 2.5 |
| 07/08/2018 | 2.7 |
| 07/08/2018 | 3.2 |
| 07/08/2018 | 3.6 |
| 07/08/2018 | 4 |
| 07/08/2018 | 4.2 |
| 07/08/2018 | 4.4 |
| 07/08/2018 | 4.4 |
| 07/08/2018 | 4.5 |
| 07/08/2018 | 4.4 |
| 07/08/2018 | 4.3 |
| 07/08/2018 | 4.3 |
| 07/08/2018 | 4.2 |
| 07/08/2018 | 4.3 |
| 07/08/2018 | 4.2 |
| 07/08/2018 | 4.2 |
| 07/08/2018 | 3.9 |
| 07/08/2018 | 3.7 |
| 07/08/2018 | 3.3 |
| 07/08/2018 | 3 |
| 08/08/2018 | 2.7 |
| 08/08/2018 | 2.5 |
| 08/08/2018 | 2.4 |
| 08/08/2018 | 2.4 |
| 08/08/2018 | 2.5 |
| 08/08/2018 | 2.7 |
| 08/08/2018 | 3.2 |
| 08/08/2018 | 3.6 |
| 08/08/2018 | 4 |
| 08/08/2018 | 4.2 |
| 08/08/2018 | 4.4 |
| 08/08/2018 | 4.4 |
| 08/08/2018 | 4.5 |
| 08/08/2018 | 4.4 |
| 08/08/2018 | 4.3 |
| 08/08/2018 | 4.2 |
| 08/08/2018 | 4.2 |
| 08/08/2018 | 4.2 |
| 08/08/2018 | 4.2 |
| 08/08/2018 | 4.1 |
| 08/08/2018 | 3.9 |
| 08/08/2018 | 3.6 |
| 08/08/2018 | 3.3 |
| 08/08/2018 | 3 |
| 09/08/2018 | 2.7 |
| 09/08/2018 | 2.5 |
| 09/08/2018 | 2.4 |
| 09/08/2018 | 2.4 |
| 09/08/2018 | 2.5 |
| 09/08/2018 | 2.7 |
| 09/08/2018 | 3.2 |
| 09/08/2018 | 3.6 |
| 09/08/2018 | 4 |
| 09/08/2018 | 4.2 |
| 09/08/2018 | 4.4 |
| 09/08/2018 | 4.4 |
| 09/08/2018 | 4.5 |
| 09/08/2018 | 4.4 |
| 09/08/2018 | 4.3 |
| 09/08/2018 | 4.2 |
| 09/08/2018 | 4.2 |
| 09/08/2018 | 4.2 |
| 09/08/2018 | 4.2 |
| 09/08/2018 | 4.2 |
| 09/08/2018 | 3.9 |
| 09/08/2018 | 3.7 |
| 09/08/2018 | 3.3 |
| 09/08/2018 | 3 |
| 10/08/2018 | 2.7 |
| 10/08/2018 | 2.5 |
| 10/08/2018 | 2.5 |
| 10/08/2018 | 2.4 |
| 10/08/2018 | 2.5 |
| 10/08/2018 | 2.7 |
| 10/08/2018 | 3.2 |
| 10/08/2018 | 3.6 |
| 10/08/2018 | 4 |
| 10/08/2018 | 4.2 |
| 10/08/2018 | 4.4 |
| 10/08/2018 | 4.4 |
| 10/08/2018 | 4.4 |
| 10/08/2018 | 4.3 |
| 10/08/2018 | 4.2 |
| 10/08/2018 | 4.1 |
| 10/08/2018 | 4.1 |
| 10/08/2018 | 4.1 |
| 10/08/2018 | 4 |
| 10/08/2018 | 4 |
| 10/08/2018 | 3.7 |
| 10/08/2018 | 3.5 |
| 10/08/2018 | 3.2 |
| 10/08/2018 | 2.9 |
| 11/08/2018 | 2.7 |
| 11/08/2018 | 2.5 |
| 11/08/2018 | 2.4 |
| 11/08/2018 | 2.4 |
| 11/08/2018 | 2.4 |
| 11/08/2018 | 2.4 |
| 11/08/2018 | 2.4 |
| 11/08/2018 | 2.6 |
| 11/08/2018 | 3 |
| 11/08/2018 | 3.3 |
| 11/08/2018 | 3.6 |
| 11/08/2018 | 3.7 |
| 11/08/2018 | 3.7 |
| 11/08/2018 | 3.6 |
| 11/08/2018 | 3.5 |
| 11/08/2018 | 3.4 |
| 11/08/2018 | 3.4 |
| 11/08/2018 | 3.4 |
| 11/08/2018 | 3.5 |
| 11/08/2018 | 3.5 |
| 11/08/2018 | 3.4 |
| 11/08/2018 | 3.2 |
| 11/08/2018 | 3 |
| 11/08/2018 | 2.8 |
| 12/08/2018 | 2.6 |
| 12/08/2018 | 2.4 |
| 12/08/2018 | 2.4 |
| 12/08/2018 | 2.3 |
| 12/08/2018 | 2.3 |
| 12/08/2018 | 2.3 |
| 12/08/2018 | 2.3 |
| 12/08/2018 | 2.3 |
| 12/08/2018 | 2.6 |
| 12/08/2018 | 2.9 |
| 12/08/2018 | 3.1 |
| 12/08/2018 | 3.2 |
| 12/08/2018 | 3.3 |
| 12/08/2018 | 3.2 |
| 12/08/2018 | 3.1 |
| 12/08/2018 | 3.1 |
| 12/08/2018 | 3.1 |
| 12/08/2018 | 3.2 |
| 12/08/2018 | 3.3 |
| 12/08/2018 | 3.3 |
| 12/08/2018 | 3.2 |
| 12/08/2018 | 3.2 |
| 12/08/2018 | 3 |
| 12/08/2018 | 2.8 |
| 13/08/2018 | 2.6 |
| 13/08/2018 | 2.4 |
| 13/08/2018 | 2.4 |
| 13/08/2018 | 2.3 |
| 13/08/2018 | 2.4 |
| 13/08/2018 | 2.7 |
| 13/08/2018 | 3.1 |
| 13/08/2018 | 3.6 |
| 13/08/2018 | 3.9 |
| 13/08/2018 | 4.2 |
| 13/08/2018 | 4.3 |
| 13/08/2018 | 4.4 |
| 13/08/2018 | 4.4 |
| 13/08/2018 | 4.4 |
| 13/08/2018 | 4.3 |
| 13/08/2018 | 4.2 |
| 13/08/2018 | 4.2 |
| 13/08/2018 | 4.2 |
| 13/08/2018 | 4.2 |
| 13/08/2018 | 4.2 |
| 13/08/2018 | 3.9 |
| 13/08/2018 | 3.7 |
| 13/08/2018 | 3.3 |
| 13/08/2018 | 3 |
| 14/08/2018 | 2.7 |
| 14/08/2018 | 2.5 |
| 14/08/2018 | 2.4 |
| 14/08/2018 | 2.4 |
| 14/08/2018 | 2.5 |
| 14/08/2018 | 2.7 |
| 14/08/2018 | 3.2 |
| 14/08/2018 | 3.6 |
| 14/08/2018 | 4 |
| 14/08/2018 | 4.2 |
| 14/08/2018 | 4.4 |
| 14/08/2018 | 4.4 |
| 14/08/2018 | 4.5 |
| 14/08/2018 | 4.4 |
| 14/08/2018 | 4.3 |
| 14/08/2018 | 4.3 |
| 14/08/2018 | 4.2 |
| 14/08/2018 | 4.3 |
| 14/08/2018 | 4.3 |
| 14/08/2018 | 4.2 |
| 14/08/2018 | 4 |
| 14/08/2018 | 3.7 |
| 14/08/2018 | 3.3 |
| 14/08/2018 | 3 |
| 15/08/2018 | 2.7 |
| 15/08/2018 | 2.5 |
| 15/08/2018 | 2.4 |
| 15/08/2018 | 2.4 |
| 15/08/2018 | 2.5 |
| 15/08/2018 | 2.7 |
| 15/08/2018 | 3.2 |
| 15/08/2018 | 3.6 |
| 15/08/2018 | 4 |
| 15/08/2018 | 4.2 |
| 15/08/2018 | 4.4 |
| 15/08/2018 | 4.4 |
| 15/08/2018 | 4.5 |
| 15/08/2018 | 4.4 |
| 15/08/2018 | 4.3 |
| 15/08/2018 | 4.2 |
| 15/08/2018 | 4.2 |
| 15/08/2018 | 4.2 |
| 15/08/2018 | 4.2 |
| 15/08/2018 | 4.2 |
| 15/08/2018 | 3.9 |
| 15/08/2018 | 3.7 |
| 15/08/2018 | 3.3 |
| 15/08/2018 | 3 |
| 16/08/2018 | 2.7 |
| 16/08/2018 | 2.5 |
| 16/08/2018 | 2.5 |
| 16/08/2018 | 2.4 |
| 16/08/2018 | 2.5 |
| 16/08/2018 | 2.7 |
| 16/08/2018 | 3.2 |
| 16/08/2018 | 3.7 |
| 16/08/2018 | 4 |
| 16/08/2018 | 4.2 |
| 16/08/2018 | 4.4 |
| 16/08/2018 | 4.4 |
| 16/08/2018 | 4.5 |
| 16/08/2018 | 4.4 |
| 16/08/2018 | 4.3 |
| 16/08/2018 | 4.2 |
| 16/08/2018 | 4.2 |
| 16/08/2018 | 4.2 |
| 16/08/2018 | 4.3 |
| 16/08/2018 | 4.2 |
| 16/08/2018 | 4 |
| 16/08/2018 | 3.7 |
| 16/08/2018 | 3.3 |
| 16/08/2018 | 3 |
| 17/08/2018 | 2.7 |
| 17/08/2018 | 2.5 |
| 17/08/2018 | 2.5 |
| 17/08/2018 | 2.4 |
| 17/08/2018 | 2.5 |
| 17/08/2018 | 2.7 |
| 17/08/2018 | 3.2 |
| 17/08/2018 | 3.6 |
| 17/08/2018 | 4 |
| 17/08/2018 | 4.2 |
| 17/08/2018 | 4.4 |
| 17/08/2018 | 4.4 |
| 17/08/2018 | 4.4 |
| 17/08/2018 | 4.3 |
| 17/08/2018 | 4.2 |
| 17/08/2018 | 4.1 |
| 17/08/2018 | 4.1 |
| 17/08/2018 | 4.1 |
| 17/08/2018 | 4.1 |
| 17/08/2018 | 4 |
| 17/08/2018 | 3.8 |
| 17/08/2018 | 3.5 |
| 17/08/2018 | 3.2 |
| 17/08/2018 | 2.9 |
| 18/08/2018 | 2.7 |
| 18/08/2018 | 2.5 |
| 18/08/2018 | 2.4 |
| 18/08/2018 | 2.4 |
| 18/08/2018 | 2.4 |
| 18/08/2018 | 2.4 |
| 18/08/2018 | 2.5 |
| 18/08/2018 | 2.7 |
| 18/08/2018 | 3.1 |
| 18/08/2018 | 3.4 |
| 18/08/2018 | 3.7 |
| 18/08/2018 | 3.7 |
| 18/08/2018 | 3.8 |
| 18/08/2018 | 3.7 |
| 18/08/2018 | 3.6 |
| 18/08/2018 | 3.5 |
| 18/08/2018 | 3.5 |
| 18/08/2018 | 3.5 |
| 18/08/2018 | 3.6 |
| 18/08/2018 | 3.7 |
| 18/08/2018 | 3.5 |
| 18/08/2018 | 3.3 |
| 18/08/2018 | 3 |
| 18/08/2018 | 2.8 |
| 19/08/2018 | 2.6 |
| 19/08/2018 | 2.4 |
| 19/08/2018 | 2.3 |
| 19/08/2018 | 2.3 |
| 19/08/2018 | 2.3 |
| 19/08/2018 | 2.3 |
| 19/08/2018 | 2.3 |
| 19/08/2018 | 2.4 |
| 19/08/2018 | 2.7 |
| 19/08/2018 | 2.9 |
| 19/08/2018 | 3.1 |
| 19/08/2018 | 3.3 |
| 19/08/2018 | 3.4 |
| 19/08/2018 | 3.3 |
| 19/08/2018 | 3.2 |
| 19/08/2018 | 3.2 |
| 19/08/2018 | 3.2 |
| 19/08/2018 | 3.3 |
| 19/08/2018 | 3.4 |
| 19/08/2018 | 3.4 |
| 19/08/2018 | 3.3 |
| 19/08/2018 | 3.2 |
| 19/08/2018 | 3 |
| 19/08/2018 | 2.8 |
| 20/08/2018 | 2.6 |
| 20/08/2018 | 2.4 |
| 20/08/2018 | 2.3 |
| 20/08/2018 | 2.3 |
| 20/08/2018 | 2.4 |
| 20/08/2018 | 2.7 |
| 20/08/2018 | 3.2 |
| 20/08/2018 | 3.7 |
| 20/08/2018 | 4.1 |
| 20/08/2018 | 4.3 |
| 20/08/2018 | 4.4 |
| 20/08/2018 | 4.5 |
| 20/08/2018 | 4.5 |
| 20/08/2018 | 4.5 |
| 20/08/2018 | 4.4 |
| 20/08/2018 | 4.3 |
| 20/08/2018 | 4.3 |
| 20/08/2018 | 4.3 |
| 20/08/2018 | 4.4 |
| 20/08/2018 | 4.4 |
| 20/08/2018 | 4.1 |
| 20/08/2018 | 3.7 |
| 20/08/2018 | 3.3 |
| 20/08/2018 | 3 |
| 21/08/2018 | 2.7 |
| 21/08/2018 | 2.5 |
| 21/08/2018 | 2.4 |
| 21/08/2018 | 2.4 |
| 21/08/2018 | 2.5 |
| 21/08/2018 | 2.8 |
| 21/08/2018 | 3.3 |
| 21/08/2018 | 3.8 |
| 21/08/2018 | 4.2 |
| 21/08/2018 | 4.3 |
| 21/08/2018 | 4.5 |
| 21/08/2018 | 4.5 |
| 21/08/2018 | 4.5 |
| 21/08/2018 | 4.5 |
| 21/08/2018 | 4.4 |
| 21/08/2018 | 4.3 |
| 21/08/2018 | 4.3 |
| 21/08/2018 | 4.4 |
| 21/08/2018 | 4.4 |
| 21/08/2018 | 4.4 |
| 21/08/2018 | 4.1 |
| 21/08/2018 | 3.7 |
| 21/08/2018 | 3.3 |
| 21/08/2018 | 3 |
| 22/08/2018 | 2.7 |
| 22/08/2018 | 2.5 |
| 22/08/2018 | 2.4 |
| 22/08/2018 | 2.4 |
| 22/08/2018 | 2.5 |
| 22/08/2018 | 2.8 |
| 22/08/2018 | 3.3 |
| 22/08/2018 | 3.8 |
| 22/08/2018 | 4.2 |
| 22/08/2018 | 4.4 |
| 22/08/2018 | 4.5 |
| 22/08/2018 | 4.5 |
| 22/08/2018 | 4.5 |
| 22/08/2018 | 4.5 |
| 22/08/2018 | 4.4 |
| 22/08/2018 | 4.3 |
| 22/08/2018 | 4.3 |
| 22/08/2018 | 4.3 |
| 22/08/2018 | 4.4 |
| 22/08/2018 | 4.4 |
| 22/08/2018 | 4.1 |
| 22/08/2018 | 3.7 |
| 22/08/2018 | 3.3 |
| 22/08/2018 | 3 |
| 23/08/2018 | 2.7 |
| 23/08/2018 | 2.5 |
| 23/08/2018 | 2.4 |
| 23/08/2018 | 2.4 |
| 23/08/2018 | 2.5 |
| 23/08/2018 | 2.8 |
| 23/08/2018 | 3.3 |
| 23/08/2018 | 3.8 |
| 23/08/2018 | 4.2 |
| 23/08/2018 | 4.3 |
| 23/08/2018 | 4.5 |
| 23/08/2018 | 4.5 |
| 23/08/2018 | 4.5 |
| 23/08/2018 | 4.5 |
| 23/08/2018 | 4.4 |
| 23/08/2018 | 4.3 |
| 23/08/2018 | 4.3 |
| 23/08/2018 | 4.3 |
| 23/08/2018 | 4.4 |
| 23/08/2018 | 4.4 |
| 23/08/2018 | 4.1 |
| 23/08/2018 | 3.7 |
| 23/08/2018 | 3.3 |
| 23/08/2018 | 3 |
| 24/08/2018 | 2.7 |
| 24/08/2018 | 2.5 |
| 24/08/2018 | 2.4 |
| 24/08/2018 | 2.4 |
| 24/08/2018 | 2.5 |
| 24/08/2018 | 2.8 |
| 24/08/2018 | 3.3 |
| 24/08/2018 | 3.8 |
| 24/08/2018 | 4.2 |
| 24/08/2018 | 4.3 |
| 24/08/2018 | 4.5 |
| 24/08/2018 | 4.5 |
| 24/08/2018 | 4.5 |
| 24/08/2018 | 4.4 |
| 24/08/2018 | 4.3 |
| 24/08/2018 | 4.2 |
| 24/08/2018 | 4.2 |
| 24/08/2018 | 4.2 |
| 24/08/2018 | 4.2 |
| 24/08/2018 | 4.2 |
| 24/08/2018 | 3.9 |
| 24/08/2018 | 3.6 |
| 24/08/2018 | 3.2 |
| 24/08/2018 | 2.9 |
| 25/08/2018 | 2.7 |
| 25/08/2018 | 2.5 |
| 25/08/2018 | 2.4 |
| 25/08/2018 | 2.4 |
| 25/08/2018 | 2.4 |
| 25/08/2018 | 2.4 |
| 25/08/2018 | 2.6 |
| 25/08/2018 | 2.8 |
| 25/08/2018 | 3.1 |
| 25/08/2018 | 3.4 |
| 25/08/2018 | 3.7 |
| 25/08/2018 | 3.8 |
| 25/08/2018 | 3.8 |
| 25/08/2018 | 3.7 |
| 25/08/2018 | 3.6 |
| 25/08/2018 | 3.5 |
| 25/08/2018 | 3.5 |
| 25/08/2018 | 3.5 |
| 25/08/2018 | 3.6 |
| 25/08/2018 | 3.7 |
| 25/08/2018 | 3.5 |
| 25/08/2018 | 3.3 |
| 25/08/2018 | 3 |
| 25/08/2018 | 2.8 |
| 26/08/2018 | 2.6 |
| 26/08/2018 | 2.4 |
| 26/08/2018 | 2.3 |
| 26/08/2018 | 2.3 |
| 26/08/2018 | 2.3 |
| 26/08/2018 | 2.3 |
| 26/08/2018 | 2.4 |
| 26/08/2018 | 2.5 |
| 26/08/2018 | 2.7 |
| 26/08/2018 | 3 |
| 26/08/2018 | 3.1 |
| 26/08/2018 | 3.3 |
| 26/08/2018 | 3.4 |
| 26/08/2018 | 3.3 |
| 26/08/2018 | 3.2 |
| 26/08/2018 | 3.2 |
| 26/08/2018 | 3.2 |
| 26/08/2018 | 3.3 |
| 26/08/2018 | 3.4 |
| 26/08/2018 | 3.5 |
| 26/08/2018 | 3.4 |
| 26/08/2018 | 3.2 |
| 26/08/2018 | 3 |
| 26/08/2018 | 2.8 |
| 27/08/2018 | 2.6 |
| 27/08/2018 | 2.4 |
| 27/08/2018 | 2.3 |
| 27/08/2018 | 2.3 |
| 27/08/2018 | 2.4 |
| 27/08/2018 | 2.7 |
| 27/08/2018 | 3.3 |
| 27/08/2018 | 3.8 |
| 27/08/2018 | 4.1 |
| 27/08/2018 | 4.3 |
| 27/08/2018 | 4.4 |
| 27/08/2018 | 4.5 |
| 27/08/2018 | 4.5 |
| 27/08/2018 | 4.5 |
| 27/08/2018 | 4.4 |
| 27/08/2018 | 4.3 |
| 27/08/2018 | 4.3 |
| 27/08/2018 | 4.3 |
| 27/08/2018 | 4.4 |
| 27/08/2018 | 4.4 |
| 27/08/2018 | 4.1 |
| 27/08/2018 | 3.7 |
| 27/08/2018 | 3.3 |
| 27/08/2018 | 3 |
| 28/08/2018 | 2.7 |
| 28/08/2018 | 2.5 |
| 28/08/2018 | 2.4 |
| 28/08/2018 | 2.4 |
| 28/08/2018 | 2.5 |
| 28/08/2018 | 2.8 |
| 28/08/2018 | 3.3 |
| 28/08/2018 | 3.8 |
| 28/08/2018 | 4.2 |
| 28/08/2018 | 4.4 |
| 28/08/2018 | 4.5 |
| 28/08/2018 | 4.5 |
| 28/08/2018 | 4.5 |
| 28/08/2018 | 4.5 |
| 28/08/2018 | 4.4 |
| 28/08/2018 | 4.3 |
| 28/08/2018 | 4.3 |
| 28/08/2018 | 4.4 |
| 28/08/2018 | 4.5 |
| 28/08/2018 | 4.5 |
| 28/08/2018 | 4.2 |
| 28/08/2018 | 3.8 |
| 28/08/2018 | 3.3 |
| 28/08/2018 | 3 |
| 29/08/2018 | 2.7 |
| 29/08/2018 | 2.5 |
| 29/08/2018 | 2.4 |
| 29/08/2018 | 2.4 |
| 29/08/2018 | 2.5 |
| 29/08/2018 | 2.8 |
| 29/08/2018 | 3.3 |
| 29/08/2018 | 3.8 |
| 29/08/2018 | 4.2 |
| 29/08/2018 | 4.4 |
| 29/08/2018 | 4.5 |
| 29/08/2018 | 4.5 |
| 29/08/2018 | 4.5 |
| 29/08/2018 | 4.5 |
| 29/08/2018 | 4.4 |
| 29/08/2018 | 4.3 |
| 29/08/2018 | 4.3 |
| 29/08/2018 | 4.3 |
| 29/08/2018 | 4.4 |
| 29/08/2018 | 4.5 |
| 29/08/2018 | 4.1 |
| 29/08/2018 | 3.7 |
| 29/08/2018 | 3.3 |
| 29/08/2018 | 3 |
| 30/08/2018 | 2.7 |
| 30/08/2018 | 2.5 |
| 30/08/2018 | 2.4 |
| 30/08/2018 | 2.4 |
| 30/08/2018 | 2.5 |
| 30/08/2018 | 2.8 |
| 30/08/2018 | 3.3 |
| 30/08/2018 | 3.8 |
| 30/08/2018 | 4.2 |
| 30/08/2018 | 4.4 |
| 30/08/2018 | 4.5 |
| 30/08/2018 | 4.5 |
| 30/08/2018 | 4.5 |
| 30/08/2018 | 4.5 |
| 30/08/2018 | 4.4 |
| 30/08/2018 | 4.3 |
| 30/08/2018 | 4.3 |
| 30/08/2018 | 4.4 |
| 30/08/2018 | 4.4 |
| 30/08/2018 | 4.5 |
| 30/08/2018 | 4.2 |
| 30/08/2018 | 3.8 |
| 30/08/2018 | 3.3 |
| 30/08/2018 | 3 |
| 31/08/2018 | 2.7 |
| 31/08/2018 | 2.5 |
| 31/08/2018 | 2.4 |
| 31/08/2018 | 2.4 |
| 31/08/2018 | 2.5 |
| 31/08/2018 | 2.8 |
| 31/08/2018 | 3.3 |
| 31/08/2018 | 3.8 |
| 31/08/2018 | 4.2 |
| 31/08/2018 | 4.4 |
| 31/08/2018 | 4.5 |
| 31/08/2018 | 4.5 |
| 31/08/2018 | 4.5 |
| 31/08/2018 | 4.4 |
| 31/08/2018 | 4.3 |
| 31/08/2018 | 4.2 |
| 31/08/2018 | 4.2 |
| 31/08/2018 | 4.2 |
| 31/08/2018 | 4.3 |
| 31/08/2018 | 4.3 |
| 31/08/2018 | 4 |
| 31/08/2018 | 3.6 |
| 31/08/2018 | 3.2 |
| 31/08/2018 | 2.9 |
| 01/09/2018 | 2.7 |
| 01/09/2018 | 2.5 |
| 01/09/2018 | 2.4 |
| 01/09/2018 | 2.4 |
| 01/09/2018 | 2.4 |
| 01/09/2018 | 2.4 |
| 01/09/2018 | 2.6 |
| 01/09/2018 | 2.8 |
| 01/09/2018 | 3.1 |
| 01/09/2018 | 3.4 |
| 01/09/2018 | 3.7 |
| 01/09/2018 | 3.8 |
| 01/09/2018 | 3.8 |
| 01/09/2018 | 3.7 |
| 01/09/2018 | 3.6 |
| 01/09/2018 | 3.5 |
| 01/09/2018 | 3.5 |
| 01/09/2018 | 3.5 |
| 01/09/2018 | 3.7 |
| 01/09/2018 | 3.8 |
| 01/09/2018 | 3.6 |
| 01/09/2018 | 3.3 |
| 01/09/2018 | 3 |
| 01/09/2018 | 2.8 |
| 02/09/2018 | 2.6 |
| 02/09/2018 | 2.4 |
| 02/09/2018 | 2.3 |
| 02/09/2018 | 2.3 |
| 02/09/2018 | 2.3 |
| 02/09/2018 | 2.3 |
| 02/09/2018 | 2.4 |
| 02/09/2018 | 2.5 |
| 02/09/2018 | 2.7 |
| 02/09/2018 | 3 |
| 02/09/2018 | 3.2 |
| 02/09/2018 | 3.3 |
| 02/09/2018 | 3.4 |
| 02/09/2018 | 3.3 |
| 02/09/2018 | 3.2 |
| 02/09/2018 | 3.2 |
| 02/09/2018 | 3.2 |
| 02/09/2018 | 3.3 |
| 02/09/2018 | 3.4 |
| 02/09/2018 | 3.5 |
| 02/09/2018 | 3.4 |
| 02/09/2018 | 3.2 |
| 02/09/2018 | 3 |
| 02/09/2018 | 2.8 |
| 03/09/2018 | 2.6 |
| 03/09/2018 | 2.4 |
| 03/09/2018 | 2.4 |
| 03/09/2018 | 2.3 |
| 03/09/2018 | 2.5 |
| 03/09/2018 | 2.7 |
| 03/09/2018 | 3.3 |
| 03/09/2018 | 3.8 |
| 03/09/2018 | 4.1 |
| 03/09/2018 | 4.3 |
| 03/09/2018 | 4.5 |
| 03/09/2018 | 4.5 |
| 03/09/2018 | 4.5 |
| 03/09/2018 | 4.5 |
| 03/09/2018 | 4.4 |
| 03/09/2018 | 4.3 |
| 03/09/2018 | 4.3 |
| 03/09/2018 | 4.3 |
| 03/09/2018 | 4.4 |
| 03/09/2018 | 4.5 |
| 03/09/2018 | 4.2 |
| 03/09/2018 | 3.7 |
| 03/09/2018 | 3.3 |
| 03/09/2018 | 3 |
| 04/09/2018 | 2.7 |
| 04/09/2018 | 2.5 |
| 04/09/2018 | 2.4 |
| 04/09/2018 | 2.4 |
| 04/09/2018 | 2.5 |
| 04/09/2018 | 2.8 |
| 04/09/2018 | 3.3 |
| 04/09/2018 | 3.8 |
| 04/09/2018 | 4.2 |
| 04/09/2018 | 4.4 |
| 04/09/2018 | 4.5 |
| 04/09/2018 | 4.5 |
| 04/09/2018 | 4.5 |
| 04/09/2018 | 4.5 |
| 04/09/2018 | 4.4 |
| 04/09/2018 | 4.3 |
| 04/09/2018 | 4.3 |
| 04/09/2018 | 4.4 |
| 04/09/2018 | 4.5 |
| 04/09/2018 | 4.5 |
| 04/09/2018 | 4.2 |
| 04/09/2018 | 3.8 |
| 04/09/2018 | 3.3 |
| 04/09/2018 | 3 |
| 05/09/2018 | 2.7 |
| 05/09/2018 | 2.5 |
| 05/09/2018 | 2.4 |
| 05/09/2018 | 2.4 |
| 05/09/2018 | 2.5 |
| 05/09/2018 | 2.8 |
| 05/09/2018 | 3.3 |
| 05/09/2018 | 3.9 |
| 05/09/2018 | 4.2 |
| 05/09/2018 | 4.4 |
| 05/09/2018 | 4.5 |
| 05/09/2018 | 4.5 |
| 05/09/2018 | 4.5 |
| 05/09/2018 | 4.5 |
| 05/09/2018 | 4.4 |
| 05/09/2018 | 4.3 |
| 05/09/2018 | 4.3 |
| 05/09/2018 | 4.4 |
| 05/09/2018 | 4.5 |
| 05/09/2018 | 4.5 |
| 05/09/2018 | 4.2 |
| 05/09/2018 | 3.8 |
| 05/09/2018 | 3.3 |
| 05/09/2018 | 3 |
| 06/09/2018 | 2.7 |
| 06/09/2018 | 2.5 |
| 06/09/2018 | 2.4 |
| 06/09/2018 | 2.4 |
| 06/09/2018 | 2.5 |
| 06/09/2018 | 2.8 |
| 06/09/2018 | 3.4 |
| 06/09/2018 | 3.9 |
| 06/09/2018 | 4.2 |
| 06/09/2018 | 4.4 |
| 06/09/2018 | 4.5 |
| 06/09/2018 | 4.5 |
| 06/09/2018 | 4.5 |
| 06/09/2018 | 4.5 |
| 06/09/2018 | 4.4 |
| 06/09/2018 | 4.3 |
| 06/09/2018 | 4.3 |
| 06/09/2018 | 4.4 |
| 06/09/2018 | 4.5 |
| 06/09/2018 | 4.5 |
| 06/09/2018 | 4.2 |
| 06/09/2018 | 3.8 |
| 06/09/2018 | 3.3 |
| 06/09/2018 | 3 |
| 07/09/2018 | 2.7 |
| 07/09/2018 | 2.5 |
| 07/09/2018 | 2.5 |
| 07/09/2018 | 2.4 |
| 07/09/2018 | 2.5 |
| 07/09/2018 | 2.8 |
| 07/09/2018 | 3.3 |
| 07/09/2018 | 3.8 |
| 07/09/2018 | 4.2 |
| 07/09/2018 | 4.4 |
| 07/09/2018 | 4.5 |
| 07/09/2018 | 4.5 |
| 07/09/2018 | 4.5 |
| 07/09/2018 | 4.4 |
| 07/09/2018 | 4.3 |
| 07/09/2018 | 4.2 |
| 07/09/2018 | 4.2 |
| 07/09/2018 | 4.2 |
| 07/09/2018 | 4.3 |
| 07/09/2018 | 4.3 |
| 07/09/2018 | 4 |
| 07/09/2018 | 3.6 |
| 07/09/2018 | 3.2 |
| 07/09/2018 | 2.9 |
| 08/09/2018 | 2.7 |
| 08/09/2018 | 2.5 |
| 08/09/2018 | 2.4 |
| 08/09/2018 | 2.4 |
| 08/09/2018 | 2.4 |
| 08/09/2018 | 2.5 |
| 08/09/2018 | 2.6 |
| 08/09/2018 | 2.8 |
| 08/09/2018 | 3.1 |
| 08/09/2018 | 3.5 |
| 08/09/2018 | 3.7 |
| 08/09/2018 | 3.8 |
| 08/09/2018 | 3.8 |
| 08/09/2018 | 3.7 |
| 08/09/2018 | 3.6 |
| 08/09/2018 | 3.5 |
| 08/09/2018 | 3.5 |
| 08/09/2018 | 3.6 |
| 08/09/2018 | 3.7 |
| 08/09/2018 | 3.8 |
| 08/09/2018 | 3.6 |
| 08/09/2018 | 3.3 |
| 08/09/2018 | 3 |
| 08/09/2018 | 2.8 |
| 09/09/2018 | 2.6 |
| 09/09/2018 | 2.4 |
| 09/09/2018 | 2.3 |
| 09/09/2018 | 2.3 |
| 09/09/2018 | 2.3 |
| 09/09/2018 | 2.3 |
| 09/09/2018 | 2.4 |
| 09/09/2018 | 2.5 |
| 09/09/2018 | 2.7 |
| 09/09/2018 | 3 |
| 09/09/2018 | 3.2 |
| 09/09/2018 | 3.3 |
| 09/09/2018 | 3.4 |
| 09/09/2018 | 3.3 |
| 09/09/2018 | 3.2 |
| 09/09/2018 | 3.2 |
| 09/09/2018 | 3.2 |
| 09/09/2018 | 3.3 |
| 09/09/2018 | 3.5 |
| 09/09/2018 | 3.6 |
| 09/09/2018 | 3.5 |
| 09/09/2018 | 3.2 |
| 09/09/2018 | 3 |
| 09/09/2018 | 2.8 |
| 10/09/2018 | 2.6 |
| 10/09/2018 | 2.4 |
| 10/09/2018 | 2.4 |
| 10/09/2018 | 2.3 |
| 10/09/2018 | 2.5 |
| 10/09/2018 | 2.7 |
| 10/09/2018 | 3.3 |
| 10/09/2018 | 3.8 |
| 10/09/2018 | 4.1 |
| 10/09/2018 | 4.3 |
| 10/09/2018 | 4.5 |
| 10/09/2018 | 4.5 |
| 10/09/2018 | 4.5 |
| 10/09/2018 | 4.5 |
| 10/09/2018 | 4.4 |
| 10/09/2018 | 4.3 |
| 10/09/2018 | 4.3 |
| 10/09/2018 | 4.4 |
| 10/09/2018 | 4.5 |
| 10/09/2018 | 4.6 |
| 10/09/2018 | 4.2 |
| 10/09/2018 | 3.8 |
| 10/09/2018 | 3.3 |
| 10/09/2018 | 3 |
| 11/09/2018 | 2.7 |
| 11/09/2018 | 2.5 |
| 11/09/2018 | 2.4 |
| 11/09/2018 | 2.4 |
| 11/09/2018 | 2.5 |
| 11/09/2018 | 2.8 |
| 11/09/2018 | 3.4 |
| 11/09/2018 | 3.9 |
| 11/09/2018 | 4.2 |
| 11/09/2018 | 4.4 |
| 11/09/2018 | 4.5 |
| 11/09/2018 | 4.5 |
| 11/09/2018 | 4.5 |
| 11/09/2018 | 4.5 |
| 11/09/2018 | 4.4 |
| 11/09/2018 | 4.4 |
| 11/09/2018 | 4.3 |
| 11/09/2018 | 4.4 |
| 11/09/2018 | 4.5 |
| 11/09/2018 | 4.6 |
| 11/09/2018 | 4.3 |
| 11/09/2018 | 3.8 |
| 11/09/2018 | 3.3 |
| 11/09/2018 | 3 |
| 12/09/2018 | 2.7 |
| 12/09/2018 | 2.5 |
| 12/09/2018 | 2.4 |
| 12/09/2018 | 2.4 |
| 12/09/2018 | 2.5 |
| 12/09/2018 | 2.8 |
| 12/09/2018 | 3.4 |
| 12/09/2018 | 3.9 |
| 12/09/2018 | 4.2 |
| 12/09/2018 | 4.4 |
| 12/09/2018 | 4.5 |
| 12/09/2018 | 4.5 |
| 12/09/2018 | 4.6 |
| 12/09/2018 | 4.5 |
| 12/09/2018 | 4.4 |
| 12/09/2018 | 4.3 |
| 12/09/2018 | 4.3 |
| 12/09/2018 | 4.4 |
| 12/09/2018 | 4.5 |
| 12/09/2018 | 4.6 |
| 12/09/2018 | 4.2 |
| 12/09/2018 | 3.8 |
| 12/09/2018 | 3.3 |
| 12/09/2018 | 3 |
| 13/09/2018 | 2.7 |
| 13/09/2018 | 2.5 |
| 13/09/2018 | 2.4 |
| 13/09/2018 | 2.4 |
| 13/09/2018 | 2.5 |
| 13/09/2018 | 2.8 |
| 13/09/2018 | 3.4 |
| 13/09/2018 | 3.9 |
| 13/09/2018 | 4.2 |
| 13/09/2018 | 4.4 |
| 13/09/2018 | 4.5 |
| 13/09/2018 | 4.5 |
| 13/09/2018 | 4.5 |
| 13/09/2018 | 4.5 |
| 13/09/2018 | 4.4 |
| 13/09/2018 | 4.3 |
| 13/09/2018 | 4.3 |
| 13/09/2018 | 4.4 |
| 13/09/2018 | 4.5 |
| 13/09/2018 | 4.6 |
| 13/09/2018 | 4.3 |
| 13/09/2018 | 3.8 |
| 13/09/2018 | 3.3 |
| 13/09/2018 | 3 |
| 14/09/2018 | 2.7 |
| 14/09/2018 | 2.5 |
| 14/09/2018 | 2.5 |
| 14/09/2018 | 2.4 |
| 14/09/2018 | 2.5 |
| 14/09/2018 | 2.8 |
| 14/09/2018 | 3.4 |
| 14/09/2018 | 3.9 |
| 14/09/2018 | 4.2 |
| 14/09/2018 | 4.4 |
| 14/09/2018 | 4.5 |
| 14/09/2018 | 4.5 |
| 14/09/2018 | 4.5 |
| 14/09/2018 | 4.4 |
| 14/09/2018 | 4.3 |
| 14/09/2018 | 4.2 |
| 14/09/2018 | 4.2 |
| 14/09/2018 | 4.2 |
| 14/09/2018 | 4.3 |
| 14/09/2018 | 4.4 |
| 14/09/2018 | 4.1 |
| 14/09/2018 | 3.6 |
| 14/09/2018 | 3.2 |
| 14/09/2018 | 2.9 |
| 15/09/2018 | 2.7 |
| 15/09/2018 | 2.5 |
| 15/09/2018 | 2.4 |
| 15/09/2018 | 2.4 |
| 15/09/2018 | 2.4 |
| 15/09/2018 | 2.5 |
| 15/09/2018 | 2.6 |
| 15/09/2018 | 2.8 |
| 15/09/2018 | 3.1 |
| 15/09/2018 | 3.5 |
| 15/09/2018 | 3.7 |
| 15/09/2018 | 3.8 |
| 15/09/2018 | 3.8 |
| 15/09/2018 | 3.7 |
| 15/09/2018 | 3.6 |
| 15/09/2018 | 3.5 |
| 15/09/2018 | 3.5 |
| 15/09/2018 | 3.6 |
| 15/09/2018 | 3.7 |
| 15/09/2018 | 3.8 |
| 15/09/2018 | 3.7 |
| 15/09/2018 | 3.3 |
| 15/09/2018 | 3 |
| 15/09/2018 | 2.8 |
| 16/09/2018 | 2.6 |
| 16/09/2018 | 2.4 |
| 16/09/2018 | 2.4 |
| 16/09/2018 | 2.3 |
| 16/09/2018 | 2.3 |
| 16/09/2018 | 2.3 |
| 16/09/2018 | 2.4 |
| 16/09/2018 | 2.5 |
| 16/09/2018 | 2.7 |
| 16/09/2018 | 3 |
| 16/09/2018 | 3.2 |
| 16/09/2018 | 3.3 |
| 16/09/2018 | 3.4 |
| 16/09/2018 | 3.3 |
| 16/09/2018 | 3.2 |
| 16/09/2018 | 3.2 |
| 16/09/2018 | 3.2 |
| 16/09/2018 | 3.3 |
| 16/09/2018 | 3.5 |
| 16/09/2018 | 3.6 |
| 16/09/2018 | 3.5 |
| 16/09/2018 | 3.3 |
| 16/09/2018 | 3 |
| 16/09/2018 | 2.8 |
| 17/09/2018 | 2.6 |
| 17/09/2018 | 2.4 |
| 17/09/2018 | 2.4 |
| 17/09/2018 | 2.4 |
| 17/09/2018 | 2.5 |
| 17/09/2018 | 2.7 |
| 17/09/2018 | 3.3 |
| 17/09/2018 | 3.8 |
| 17/09/2018 | 4.2 |
| 17/09/2018 | 4.4 |
| 17/09/2018 | 4.5 |
| 17/09/2018 | 4.5 |
| 17/09/2018 | 4.5 |
| 17/09/2018 | 4.5 |
| 17/09/2018 | 4.4 |
| 17/09/2018 | 4.3 |
| 17/09/2018 | 4.3 |
| 17/09/2018 | 4.4 |
| 17/09/2018 | 4.5 |
| 17/09/2018 | 4.6 |
| 17/09/2018 | 4.3 |
| 17/09/2018 | 3.8 |
| 17/09/2018 | 3.3 |
| 17/09/2018 | 3 |
| 18/09/2018 | 2.7 |
| 18/09/2018 | 2.5 |
| 18/09/2018 | 2.4 |
| 18/09/2018 | 2.4 |
| 18/09/2018 | 2.5 |
| 18/09/2018 | 2.8 |
| 18/09/2018 | 3.4 |
| 18/09/2018 | 3.9 |
| 18/09/2018 | 4.2 |
| 18/09/2018 | 4.4 |
| 18/09/2018 | 4.5 |
| 18/09/2018 | 4.5 |
| 18/09/2018 | 4.6 |
| 18/09/2018 | 4.5 |
| 18/09/2018 | 4.4 |
| 18/09/2018 | 4.4 |
| 18/09/2018 | 4.3 |
| 18/09/2018 | 4.4 |
| 18/09/2018 | 4.6 |
| 18/09/2018 | 4.6 |
| 18/09/2018 | 4.3 |
| 18/09/2018 | 3.8 |
| 18/09/2018 | 3.3 |
| 18/09/2018 | 3 |
| 19/09/2018 | 2.7 |
| 19/09/2018 | 2.5 |
| 19/09/2018 | 2.4 |
| 19/09/2018 | 2.4 |
| 19/09/2018 | 2.5 |
| 19/09/2018 | 2.8 |
| 19/09/2018 | 3.4 |
| 19/09/2018 | 3.9 |
| 19/09/2018 | 4.2 |
| 19/09/2018 | 4.4 |
| 19/09/2018 | 4.5 |
| 19/09/2018 | 4.5 |
| 19/09/2018 | 4.6 |
| 19/09/2018 | 4.5 |
| 19/09/2018 | 4.4 |
| 19/09/2018 | 4.3 |
| 19/09/2018 | 4.3 |
| 19/09/2018 | 4.4 |
| 19/09/2018 | 4.5 |
| 19/09/2018 | 4.6 |
| 19/09/2018 | 4.3 |
| 19/09/2018 | 3.8 |
| 19/09/2018 | 3.3 |
| 19/09/2018 | 3 |
| 20/09/2018 | 2.7 |
| 20/09/2018 | 2.5 |
| 20/09/2018 | 2.5 |
| 20/09/2018 | 2.4 |
| 20/09/2018 | 2.6 |
| 20/09/2018 | 2.8 |
| 20/09/2018 | 3.4 |
| 20/09/2018 | 3.9 |
| 20/09/2018 | 4.2 |
| 20/09/2018 | 4.4 |
| 20/09/2018 | 4.5 |
| 20/09/2018 | 4.5 |
| 20/09/2018 | 4.5 |
| 20/09/2018 | 4.5 |
| 20/09/2018 | 4.4 |
| 20/09/2018 | 4.3 |
| 20/09/2018 | 4.3 |
| 20/09/2018 | 4.4 |
| 20/09/2018 | 4.5 |
| 20/09/2018 | 4.6 |
| 20/09/2018 | 4.3 |
| 20/09/2018 | 3.8 |
| 20/09/2018 | 3.3 |
| 20/09/2018 | 3 |
| 21/09/2018 | 2.7 |
| 21/09/2018 | 2.5 |
| 21/09/2018 | 2.5 |
| 21/09/2018 | 2.4 |
| 21/09/2018 | 2.6 |
| 21/09/2018 | 2.8 |
| 21/09/2018 | 3.4 |
| 21/09/2018 | 3.9 |
| 21/09/2018 | 4.2 |
| 21/09/2018 | 4.4 |
| 21/09/2018 | 4.5 |
| 21/09/2018 | 4.5 |
| 21/09/2018 | 4.5 |
| 21/09/2018 | 4.4 |
| 21/09/2018 | 4.3 |
| 21/09/2018 | 4.2 |
| 21/09/2018 | 4.2 |
| 21/09/2018 | 4.2 |
| 21/09/2018 | 4.4 |
| 21/09/2018 | 4.4 |
| 21/09/2018 | 4.1 |
| 21/09/2018 | 3.6 |
| 21/09/2018 | 3.2 |
| 21/09/2018 | 2.9 |
| 22/09/2018 | 2.7 |
| 22/09/2018 | 2.5 |
| 22/09/2018 | 2.4 |
| 22/09/2018 | 2.4 |
| 22/09/2018 | 2.4 |
| 22/09/2018 | 2.5 |
| 22/09/2018 | 2.6 |
| 22/09/2018 | 2.8 |
| 22/09/2018 | 3.1 |
| 22/09/2018 | 3.5 |
| 22/09/2018 | 3.7 |
| 22/09/2018 | 3.8 |
| 22/09/2018 | 3.8 |
| 22/09/2018 | 3.7 |
| 22/09/2018 | 3.6 |
| 22/09/2018 | 3.5 |
| 22/09/2018 | 3.5 |
| 22/09/2018 | 3.6 |
| 22/09/2018 | 3.7 |
| 22/09/2018 | 3.9 |
| 22/09/2018 | 3.7 |
| 22/09/2018 | 3.3 |
| 22/09/2018 | 3 |
| 22/09/2018 | 2.8 |
| 23/09/2018 | 2.6 |
| 23/09/2018 | 2.4 |
| 23/09/2018 | 2.4 |
| 23/09/2018 | 2.3 |
| 23/09/2018 | 2.3 |
| 23/09/2018 | 2.3 |
| 23/09/2018 | 2.4 |
| 23/09/2018 | 2.5 |
| 23/09/2018 | 2.7 |
| 23/09/2018 | 3 |
| 23/09/2018 | 3.2 |
| 23/09/2018 | 3.3 |
| 23/09/2018 | 3.4 |
| 23/09/2018 | 3.3 |
| 23/09/2018 | 3.2 |
| 23/09/2018 | 3.2 |
| 23/09/2018 | 3.2 |
| 23/09/2018 | 3.3 |
| 23/09/2018 | 3.5 |
| 23/09/2018 | 3.6 |
| 23/09/2018 | 3.5 |
| 23/09/2018 | 3.3 |
| 23/09/2018 | 3 |
| 23/09/2018 | 2.8 |
| 24/09/2018 | 2.6 |
| 24/09/2018 | 2.4 |
| 24/09/2018 | 2.4 |
| 24/09/2018 | 2.4 |
| 24/09/2018 | 2.5 |
| 24/09/2018 | 2.8 |
| 24/09/2018 | 3.3 |
| 24/09/2018 | 3.8 |
| 24/09/2018 | 4.2 |
| 24/09/2018 | 4.4 |
| 24/09/2018 | 4.5 |
| 24/09/2018 | 4.5 |
| 24/09/2018 | 4.5 |
| 24/09/2018 | 4.5 |
| 24/09/2018 | 4.4 |
| 24/09/2018 | 4.3 |
| 24/09/2018 | 4.3 |
| 24/09/2018 | 4.4 |
| 24/09/2018 | 4.5 |
| 24/09/2018 | 4.7 |
| 24/09/2018 | 4.3 |
| 24/09/2018 | 3.8 |
| 24/09/2018 | 3.3 |
| 24/09/2018 | 3 |
| 25/09/2018 | 2.7 |
| 25/09/2018 | 2.5 |
| 25/09/2018 | 2.4 |
| 25/09/2018 | 2.4 |
| 25/09/2018 | 2.5 |
| 25/09/2018 | 2.8 |
| 25/09/2018 | 3.4 |
| 25/09/2018 | 3.9 |
| 25/09/2018 | 4.3 |
| 25/09/2018 | 4.4 |
| 25/09/2018 | 4.5 |
| 25/09/2018 | 4.5 |
| 25/09/2018 | 4.6 |
| 25/09/2018 | 4.5 |
| 25/09/2018 | 4.4 |
| 25/09/2018 | 4.4 |
| 25/09/2018 | 4.3 |
| 25/09/2018 | 4.4 |
| 25/09/2018 | 4.6 |
| 25/09/2018 | 4.7 |
| 25/09/2018 | 4.3 |
| 25/09/2018 | 3.8 |
| 25/09/2018 | 3.3 |
| 25/09/2018 | 3 |
| 26/09/2018 | 2.7 |
| 26/09/2018 | 2.5 |
| 26/09/2018 | 2.4 |
| 26/09/2018 | 2.4 |
| 26/09/2018 | 2.6 |
| 26/09/2018 | 2.8 |
| 26/09/2018 | 3.4 |
| 26/09/2018 | 3.9 |
| 26/09/2018 | 4.3 |
| 26/09/2018 | 4.4 |
| 26/09/2018 | 4.5 |
| 26/09/2018 | 4.6 |
| 26/09/2018 | 4.6 |
| 26/09/2018 | 4.5 |
| 26/09/2018 | 4.4 |
| 26/09/2018 | 4.3 |
| 26/09/2018 | 4.3 |
| 26/09/2018 | 4.4 |
| 26/09/2018 | 4.6 |
| 26/09/2018 | 4.7 |
| 26/09/2018 | 4.3 |
| 26/09/2018 | 3.8 |
| 26/09/2018 | 3.3 |
| 26/09/2018 | 3 |
| 27/09/2018 | 2.7 |
| 27/09/2018 | 2.5 |
| 27/09/2018 | 2.5 |
| 27/09/2018 | 2.4 |
| 27/09/2018 | 2.6 |
| 27/09/2018 | 2.8 |
| 27/09/2018 | 3.4 |
| 27/09/2018 | 3.9 |
| 27/09/2018 | 4.3 |
| 27/09/2018 | 4.4 |
| 27/09/2018 | 4.5 |
| 27/09/2018 | 4.5 |
| 27/09/2018 | 4.6 |
| 27/09/2018 | 4.5 |
| 27/09/2018 | 4.4 |
| 27/09/2018 | 4.3 |
| 27/09/2018 | 4.3 |
| 27/09/2018 | 4.4 |
| 27/09/2018 | 4.6 |
| 27/09/2018 | 4.7 |
| 27/09/2018 | 4.4 |
| 27/09/2018 | 3.8 |
| 27/09/2018 | 3.3 |
| 27/09/2018 | 3 |
| 28/09/2018 | 2.7 |
| 28/09/2018 | 2.5 |
| 28/09/2018 | 2.5 |
| 28/09/2018 | 2.4 |
| 28/09/2018 | 2.6 |
| 28/09/2018 | 2.8 |
| 28/09/2018 | 3.4 |
| 28/09/2018 | 3.9 |
| 28/09/2018 | 4.2 |
| 28/09/2018 | 4.4 |
| 28/09/2018 | 4.5 |
| 28/09/2018 | 4.6 |
| 28/09/2018 | 4.5 |
| 28/09/2018 | 4.4 |
| 28/09/2018 | 4.3 |
| 28/09/2018 | 4.2 |
| 28/09/2018 | 4.2 |
| 28/09/2018 | 4.3 |
| 28/09/2018 | 4.4 |
| 28/09/2018 | 4.5 |
| 28/09/2018 | 4.2 |
| 28/09/2018 | 3.7 |
| 28/09/2018 | 3.2 |
| 28/09/2018 | 2.9 |
| 29/09/2018 | 2.7 |
| 29/09/2018 | 2.5 |
| 29/09/2018 | 2.4 |
| 29/09/2018 | 2.4 |
| 29/09/2018 | 2.4 |
| 29/09/2018 | 2.5 |
| 29/09/2018 | 2.6 |
| 29/09/2018 | 2.8 |
| 29/09/2018 | 3.2 |
| 29/09/2018 | 3.5 |
| 29/09/2018 | 3.7 |
| 29/09/2018 | 3.8 |
| 29/09/2018 | 3.8 |
| 29/09/2018 | 3.7 |
| 29/09/2018 | 3.6 |
| 29/09/2018 | 3.5 |
| 29/09/2018 | 3.5 |
| 29/09/2018 | 3.6 |
| 29/09/2018 | 3.8 |
| 29/09/2018 | 3.9 |
| 29/09/2018 | 3.7 |
| 29/09/2018 | 3.4 |
| 29/09/2018 | 3 |
| 29/09/2018 | 2.8 |
| 30/09/2018 | 2.6 |
| 30/09/2018 | 2.4 |
| 30/09/2018 | 2.4 |
| 30/09/2018 | 2.3 |
| 30/09/2018 | 2.3 |
| 30/09/2018 | 2.4 |
| 30/09/2018 | 2.4 |
| 30/09/2018 | 2.5 |
| 30/09/2018 | 2.7 |
| 30/09/2018 | 3 |
| 30/09/2018 | 3.2 |
| 30/09/2018 | 3.3 |
| 30/09/2018 | 3.4 |
| 30/09/2018 | 3.3 |
| 30/09/2018 | 3.2 |
| 30/09/2018 | 3.2 |
| 30/09/2018 | 3.2 |
| 30/09/2018 | 3.3 |
| 30/09/2018 | 3.5 |
| 30/09/2018 | 3.7 |
| 30/09/2018 | 3.6 |
| 30/09/2018 | 3.3 |
| 30/09/2018 | 3 |
| 30/09/2018 | 2.8 |
| 01/10/2018 | 2.6 |
| 01/10/2018 | 2.4 |
| 01/10/2018 | 2.4 |
| 01/10/2018 | 2.4 |
| 01/10/2018 | 2.5 |
| 01/10/2018 | 2.8 |
| 01/10/2018 | 3.4 |
| 01/10/2018 | 3.9 |
| 01/10/2018 | 4.2 |
| 01/10/2018 | 4.4 |
| 01/10/2018 | 4.5 |
| 01/10/2018 | 4.5 |
| 01/10/2018 | 4.6 |
| 01/10/2018 | 4.5 |
| 01/10/2018 | 4.4 |
| 01/10/2018 | 4.4 |
| 01/10/2018 | 4.3 |
| 01/10/2018 | 4.4 |
| 01/10/2018 | 4.6 |
| 01/10/2018 | 4.7 |
| 01/10/2018 | 4.4 |
| 01/10/2018 | 3.8 |
| 01/10/2018 | 3.3 |
| 01/10/2018 | 3 |
| 02/10/2018 | 2.7 |
| 02/10/2018 | 2.5 |
| 02/10/2018 | 2.4 |
| 02/10/2018 | 2.4 |
| 02/10/2018 | 2.6 |
| 02/10/2018 | 2.8 |
| 02/10/2018 | 3.4 |
| 02/10/2018 | 3.9 |
| 02/10/2018 | 4.3 |
| 02/10/2018 | 4.4 |
| 02/10/2018 | 4.5 |
| 02/10/2018 | 4.5 |
| 02/10/2018 | 4.6 |
| 02/10/2018 | 4.5 |
| 02/10/2018 | 4.4 |
| 02/10/2018 | 4.4 |
| 02/10/2018 | 4.3 |
| 02/10/2018 | 4.5 |
| 02/10/2018 | 4.6 |
| 02/10/2018 | 4.8 |
| 02/10/2018 | 4.4 |
| 02/10/2018 | 3.8 |
| 02/10/2018 | 3.3 |
| 02/10/2018 | 3 |
| 03/10/2018 | 2.7 |
| 03/10/2018 | 2.5 |
| 03/10/2018 | 2.4 |
| 03/10/2018 | 2.4 |
| 03/10/2018 | 2.4 |
| 03/10/2018 | 2.4 |
| 03/10/2018 | 2.5 |
| 03/10/2018 | 2.7 |
| 03/10/2018 | 2.9 |
| 03/10/2018 | 3.2 |
| 03/10/2018 | 3.4 |
| 03/10/2018 | 3.5 |
| 03/10/2018 | 3.5 |
| 03/10/2018 | 3.4 |
| 03/10/2018 | 3.3 |
| 03/10/2018 | 3.2 |
| 03/10/2018 | 3.2 |
| 03/10/2018 | 3.3 |
| 03/10/2018 | 3.4 |
| 03/10/2018 | 3.5 |
| 03/10/2018 | 3.4 |
| 03/10/2018 | 3.2 |
| 03/10/2018 | 2.9 |
| 03/10/2018 | 2.8 |
| 04/10/2018 | 2.7 |
| 04/10/2018 | 2.5 |
| 04/10/2018 | 2.5 |
| 04/10/2018 | 2.4 |
| 04/10/2018 | 2.6 |
| 04/10/2018 | 2.8 |
| 04/10/2018 | 3.4 |
| 04/10/2018 | 3.9 |
| 04/10/2018 | 4.3 |
| 04/10/2018 | 4.4 |
| 04/10/2018 | 4.5 |
| 04/10/2018 | 4.6 |
| 04/10/2018 | 4.6 |
| 04/10/2018 | 4.5 |
| 04/10/2018 | 4.4 |
| 04/10/2018 | 4.4 |
| 04/10/2018 | 4.3 |
| 04/10/2018 | 4.4 |
| 04/10/2018 | 4.6 |
| 04/10/2018 | 4.7 |
| 04/10/2018 | 4.4 |
| 04/10/2018 | 3.8 |
| 04/10/2018 | 3.3 |
| 04/10/2018 | 3 |
| 05/10/2018 | 2.7 |
| 05/10/2018 | 2.6 |
| 05/10/2018 | 2.5 |
| 05/10/2018 | 2.5 |
| 05/10/2018 | 2.6 |
| 05/10/2018 | 2.8 |
| 05/10/2018 | 3.4 |
| 05/10/2018 | 3.9 |
| 05/10/2018 | 4.3 |
| 05/10/2018 | 4.4 |
| 05/10/2018 | 4.6 |
| 05/10/2018 | 4.6 |
| 05/10/2018 | 4.6 |
| 05/10/2018 | 4.4 |
| 05/10/2018 | 4.3 |
| 05/10/2018 | 4.3 |
| 05/10/2018 | 4.2 |
| 05/10/2018 | 4.3 |
| 05/10/2018 | 4.4 |
| 05/10/2018 | 4.5 |
| 05/10/2018 | 4.2 |
| 05/10/2018 | 3.7 |
| 05/10/2018 | 3.2 |
| 05/10/2018 | 2.9 |
| 06/10/2018 | 2.7 |
| 06/10/2018 | 2.5 |
| 06/10/2018 | 2.4 |
| 06/10/2018 | 2.4 |
| 06/10/2018 | 2.4 |
| 06/10/2018 | 2.5 |
| 06/10/2018 | 2.6 |
| 06/10/2018 | 2.8 |
| 06/10/2018 | 3.2 |
| 06/10/2018 | 3.5 |
| 06/10/2018 | 3.7 |
| 06/10/2018 | 3.8 |
| 06/10/2018 | 3.8 |
| 06/10/2018 | 3.7 |
| 06/10/2018 | 3.6 |
| 06/10/2018 | 3.6 |
| 06/10/2018 | 3.6 |
| 06/10/2018 | 3.6 |
| 06/10/2018 | 3.8 |
| 06/10/2018 | 4 |
| 06/10/2018 | 3.8 |
| 06/10/2018 | 3.4 |
| 06/10/2018 | 3 |
| 06/10/2018 | 2.8 |
| 07/10/2018 | 2.6 |
| 07/10/2018 | 2.4 |
| 07/10/2018 | 2.4 |
| 07/10/2018 | 2.3 |
| 07/10/2018 | 2.3 |
| 07/10/2018 | 2.4 |
| 07/10/2018 | 2.4 |
| 07/10/2018 | 2.5 |
| 07/10/2018 | 2.8 |
| 07/10/2018 | 3 |
| 07/10/2018 | 3.2 |
| 07/10/2018 | 3.3 |
| 07/10/2018 | 3.4 |
| 07/10/2018 | 3.3 |
| 07/10/2018 | 3.2 |
| 07/10/2018 | 3.2 |
| 07/10/2018 | 3.2 |
| 07/10/2018 | 3.4 |
| 07/10/2018 | 3.6 |
| 07/10/2018 | 3.7 |
| 07/10/2018 | 3.6 |
| 07/10/2018 | 3.3 |
| 07/10/2018 | 3 |
| 07/10/2018 | 2.8 |
| 08/10/2018 | 2.6 |
| 08/10/2018 | 2.4 |
| 08/10/2018 | 2.4 |
| 08/10/2018 | 2.4 |
| 08/10/2018 | 2.5 |
| 08/10/2018 | 2.8 |
| 08/10/2018 | 3.4 |
| 08/10/2018 | 3.9 |
| 08/10/2018 | 4.2 |
| 08/10/2018 | 4.4 |
| 08/10/2018 | 4.5 |
| 08/10/2018 | 4.6 |
| 08/10/2018 | 4.6 |
| 08/10/2018 | 4.5 |
| 08/10/2018 | 4.5 |
| 08/10/2018 | 4.4 |
| 08/10/2018 | 4.4 |
| 08/10/2018 | 4.5 |
| 08/10/2018 | 4.6 |
| 08/10/2018 | 4.7 |
| 08/10/2018 | 4.4 |
| 08/10/2018 | 3.8 |
| 08/10/2018 | 3.3 |
| 08/10/2018 | 3 |
| 09/10/2018 | 2.7 |
| 09/10/2018 | 2.5 |
| 09/10/2018 | 2.4 |
| 09/10/2018 | 2.4 |
| 09/10/2018 | 2.6 |
| 09/10/2018 | 2.8 |
| 09/10/2018 | 3.4 |
| 09/10/2018 | 3.9 |
| 09/10/2018 | 4.3 |
| 09/10/2018 | 4.5 |
| 09/10/2018 | 4.6 |
| 09/10/2018 | 4.6 |
| 09/10/2018 | 4.6 |
| 09/10/2018 | 4.5 |
| 09/10/2018 | 4.5 |
| 09/10/2018 | 4.4 |
| 09/10/2018 | 4.4 |
| 09/10/2018 | 4.5 |
| 09/10/2018 | 4.6 |
| 09/10/2018 | 4.7 |
| 09/10/2018 | 4.4 |
| 09/10/2018 | 3.9 |
| 09/10/2018 | 3.3 |
| 09/10/2018 | 3 |
| 10/10/2018 | 2.7 |
| 10/10/2018 | 2.5 |
| 10/10/2018 | 2.5 |
| 10/10/2018 | 2.4 |
| 10/10/2018 | 2.6 |
| 10/10/2018 | 2.8 |
| 10/10/2018 | 3.4 |
| 10/10/2018 | 4 |
| 10/10/2018 | 4.3 |
| 10/10/2018 | 4.5 |
| 10/10/2018 | 4.6 |
| 10/10/2018 | 4.6 |
| 10/10/2018 | 4.6 |
| 10/10/2018 | 4.5 |
| 10/10/2018 | 4.5 |
| 10/10/2018 | 4.4 |
| 10/10/2018 | 4.4 |
| 10/10/2018 | 4.5 |
| 10/10/2018 | 4.6 |
| 10/10/2018 | 4.7 |
| 10/10/2018 | 4.4 |
| 10/10/2018 | 3.8 |
| 10/10/2018 | 3.4 |
| 10/10/2018 | 3 |
| 11/10/2018 | 2.7 |
| 11/10/2018 | 2.5 |
| 11/10/2018 | 2.5 |
| 11/10/2018 | 2.5 |
| 11/10/2018 | 2.6 |
| 11/10/2018 | 2.8 |
| 11/10/2018 | 3.4 |
| 11/10/2018 | 4 |
| 11/10/2018 | 4.3 |
| 11/10/2018 | 4.5 |
| 11/10/2018 | 4.6 |
| 11/10/2018 | 4.6 |
| 11/10/2018 | 4.6 |
| 11/10/2018 | 4.5 |
| 11/10/2018 | 4.5 |
| 11/10/2018 | 4.4 |
| 11/10/2018 | 4.4 |
| 11/10/2018 | 4.5 |
| 11/10/2018 | 4.6 |
| 11/10/2018 | 4.7 |
| 11/10/2018 | 4.4 |
| 11/10/2018 | 3.9 |
| 11/10/2018 | 3.4 |
| 11/10/2018 | 3 |
| 12/10/2018 | 2.8 |
| 12/10/2018 | 2.6 |
| 12/10/2018 | 2.5 |
| 12/10/2018 | 2.5 |
| 12/10/2018 | 2.6 |
| 12/10/2018 | 2.8 |
| 12/10/2018 | 3.4 |
| 12/10/2018 | 3.9 |
| 12/10/2018 | 4.3 |
| 12/10/2018 | 4.5 |
| 12/10/2018 | 4.6 |
| 12/10/2018 | 4.6 |
| 12/10/2018 | 4.6 |
| 12/10/2018 | 4.5 |
| 12/10/2018 | 4.4 |
| 12/10/2018 | 4.3 |
| 12/10/2018 | 4.3 |
| 12/10/2018 | 4.4 |
| 12/10/2018 | 4.4 |
| 12/10/2018 | 4.5 |
| 12/10/2018 | 4.2 |
| 12/10/2018 | 3.7 |
| 12/10/2018 | 3.3 |
| 12/10/2018 | 3 |
| 13/10/2018 | 2.7 |
| 13/10/2018 | 2.5 |
| 13/10/2018 | 2.4 |
| 13/10/2018 | 2.4 |
| 13/10/2018 | 2.4 |
| 13/10/2018 | 2.5 |
| 13/10/2018 | 2.6 |
| 13/10/2018 | 2.8 |
| 13/10/2018 | 3.2 |
| 13/10/2018 | 3.5 |
| 13/10/2018 | 3.8 |
| 13/10/2018 | 3.8 |
| 13/10/2018 | 3.8 |
| 13/10/2018 | 3.7 |
| 13/10/2018 | 3.6 |
| 13/10/2018 | 3.6 |
| 13/10/2018 | 3.6 |
| 13/10/2018 | 3.7 |
| 13/10/2018 | 3.8 |
| 13/10/2018 | 3.9 |
| 13/10/2018 | 3.8 |
| 13/10/2018 | 3.4 |
| 13/10/2018 | 3 |
| 13/10/2018 | 2.8 |
| 14/10/2018 | 2.6 |
| 14/10/2018 | 2.4 |
| 14/10/2018 | 2.4 |
| 14/10/2018 | 2.3 |
| 14/10/2018 | 2.3 |
| 14/10/2018 | 2.4 |
| 14/10/2018 | 2.4 |
| 14/10/2018 | 2.5 |
| 14/10/2018 | 2.8 |
| 14/10/2018 | 3 |
| 14/10/2018 | 3.2 |
| 14/10/2018 | 3.4 |
| 14/10/2018 | 3.4 |
| 14/10/2018 | 3.4 |
| 14/10/2018 | 3.3 |
| 14/10/2018 | 3.2 |
| 14/10/2018 | 3.3 |
| 14/10/2018 | 3.4 |
| 14/10/2018 | 3.6 |
| 14/10/2018 | 3.7 |
| 14/10/2018 | 3.6 |
| 14/10/2018 | 3.3 |
| 14/10/2018 | 3.1 |
| 14/10/2018 | 2.8 |
| 15/10/2018 | 2.6 |
| 15/10/2018 | 2.4 |
| 15/10/2018 | 2.4 |
| 15/10/2018 | 2.4 |
| 15/10/2018 | 2.5 |
| 15/10/2018 | 2.8 |
| 15/10/2018 | 3.4 |
| 15/10/2018 | 3.9 |
| 15/10/2018 | 4.2 |
| 15/10/2018 | 4.4 |
| 15/10/2018 | 4.6 |
| 15/10/2018 | 4.6 |
| 15/10/2018 | 4.6 |
| 15/10/2018 | 4.6 |
| 15/10/2018 | 4.5 |
| 15/10/2018 | 4.4 |
| 15/10/2018 | 4.5 |
| 15/10/2018 | 4.5 |
| 15/10/2018 | 4.6 |
| 15/10/2018 | 4.7 |
| 15/10/2018 | 4.4 |
| 15/10/2018 | 3.9 |
| 15/10/2018 | 3.4 |
| 15/10/2018 | 3 |
| 16/10/2018 | 2.7 |
| 16/10/2018 | 2.5 |
| 16/10/2018 | 2.5 |
| 16/10/2018 | 2.4 |
| 16/10/2018 | 2.6 |
| 16/10/2018 | 2.8 |
| 16/10/2018 | 3.4 |
| 16/10/2018 | 4 |
| 16/10/2018 | 4.3 |
| 16/10/2018 | 4.5 |
| 16/10/2018 | 4.6 |
| 16/10/2018 | 4.6 |
| 16/10/2018 | 4.6 |
| 16/10/2018 | 4.6 |
| 16/10/2018 | 4.5 |
| 16/10/2018 | 4.5 |
| 16/10/2018 | 4.5 |
| 16/10/2018 | 4.6 |
| 16/10/2018 | 4.7 |
| 16/10/2018 | 4.7 |
| 16/10/2018 | 4.4 |
| 16/10/2018 | 3.9 |
| 16/10/2018 | 3.4 |
| 16/10/2018 | 3 |
| 17/10/2018 | 2.7 |
| 17/10/2018 | 2.5 |
| 17/10/2018 | 2.5 |
| 17/10/2018 | 2.5 |
| 17/10/2018 | 2.6 |
| 17/10/2018 | 2.8 |
| 17/10/2018 | 3.4 |
| 17/10/2018 | 4 |
| 17/10/2018 | 4.3 |
| 17/10/2018 | 4.5 |
| 17/10/2018 | 4.6 |
| 17/10/2018 | 4.6 |
| 17/10/2018 | 4.6 |
| 17/10/2018 | 4.6 |
| 17/10/2018 | 4.5 |
| 17/10/2018 | 4.5 |
| 17/10/2018 | 4.5 |
| 17/10/2018 | 4.6 |
| 17/10/2018 | 4.6 |
| 17/10/2018 | 4.7 |
| 17/10/2018 | 4.4 |
| 17/10/2018 | 3.9 |
| 17/10/2018 | 3.4 |
| 17/10/2018 | 3 |
| 18/10/2018 | 2.7 |
| 18/10/2018 | 2.6 |
| 18/10/2018 | 2.5 |
| 18/10/2018 | 2.5 |
| 18/10/2018 | 2.6 |
| 18/10/2018 | 2.8 |
| 18/10/2018 | 3.4 |
| 18/10/2018 | 4 |
| 18/10/2018 | 4.3 |
| 18/10/2018 | 4.5 |
| 18/10/2018 | 4.6 |
| 18/10/2018 | 4.6 |
| 18/10/2018 | 4.6 |
| 18/10/2018 | 4.6 |
| 18/10/2018 | 4.5 |
| 18/10/2018 | 4.5 |
| 18/10/2018 | 4.5 |
| 18/10/2018 | 4.6 |
| 18/10/2018 | 4.6 |
| 18/10/2018 | 4.7 |
| 18/10/2018 | 4.4 |
| 18/10/2018 | 3.9 |
| 18/10/2018 | 3.4 |
| 18/10/2018 | 3 |
| 19/10/2018 | 2.8 |
| 19/10/2018 | 2.6 |
| 19/10/2018 | 2.5 |
| 19/10/2018 | 2.5 |
| 19/10/2018 | 2.6 |
| 19/10/2018 | 2.8 |
| 19/10/2018 | 3.4 |
| 19/10/2018 | 4 |
| 19/10/2018 | 4.3 |
| 19/10/2018 | 4.5 |
| 19/10/2018 | 4.6 |
| 19/10/2018 | 4.6 |
| 19/10/2018 | 4.6 |
| 19/10/2018 | 4.5 |
| 19/10/2018 | 4.4 |
| 19/10/2018 | 4.4 |
| 19/10/2018 | 4.4 |
| 19/10/2018 | 4.4 |
| 19/10/2018 | 4.5 |
| 19/10/2018 | 4.5 |
| 19/10/2018 | 4.2 |
| 19/10/2018 | 3.7 |
| 19/10/2018 | 3.3 |
| 19/10/2018 | 3 |
| 20/10/2018 | 2.7 |
| 20/10/2018 | 2.5 |
| 20/10/2018 | 2.4 |
| 20/10/2018 | 2.4 |
| 20/10/2018 | 2.4 |
| 20/10/2018 | 2.5 |
| 20/10/2018 | 2.6 |
| 20/10/2018 | 2.9 |
| 20/10/2018 | 3.2 |
| 20/10/2018 | 3.5 |
| 20/10/2018 | 3.8 |
| 20/10/2018 | 3.9 |
| 20/10/2018 | 3.9 |
| 20/10/2018 | 3.8 |
| 20/10/2018 | 3.7 |
| 20/10/2018 | 3.6 |
| 20/10/2018 | 3.7 |
| 20/10/2018 | 3.8 |
| 20/10/2018 | 3.8 |
| 20/10/2018 | 3.9 |
| 20/10/2018 | 3.8 |
| 20/10/2018 | 3.4 |
| 20/10/2018 | 3.1 |
| 20/10/2018 | 2.8 |
| 21/10/2018 | 2.6 |
| 21/10/2018 | 2.4 |
| 21/10/2018 | 2.4 |
| 21/10/2018 | 2.3 |
| 21/10/2018 | 2.3 |
| 21/10/2018 | 2.4 |
| 21/10/2018 | 2.4 |
| 21/10/2018 | 2.6 |
| 21/10/2018 | 2.8 |
| 21/10/2018 | 3.1 |
| 21/10/2018 | 3.2 |
| 21/10/2018 | 3.4 |
| 21/10/2018 | 3.5 |
| 21/10/2018 | 3.4 |
| 21/10/2018 | 3.3 |
| 21/10/2018 | 3.3 |
| 21/10/2018 | 3.4 |
| 21/10/2018 | 3.5 |
| 21/10/2018 | 3.6 |
| 21/10/2018 | 3.7 |
| 21/10/2018 | 3.6 |
| 21/10/2018 | 3.3 |
| 21/10/2018 | 3.1 |
| 21/10/2018 | 2.8 |
| 22/10/2018 | 2.6 |
| 22/10/2018 | 2.5 |
| 22/10/2018 | 2.4 |
| 22/10/2018 | 2.4 |
| 22/10/2018 | 2.5 |
| 22/10/2018 | 2.8 |
| 22/10/2018 | 3.3 |
| 22/10/2018 | 3.8 |
| 22/10/2018 | 4.1 |
| 22/10/2018 | 4.3 |
| 22/10/2018 | 4.5 |
| 22/10/2018 | 4.6 |
| 22/10/2018 | 4.6 |
| 22/10/2018 | 4.5 |
| 22/10/2018 | 4.5 |
| 22/10/2018 | 4.4 |
| 22/10/2018 | 4.5 |
| 22/10/2018 | 4.5 |
| 22/10/2018 | 4.5 |
| 22/10/2018 | 4.5 |
| 22/10/2018 | 4.3 |
| 22/10/2018 | 3.8 |
| 22/10/2018 | 3.4 |
| 22/10/2018 | 3 |
| 23/10/2018 | 2.8 |
| 23/10/2018 | 2.6 |
| 23/10/2018 | 2.5 |
| 23/10/2018 | 2.5 |
| 23/10/2018 | 2.6 |
| 23/10/2018 | 2.8 |
| 23/10/2018 | 3.3 |
| 23/10/2018 | 3.8 |
| 23/10/2018 | 4.2 |
| 23/10/2018 | 4.4 |
| 23/10/2018 | 4.5 |
| 23/10/2018 | 4.6 |
| 23/10/2018 | 4.6 |
| 23/10/2018 | 4.5 |
| 23/10/2018 | 4.5 |
| 23/10/2018 | 4.4 |
| 23/10/2018 | 4.5 |
| 23/10/2018 | 4.6 |
| 23/10/2018 | 4.6 |
| 23/10/2018 | 4.6 |
| 23/10/2018 | 4.3 |
| 23/10/2018 | 3.9 |
| 23/10/2018 | 3.4 |
| 23/10/2018 | 3 |
| 24/10/2018 | 2.8 |
| 24/10/2018 | 2.6 |
| 24/10/2018 | 2.5 |
| 24/10/2018 | 2.5 |
| 24/10/2018 | 2.6 |
| 24/10/2018 | 2.8 |
| 24/10/2018 | 3.3 |
| 24/10/2018 | 3.8 |
| 24/10/2018 | 4.2 |
| 24/10/2018 | 4.4 |
| 24/10/2018 | 4.6 |
| 24/10/2018 | 4.6 |
| 24/10/2018 | 4.6 |
| 24/10/2018 | 4.5 |
| 24/10/2018 | 4.5 |
| 24/10/2018 | 4.4 |
| 24/10/2018 | 4.5 |
| 24/10/2018 | 4.6 |
| 24/10/2018 | 4.5 |
| 24/10/2018 | 4.5 |
| 24/10/2018 | 4.3 |
| 24/10/2018 | 3.8 |
| 24/10/2018 | 3.4 |
| 24/10/2018 | 3 |
| 25/10/2018 | 2.8 |
| 25/10/2018 | 2.6 |
| 25/10/2018 | 2.5 |
| 25/10/2018 | 2.5 |
| 25/10/2018 | 2.6 |
| 25/10/2018 | 2.8 |
| 25/10/2018 | 3.3 |
| 25/10/2018 | 3.8 |
| 25/10/2018 | 4.2 |
| 25/10/2018 | 4.4 |
| 25/10/2018 | 4.5 |
| 25/10/2018 | 4.6 |
| 25/10/2018 | 4.6 |
| 25/10/2018 | 4.5 |
| 25/10/2018 | 4.5 |
| 25/10/2018 | 4.4 |
| 25/10/2018 | 4.5 |
| 25/10/2018 | 4.6 |
| 25/10/2018 | 4.5 |
| 25/10/2018 | 4.5 |
| 25/10/2018 | 4.3 |
| 25/10/2018 | 3.9 |
| 25/10/2018 | 3.4 |
| 25/10/2018 | 3.1 |
| 26/10/2018 | 2.8 |
| 26/10/2018 | 2.6 |
| 26/10/2018 | 2.5 |
| 26/10/2018 | 2.5 |
| 26/10/2018 | 2.6 |
| 26/10/2018 | 2.8 |
| 26/10/2018 | 3.3 |
| 26/10/2018 | 3.8 |
| 26/10/2018 | 4.2 |
| 26/10/2018 | 4.4 |
| 26/10/2018 | 4.6 |
| 26/10/2018 | 4.6 |
| 26/10/2018 | 4.6 |
| 26/10/2018 | 4.5 |
| 26/10/2018 | 4.4 |
| 26/10/2018 | 4.3 |
| 26/10/2018 | 4.4 |
| 26/10/2018 | 4.4 |
| 26/10/2018 | 4.4 |
| 26/10/2018 | 4.3 |
| 26/10/2018 | 4.1 |
| 26/10/2018 | 3.7 |
| 26/10/2018 | 3.3 |
| 26/10/2018 | 3 |
| 27/10/2018 | 2.7 |
| 27/10/2018 | 2.6 |
| 27/10/2018 | 2.5 |
| 27/10/2018 | 2.4 |
| 27/10/2018 | 2.4 |
| 27/10/2018 | 2.5 |
| 27/10/2018 | 2.6 |
| 27/10/2018 | 2.8 |
| 27/10/2018 | 3.1 |
| 27/10/2018 | 3.5 |
| 27/10/2018 | 3.7 |
| 27/10/2018 | 3.8 |
| 27/10/2018 | 3.8 |
| 27/10/2018 | 3.7 |
| 27/10/2018 | 3.6 |
| 27/10/2018 | 3.6 |
| 27/10/2018 | 3.7 |
| 27/10/2018 | 3.7 |
| 27/10/2018 | 3.7 |
| 27/10/2018 | 3.8 |
| 27/10/2018 | 3.7 |
| 27/10/2018 | 3.4 |
| 27/10/2018 | 3.1 |
| 27/10/2018 | 2.8 |
| 28/10/2018 | 2.7 |
| 28/10/2018 | 2.5 |
| 28/10/2018 | 2.4 |
| 28/10/2018 | 2.4 |
| 28/10/2018 | 2.4 |
| 28/10/2018 | 2.4 |
| 28/10/2018 | 2.4 |
| 28/10/2018 | 2.4 |
| 28/10/2018 | 2.5 |
| 28/10/2018 | 2.8 |
| 28/10/2018 | 3.1 |
| 28/10/2018 | 3.3 |
| 28/10/2018 | 3.4 |
| 28/10/2018 | 3.5 |
| 28/10/2018 | 3.4 |
| 28/10/2018 | 3.3 |
| 28/10/2018 | 3.3 |
| 28/10/2018 | 3.4 |
| 28/10/2018 | 3.7 |
| 28/10/2018 | 4 |
| 28/10/2018 | 3.9 |
| 28/10/2018 | 3.6 |
| 28/10/2018 | 3.3 |
| 28/10/2018 | 3.1 |
| 28/10/2018 | 2.9 |
| 29/10/2018 | 2.7 |
| 29/10/2018 | 2.5 |
| 29/10/2018 | 2.5 |
| 29/10/2018 | 2.4 |
| 29/10/2018 | 2.6 |
| 29/10/2018 | 2.8 |
| 29/10/2018 | 3.4 |
| 29/10/2018 | 3.9 |
| 29/10/2018 | 4.3 |
| 29/10/2018 | 4.5 |
| 29/10/2018 | 4.6 |
| 29/10/2018 | 4.6 |
| 29/10/2018 | 4.7 |
| 29/10/2018 | 4.6 |
| 29/10/2018 | 4.5 |
| 29/10/2018 | 4.5 |
| 29/10/2018 | 4.6 |
| 29/10/2018 | 4.9 |
| 29/10/2018 | 5.1 |
| 29/10/2018 | 5 |
| 29/10/2018 | 4.4 |
| 29/10/2018 | 3.9 |
| 29/10/2018 | 3.4 |
| 29/10/2018 | 3.1 |
| 30/10/2018 | 2.8 |
| 30/10/2018 | 2.6 |
| 30/10/2018 | 2.5 |
| 30/10/2018 | 2.5 |
| 30/10/2018 | 2.6 |
| 30/10/2018 | 2.9 |
| 30/10/2018 | 3.5 |
| 30/10/2018 | 4 |
| 30/10/2018 | 4.3 |
| 30/10/2018 | 4.5 |
| 30/10/2018 | 4.6 |
| 30/10/2018 | 4.7 |
| 30/10/2018 | 4.7 |
| 30/10/2018 | 4.6 |
| 30/10/2018 | 4.5 |
| 30/10/2018 | 4.5 |
| 30/10/2018 | 4.7 |
| 30/10/2018 | 5 |
| 30/10/2018 | 5.2 |
| 30/10/2018 | 5 |
| 30/10/2018 | 4.4 |
| 30/10/2018 | 3.9 |
| 30/10/2018 | 3.4 |
| 30/10/2018 | 3.1 |
| 31/10/2018 | 2.8 |
| 31/10/2018 | 2.6 |
| 31/10/2018 | 2.5 |
| 31/10/2018 | 2.5 |
| 31/10/2018 | 2.6 |
| 31/10/2018 | 2.9 |
| 31/10/2018 | 3.5 |
| 31/10/2018 | 4 |
| 31/10/2018 | 4.3 |
| 31/10/2018 | 4.5 |
| 31/10/2018 | 4.7 |
| 31/10/2018 | 4.7 |
| 31/10/2018 | 4.7 |
| 31/10/2018 | 4.6 |
| 31/10/2018 | 4.5 |
| 31/10/2018 | 4.5 |
| 31/10/2018 | 4.6 |
| 31/10/2018 | 5 |
| 31/10/2018 | 5.1 |
| 31/10/2018 | 5 |
| 31/10/2018 | 4.4 |
| 31/10/2018 | 3.9 |
| 31/10/2018 | 3.5 |
| 31/10/2018 | 3.1 |
| 01/11/2018 | 2.8 |
| 01/11/2018 | 2.6 |
| 01/11/2018 | 2.6 |
| 01/11/2018 | 2.5 |
| 01/11/2018 | 2.6 |
| 01/11/2018 | 2.9 |
| 01/11/2018 | 3.5 |
| 01/11/2018 | 4 |
| 01/11/2018 | 4.3 |
| 01/11/2018 | 4.5 |
| 01/11/2018 | 4.6 |
| 01/11/2018 | 4.7 |
| 01/11/2018 | 4.7 |
| 01/11/2018 | 4.6 |
| 01/11/2018 | 4.5 |
| 01/11/2018 | 4.5 |
| 01/11/2018 | 4.6 |
| 01/11/2018 | 5 |
| 01/11/2018 | 5.2 |
| 01/11/2018 | 5 |
| 01/11/2018 | 4.4 |
| 01/11/2018 | 3.9 |
| 01/11/2018 | 3.5 |
| 01/11/2018 | 3.1 |
| 02/11/2018 | 2.9 |
| 02/11/2018 | 2.7 |
| 02/11/2018 | 2.6 |
| 02/11/2018 | 2.5 |
| 02/11/2018 | 2.7 |
| 02/11/2018 | 2.9 |
| 02/11/2018 | 3.4 |
| 02/11/2018 | 4 |
| 02/11/2018 | 4.3 |
| 02/11/2018 | 4.5 |
| 02/11/2018 | 4.7 |
| 02/11/2018 | 4.7 |
| 02/11/2018 | 4.7 |
| 02/11/2018 | 4.5 |
| 02/11/2018 | 4.4 |
| 02/11/2018 | 4.4 |
| 02/11/2018 | 4.5 |
| 02/11/2018 | 4.8 |
| 02/11/2018 | 4.9 |
| 02/11/2018 | 4.8 |
| 02/11/2018 | 4.2 |
| 02/11/2018 | 3.7 |
| 02/11/2018 | 3.4 |
| 02/11/2018 | 3.1 |
| 03/11/2018 | 2.8 |
| 03/11/2018 | 2.6 |
| 03/11/2018 | 2.5 |
| 03/11/2018 | 2.5 |
| 03/11/2018 | 2.5 |
| 03/11/2018 | 2.6 |
| 03/11/2018 | 2.7 |
| 03/11/2018 | 3 |
| 03/11/2018 | 3.3 |
| 03/11/2018 | 3.7 |
| 03/11/2018 | 3.9 |
| 03/11/2018 | 4 |
| 03/11/2018 | 3.9 |
| 03/11/2018 | 3.8 |
| 03/11/2018 | 3.8 |
| 03/11/2018 | 3.8 |
| 03/11/2018 | 3.9 |
| 03/11/2018 | 4.2 |
| 03/11/2018 | 4.4 |
| 03/11/2018 | 4.3 |
| 03/11/2018 | 3.9 |
| 03/11/2018 | 3.5 |
| 03/11/2018 | 3.2 |
| 03/11/2018 | 2.9 |
| 04/11/2018 | 2.7 |
| 04/11/2018 | 2.5 |
| 04/11/2018 | 2.4 |
| 04/11/2018 | 2.4 |
| 04/11/2018 | 2.4 |
| 04/11/2018 | 2.4 |
| 04/11/2018 | 2.5 |
| 04/11/2018 | 2.7 |
| 04/11/2018 | 2.9 |
| 04/11/2018 | 3.2 |
| 04/11/2018 | 3.3 |
| 04/11/2018 | 3.5 |
| 04/11/2018 | 3.5 |
| 04/11/2018 | 3.5 |
| 04/11/2018 | 3.4 |
| 04/11/2018 | 3.4 |
| 04/11/2018 | 3.6 |
| 04/11/2018 | 3.9 |
| 04/11/2018 | 4.1 |
| 04/11/2018 | 4.1 |
| 04/11/2018 | 3.7 |
| 04/11/2018 | 3.4 |
| 04/11/2018 | 3.2 |
| 04/11/2018 | 2.9 |
| 05/11/2018 | 2.7 |
| 05/11/2018 | 2.5 |
| 05/11/2018 | 2.4 |
| 05/11/2018 | 2.4 |
| 05/11/2018 | 2.6 |
| 05/11/2018 | 2.9 |
| 05/11/2018 | 3.5 |
| 05/11/2018 | 4.1 |
| 05/11/2018 | 4.4 |
| 05/11/2018 | 4.6 |
| 05/11/2018 | 4.7 |
| 05/11/2018 | 4.7 |
| 05/11/2018 | 4.7 |
| 05/11/2018 | 4.7 |
| 05/11/2018 | 4.7 |
| 05/11/2018 | 4.6 |
| 05/11/2018 | 4.8 |
| 05/11/2018 | 5.1 |
| 05/11/2018 | 5.3 |
| 05/11/2018 | 5.2 |
| 05/11/2018 | 4.5 |
| 05/11/2018 | 3.9 |
| 05/11/2018 | 3.5 |
| 05/11/2018 | 3.1 |
| 06/11/2018 | 2.8 |
| 06/11/2018 | 2.6 |
| 06/11/2018 | 2.5 |
| 06/11/2018 | 2.5 |
| 06/11/2018 | 2.6 |
| 06/11/2018 | 2.9 |
| 06/11/2018 | 3.6 |
| 06/11/2018 | 4.1 |
| 06/11/2018 | 4.5 |
| 06/11/2018 | 4.6 |
| 06/11/2018 | 4.7 |
| 06/11/2018 | 4.8 |
| 06/11/2018 | 4.8 |
| 06/11/2018 | 4.7 |
| 06/11/2018 | 4.7 |
| 06/11/2018 | 4.7 |
| 06/11/2018 | 4.9 |
| 06/11/2018 | 5.2 |
| 06/11/2018 | 5.3 |
| 06/11/2018 | 5.2 |
| 06/11/2018 | 4.5 |
| 06/11/2018 | 3.9 |
| 06/11/2018 | 3.5 |
| 06/11/2018 | 3.1 |
| 07/11/2018 | 2.8 |
| 07/11/2018 | 2.6 |
| 07/11/2018 | 2.5 |
| 07/11/2018 | 2.5 |
| 07/11/2018 | 2.6 |
| 07/11/2018 | 2.9 |
| 07/11/2018 | 3.6 |
| 07/11/2018 | 4.2 |
| 07/11/2018 | 4.5 |
| 07/11/2018 | 4.7 |
| 07/11/2018 | 4.8 |
| 07/11/2018 | 4.8 |
| 07/11/2018 | 4.8 |
| 07/11/2018 | 4.7 |
| 07/11/2018 | 4.7 |
| 07/11/2018 | 4.6 |
| 07/11/2018 | 4.8 |
| 07/11/2018 | 5.1 |
| 07/11/2018 | 5.3 |
| 07/11/2018 | 5.2 |
| 07/11/2018 | 4.5 |
| 07/11/2018 | 3.9 |
| 07/11/2018 | 3.5 |
| 07/11/2018 | 3.1 |
| 08/11/2018 | 2.8 |
| 08/11/2018 | 2.6 |
| 08/11/2018 | 2.5 |
| 08/11/2018 | 2.5 |
| 08/11/2018 | 2.6 |
| 08/11/2018 | 2.9 |
| 08/11/2018 | 3.6 |
| 08/11/2018 | 4.2 |
| 08/11/2018 | 4.5 |
| 08/11/2018 | 4.7 |
| 08/11/2018 | 4.7 |
| 08/11/2018 | 4.8 |
| 08/11/2018 | 4.8 |
| 08/11/2018 | 4.7 |
| 08/11/2018 | 4.6 |
| 08/11/2018 | 4.6 |
| 08/11/2018 | 4.8 |
| 08/11/2018 | 5.1 |
| 08/11/2018 | 5.3 |
| 08/11/2018 | 5.2 |
| 08/11/2018 | 4.5 |
| 08/11/2018 | 3.9 |
| 08/11/2018 | 3.5 |
| 08/11/2018 | 3.1 |
| 09/11/2018 | 2.9 |
| 09/11/2018 | 2.6 |
| 09/11/2018 | 2.6 |
| 09/11/2018 | 2.5 |
| 09/11/2018 | 2.6 |
| 09/11/2018 | 2.9 |
| 09/11/2018 | 3.6 |
| 09/11/2018 | 4.1 |
| 09/11/2018 | 4.5 |
| 09/11/2018 | 4.7 |
| 09/11/2018 | 4.8 |
| 09/11/2018 | 4.8 |
| 09/11/2018 | 4.7 |
| 09/11/2018 | 4.6 |
| 09/11/2018 | 4.6 |
| 09/11/2018 | 4.5 |
| 09/11/2018 | 4.7 |
| 09/11/2018 | 5 |
| 09/11/2018 | 5.1 |
| 09/11/2018 | 4.9 |
| 09/11/2018 | 4.3 |
| 09/11/2018 | 3.8 |
| 09/11/2018 | 3.4 |
| 09/11/2018 | 3.1 |
| 10/11/2018 | 2.8 |
| 10/11/2018 | 2.6 |
| 10/11/2018 | 2.5 |
| 10/11/2018 | 2.5 |
| 10/11/2018 | 2.5 |
| 10/11/2018 | 2.6 |
| 10/11/2018 | 2.7 |
| 10/11/2018 | 3 |
| 10/11/2018 | 3.3 |
| 10/11/2018 | 3.7 |
| 10/11/2018 | 3.9 |
| 10/11/2018 | 4 |
| 10/11/2018 | 4 |
| 10/11/2018 | 3.9 |
| 10/11/2018 | 3.8 |
| 10/11/2018 | 3.8 |
| 10/11/2018 | 4 |
| 10/11/2018 | 4.2 |
| 10/11/2018 | 4.4 |
| 10/11/2018 | 4.3 |
| 10/11/2018 | 3.9 |
| 10/11/2018 | 3.5 |
| 10/11/2018 | 3.2 |
| 10/11/2018 | 2.9 |
| 11/11/2018 | 2.7 |
| 11/11/2018 | 2.5 |
| 11/11/2018 | 2.4 |
| 11/11/2018 | 2.4 |
| 11/11/2018 | 2.4 |
| 11/11/2018 | 2.4 |
| 11/11/2018 | 2.5 |
| 11/11/2018 | 2.7 |
| 11/11/2018 | 2.9 |
| 11/11/2018 | 3.2 |
| 11/11/2018 | 3.4 |
| 11/11/2018 | 3.5 |
| 11/11/2018 | 3.6 |
| 11/11/2018 | 3.5 |
| 11/11/2018 | 3.4 |
| 11/11/2018 | 3.4 |
| 11/11/2018 | 3.6 |
| 11/11/2018 | 3.9 |
| 11/11/2018 | 4.1 |
| 11/11/2018 | 4.1 |
| 11/11/2018 | 3.7 |
| 11/11/2018 | 3.4 |
| 11/11/2018 | 3.2 |
| 11/11/2018 | 2.9 |
| 12/11/2018 | 2.7 |
| 12/11/2018 | 2.5 |
| 12/11/2018 | 2.4 |
| 12/11/2018 | 2.4 |
| 12/11/2018 | 2.6 |
| 12/11/2018 | 2.9 |
| 12/11/2018 | 3.5 |
| 12/11/2018 | 4.1 |
| 12/11/2018 | 4.4 |
| 12/11/2018 | 4.6 |
| 12/11/2018 | 4.7 |
| 12/11/2018 | 4.8 |
| 12/11/2018 | 4.8 |
| 12/11/2018 | 4.7 |
| 12/11/2018 | 4.7 |
| 12/11/2018 | 4.7 |
| 12/11/2018 | 4.9 |
| 12/11/2018 | 5.2 |
| 12/11/2018 | 5.3 |
| 12/11/2018 | 5.2 |
| 12/11/2018 | 4.5 |
| 12/11/2018 | 3.9 |
| 12/11/2018 | 3.5 |
| 12/11/2018 | 3.1 |
| 13/11/2018 | 2.8 |
| 13/11/2018 | 2.6 |
| 13/11/2018 | 2.5 |
| 13/11/2018 | 2.5 |
| 13/11/2018 | 2.6 |
| 13/11/2018 | 2.9 |
| 13/11/2018 | 3.6 |
| 13/11/2018 | 4.2 |
| 13/11/2018 | 4.5 |
| 13/11/2018 | 4.7 |
| 13/11/2018 | 4.8 |
| 13/11/2018 | 4.8 |
| 13/11/2018 | 4.8 |
| 13/11/2018 | 4.7 |
| 13/11/2018 | 4.7 |
| 13/11/2018 | 4.7 |
| 13/11/2018 | 4.9 |
| 13/11/2018 | 5.2 |
| 13/11/2018 | 5.4 |
| 13/11/2018 | 5.2 |
| 13/11/2018 | 4.6 |
| 13/11/2018 | 4 |
| 13/11/2018 | 3.5 |
| 13/11/2018 | 3.1 |
| 14/11/2018 | 2.8 |
| 14/11/2018 | 2.6 |
| 14/11/2018 | 2.5 |
| 14/11/2018 | 2.5 |
| 14/11/2018 | 2.6 |
| 14/11/2018 | 2.9 |
| 14/11/2018 | 3.6 |
| 14/11/2018 | 4.2 |
| 14/11/2018 | 4.5 |
| 14/11/2018 | 4.7 |
| 14/11/2018 | 4.8 |
| 14/11/2018 | 4.8 |
| 14/11/2018 | 4.8 |
| 14/11/2018 | 4.7 |
| 14/11/2018 | 4.7 |
| 14/11/2018 | 4.7 |
| 14/11/2018 | 4.9 |
| 14/11/2018 | 5.2 |
| 14/11/2018 | 5.3 |
| 14/11/2018 | 5.1 |
| 14/11/2018 | 4.5 |
| 14/11/2018 | 4 |
| 14/11/2018 | 3.5 |
| 14/11/2018 | 3.1 |
| 15/11/2018 | 2.9 |
| 15/11/2018 | 2.6 |
| 15/11/2018 | 2.5 |
| 15/11/2018 | 2.5 |
| 15/11/2018 | 2.6 |
| 15/11/2018 | 2.9 |
| 15/11/2018 | 3.6 |
| 15/11/2018 | 4.2 |
| 15/11/2018 | 4.5 |
| 15/11/2018 | 4.7 |
| 15/11/2018 | 4.8 |
| 15/11/2018 | 4.8 |
| 15/11/2018 | 4.8 |
| 15/11/2018 | 4.7 |
| 15/11/2018 | 4.7 |
| 15/11/2018 | 4.7 |
| 15/11/2018 | 4.9 |
| 15/11/2018 | 5.2 |
| 15/11/2018 | 5.3 |
| 15/11/2018 | 5.2 |
| 15/11/2018 | 4.6 |
| 15/11/2018 | 4 |
| 15/11/2018 | 3.5 |
| 15/11/2018 | 3.2 |
| 16/11/2018 | 2.9 |
| 16/11/2018 | 2.7 |
| 16/11/2018 | 2.6 |
| 16/11/2018 | 2.5 |
| 16/11/2018 | 2.6 |
| 16/11/2018 | 2.9 |
| 16/11/2018 | 3.6 |
| 16/11/2018 | 4.2 |
| 16/11/2018 | 4.5 |
| 16/11/2018 | 4.7 |
| 16/11/2018 | 4.8 |
| 16/11/2018 | 4.8 |
| 16/11/2018 | 4.8 |
| 16/11/2018 | 4.7 |
| 16/11/2018 | 4.6 |
| 16/11/2018 | 4.6 |
| 16/11/2018 | 4.8 |
| 16/11/2018 | 5.1 |
| 16/11/2018 | 5.1 |
| 16/11/2018 | 4.9 |
| 16/11/2018 | 4.3 |
| 16/11/2018 | 3.8 |
| 16/11/2018 | 3.4 |
| 16/11/2018 | 3.1 |
| 17/11/2018 | 2.8 |
| 17/11/2018 | 2.6 |
| 17/11/2018 | 2.5 |
| 17/11/2018 | 2.5 |
| 17/11/2018 | 2.5 |
| 17/11/2018 | 2.6 |
| 17/11/2018 | 2.7 |
| 17/11/2018 | 3 |
| 17/11/2018 | 3.4 |
| 17/11/2018 | 3.7 |
| 17/11/2018 | 3.9 |
| 17/11/2018 | 4 |
| 17/11/2018 | 4 |
| 17/11/2018 | 3.9 |
| 17/11/2018 | 3.8 |
| 17/11/2018 | 3.8 |
| 17/11/2018 | 4.1 |
| 17/11/2018 | 4.3 |
| 17/11/2018 | 4.4 |
| 17/11/2018 | 4.3 |
| 17/11/2018 | 3.9 |
| 17/11/2018 | 3.5 |
| 17/11/2018 | 3.2 |
| 17/11/2018 | 2.9 |
| 18/11/2018 | 2.7 |
| 18/11/2018 | 2.5 |
| 18/11/2018 | 2.4 |
| 18/11/2018 | 2.4 |
| 18/11/2018 | 2.4 |
| 18/11/2018 | 2.4 |
| 18/11/2018 | 2.5 |
| 18/11/2018 | 2.7 |
| 18/11/2018 | 2.9 |
| 18/11/2018 | 3.2 |
| 18/11/2018 | 3.4 |
| 18/11/2018 | 3.5 |
| 18/11/2018 | 3.6 |
| 18/11/2018 | 3.5 |
| 18/11/2018 | 3.4 |
| 18/11/2018 | 3.5 |
| 18/11/2018 | 3.7 |
| 18/11/2018 | 4 |
| 18/11/2018 | 4.2 |
| 18/11/2018 | 4.1 |
| 18/11/2018 | 3.7 |
| 18/11/2018 | 3.4 |
| 18/11/2018 | 3.2 |
| 18/11/2018 | 2.9 |
| 19/11/2018 | 2.7 |
| 19/11/2018 | 2.5 |
| 19/11/2018 | 2.5 |
| 19/11/2018 | 2.4 |
| 19/11/2018 | 2.6 |
| 19/11/2018 | 2.9 |
| 19/11/2018 | 3.5 |
| 19/11/2018 | 4.1 |
| 19/11/2018 | 4.5 |
| 19/11/2018 | 4.6 |
| 19/11/2018 | 4.8 |
| 19/11/2018 | 4.8 |
| 19/11/2018 | 4.8 |
| 19/11/2018 | 4.8 |
| 19/11/2018 | 4.7 |
| 19/11/2018 | 4.7 |
| 19/11/2018 | 5 |
| 19/11/2018 | 5.3 |
| 19/11/2018 | 5.3 |
| 19/11/2018 | 5.1 |
| 19/11/2018 | 4.5 |
| 19/11/2018 | 4 |
| 19/11/2018 | 3.5 |
| 19/11/2018 | 3.1 |
| 20/11/2018 | 2.8 |
| 20/11/2018 | 2.6 |
| 20/11/2018 | 2.5 |
| 20/11/2018 | 2.5 |
| 20/11/2018 | 2.6 |
| 20/11/2018 | 2.9 |
| 20/11/2018 | 3.6 |
| 20/11/2018 | 4.2 |
| 20/11/2018 | 4.5 |
| 20/11/2018 | 4.7 |
| 20/11/2018 | 4.8 |
| 20/11/2018 | 4.8 |
| 20/11/2018 | 4.8 |
| 20/11/2018 | 4.8 |
| 20/11/2018 | 4.7 |
| 20/11/2018 | 4.8 |
| 20/11/2018 | 5 |
| 20/11/2018 | 5.3 |
| 20/11/2018 | 5.4 |
| 20/11/2018 | 5.2 |
| 20/11/2018 | 4.6 |
| 20/11/2018 | 4 |
| 20/11/2018 | 3.5 |
| 20/11/2018 | 3.1 |
| 21/11/2018 | 2.9 |
| 21/11/2018 | 2.6 |
| 21/11/2018 | 2.5 |
| 21/11/2018 | 2.5 |
| 21/11/2018 | 2.6 |
| 21/11/2018 | 2.9 |
| 21/11/2018 | 3.6 |
| 21/11/2018 | 4.2 |
| 21/11/2018 | 4.5 |
| 21/11/2018 | 4.7 |
| 21/11/2018 | 4.8 |
| 21/11/2018 | 4.9 |
| 21/11/2018 | 4.8 |
| 21/11/2018 | 4.8 |
| 21/11/2018 | 4.7 |
| 21/11/2018 | 4.8 |
| 21/11/2018 | 5 |
| 21/11/2018 | 5.3 |
| 21/11/2018 | 5.3 |
| 21/11/2018 | 5.1 |
| 21/11/2018 | 4.5 |
| 21/11/2018 | 4 |
| 21/11/2018 | 3.6 |
| 21/11/2018 | 3.2 |
| 22/11/2018 | 2.9 |
| 22/11/2018 | 2.7 |
| 22/11/2018 | 2.6 |
| 22/11/2018 | 2.5 |
| 22/11/2018 | 2.6 |
| 22/11/2018 | 2.9 |
| 22/11/2018 | 3.6 |
| 22/11/2018 | 4.2 |
| 22/11/2018 | 4.5 |
| 22/11/2018 | 4.7 |
| 22/11/2018 | 4.8 |
| 22/11/2018 | 4.8 |
| 22/11/2018 | 4.8 |
| 22/11/2018 | 4.8 |
| 22/11/2018 | 4.7 |
| 22/11/2018 | 4.7 |
| 22/11/2018 | 5 |
| 22/11/2018 | 5.3 |
| 22/11/2018 | 5.4 |
| 22/11/2018 | 5.2 |
| 22/11/2018 | 4.6 |
| 22/11/2018 | 4 |
| 22/11/2018 | 3.6 |
| 22/11/2018 | 3.2 |
| 23/11/2018 | 2.9 |
| 23/11/2018 | 2.7 |
| 23/11/2018 | 2.6 |
| 23/11/2018 | 2.5 |
| 23/11/2018 | 2.6 |
| 23/11/2018 | 2.9 |
| 23/11/2018 | 3.6 |
| 23/11/2018 | 4.2 |
| 23/11/2018 | 4.5 |
| 23/11/2018 | 4.7 |
| 23/11/2018 | 4.8 |
| 23/11/2018 | 4.9 |
| 23/11/2018 | 4.8 |
| 23/11/2018 | 4.7 |
| 23/11/2018 | 4.6 |
| 23/11/2018 | 4.6 |
| 23/11/2018 | 4.9 |
| 23/11/2018 | 5.1 |
| 23/11/2018 | 5.2 |
| 23/11/2018 | 4.9 |
| 23/11/2018 | 4.4 |
| 23/11/2018 | 3.8 |
| 23/11/2018 | 3.4 |
| 23/11/2018 | 3.1 |
| 24/11/2018 | 2.8 |
| 24/11/2018 | 2.6 |
| 24/11/2018 | 2.5 |
| 24/11/2018 | 2.5 |
| 24/11/2018 | 2.5 |
| 24/11/2018 | 2.6 |
| 24/11/2018 | 2.7 |
| 24/11/2018 | 3 |
| 24/11/2018 | 3.4 |
| 24/11/2018 | 3.7 |
| 24/11/2018 | 4 |
| 24/11/2018 | 4.1 |
| 24/11/2018 | 4 |
| 24/11/2018 | 3.9 |
| 24/11/2018 | 3.9 |
| 24/11/2018 | 3.9 |
| 24/11/2018 | 4.2 |
| 24/11/2018 | 4.4 |
| 24/11/2018 | 4.5 |
| 24/11/2018 | 4.3 |
| 24/11/2018 | 3.9 |
| 24/11/2018 | 3.5 |
| 24/11/2018 | 3.2 |
| 24/11/2018 | 2.9 |
| 25/11/2018 | 2.7 |
| 25/11/2018 | 2.5 |
| 25/11/2018 | 2.5 |
| 25/11/2018 | 2.4 |
| 25/11/2018 | 2.4 |
| 25/11/2018 | 2.4 |
| 25/11/2018 | 2.5 |
| 25/11/2018 | 2.7 |
| 25/11/2018 | 2.9 |
| 25/11/2018 | 3.2 |
| 25/11/2018 | 3.4 |
| 25/11/2018 | 3.6 |
| 25/11/2018 | 3.6 |
| 25/11/2018 | 3.5 |
| 25/11/2018 | 3.5 |
| 25/11/2018 | 3.5 |
| 25/11/2018 | 3.8 |
| 25/11/2018 | 4.1 |
| 25/11/2018 | 4.2 |
| 25/11/2018 | 4 |
| 25/11/2018 | 3.7 |
| 25/11/2018 | 3.4 |
| 25/11/2018 | 3.2 |
| 25/11/2018 | 3 |
| 26/11/2018 | 2.7 |
| 26/11/2018 | 2.5 |
| 26/11/2018 | 2.5 |
| 26/11/2018 | 2.4 |
| 26/11/2018 | 2.6 |
| 26/11/2018 | 2.9 |
| 26/11/2018 | 3.5 |
| 26/11/2018 | 4.1 |
| 26/11/2018 | 4.5 |
| 26/11/2018 | 4.7 |
| 26/11/2018 | 4.8 |
| 26/11/2018 | 4.8 |
| 26/11/2018 | 4.8 |
| 26/11/2018 | 4.8 |
| 26/11/2018 | 4.8 |
| 26/11/2018 | 4.8 |
| 26/11/2018 | 5.1 |
| 26/11/2018 | 5.3 |
| 26/11/2018 | 5.4 |
| 26/11/2018 | 5.1 |
| 26/11/2018 | 4.6 |
| 26/11/2018 | 4 |
| 26/11/2018 | 3.6 |
| 26/11/2018 | 3.2 |
| 27/11/2018 | 2.9 |
| 27/11/2018 | 2.6 |
| 27/11/2018 | 2.5 |
| 27/11/2018 | 2.5 |
| 27/11/2018 | 2.6 |
| 27/11/2018 | 2.9 |
| 27/11/2018 | 3.6 |
| 27/11/2018 | 4.2 |
| 27/11/2018 | 4.6 |
| 27/11/2018 | 4.7 |
| 27/11/2018 | 4.8 |
| 27/11/2018 | 4.9 |
| 27/11/2018 | 4.9 |
| 27/11/2018 | 4.8 |
| 27/11/2018 | 4.8 |
| 27/11/2018 | 4.8 |
| 27/11/2018 | 5.1 |
| 27/11/2018 | 5.4 |
| 27/11/2018 | 5.4 |
| 27/11/2018 | 5.2 |
| 27/11/2018 | 4.6 |
| 27/11/2018 | 4 |
| 27/11/2018 | 3.6 |
| 27/11/2018 | 3.2 |
| 28/11/2018 | 2.9 |
| 28/11/2018 | 2.7 |
| 28/11/2018 | 2.6 |
| 28/11/2018 | 2.5 |
| 28/11/2018 | 2.6 |
| 28/11/2018 | 2.9 |
| 28/11/2018 | 3.6 |
| 28/11/2018 | 4.2 |
| 28/11/2018 | 4.6 |
| 28/11/2018 | 4.7 |
| 28/11/2018 | 4.8 |
| 28/11/2018 | 4.9 |
| 28/11/2018 | 4.9 |
| 28/11/2018 | 4.8 |
| 28/11/2018 | 4.8 |
| 28/11/2018 | 4.8 |
| 28/11/2018 | 5.1 |
| 28/11/2018 | 5.4 |
| 28/11/2018 | 5.4 |
| 28/11/2018 | 5.1 |
| 28/11/2018 | 4.6 |
| 28/11/2018 | 4 |
| 28/11/2018 | 3.6 |
| 28/11/2018 | 3.2 |
| 29/11/2018 | 2.9 |
| 29/11/2018 | 2.7 |
| 29/11/2018 | 2.6 |
| 29/11/2018 | 2.5 |
| 29/11/2018 | 2.6 |
| 29/11/2018 | 2.9 |
| 29/11/2018 | 3.6 |
| 29/11/2018 | 4.2 |
| 29/11/2018 | 4.6 |
| 29/11/2018 | 4.7 |
| 29/11/2018 | 4.8 |
| 29/11/2018 | 4.9 |
| 29/11/2018 | 4.9 |
| 29/11/2018 | 4.8 |
| 29/11/2018 | 4.8 |
| 29/11/2018 | 4.8 |
| 29/11/2018 | 5.1 |
| 29/11/2018 | 5.4 |
| 29/11/2018 | 5.4 |
| 29/11/2018 | 5.2 |
| 29/11/2018 | 4.6 |
| 29/11/2018 | 4 |
| 29/11/2018 | 3.6 |
| 29/11/2018 | 3.2 |
| 30/11/2018 | 2.9 |
| 30/11/2018 | 2.7 |
| 30/11/2018 | 2.6 |
| 30/11/2018 | 2.5 |
| 30/11/2018 | 2.6 |
| 30/11/2018 | 2.9 |
| 30/11/2018 | 3.6 |
| 30/11/2018 | 4.2 |
| 30/11/2018 | 4.6 |
| 30/11/2018 | 4.7 |
| 30/11/2018 | 4.9 |
| 30/11/2018 | 4.9 |
| 30/11/2018 | 4.8 |
| 30/11/2018 | 4.7 |
| 30/11/2018 | 4.7 |
| 30/11/2018 | 4.7 |
| 30/11/2018 | 5 |
| 30/11/2018 | 5.2 |
| 30/11/2018 | 5.2 |
| 30/11/2018 | 4.9 |
| 30/11/2018 | 4.4 |
| 30/11/2018 | 3.8 |
| 30/11/2018 | 3.5 |
| 30/11/2018 | 3.1 |
| 01/12/2018 | 2.8 |
| 01/12/2018 | 2.6 |
| 01/12/2018 | 2.5 |
| 01/12/2018 | 2.5 |
| 01/12/2018 | 2.5 |
| 01/12/2018 | 2.6 |
| 01/12/2018 | 2.7 |
| 01/12/2018 | 3 |
| 01/12/2018 | 3.4 |
| 01/12/2018 | 3.7 |
| 01/12/2018 | 4 |
| 01/12/2018 | 4.1 |
| 01/12/2018 | 4.1 |
| 01/12/2018 | 4 |
| 01/12/2018 | 3.9 |
| 01/12/2018 | 3.9 |
| 01/12/2018 | 4.2 |
| 01/12/2018 | 4.4 |
| 01/12/2018 | 4.5 |
| 01/12/2018 | 4.3 |
| 01/12/2018 | 3.9 |
| 01/12/2018 | 3.5 |
| 01/12/2018 | 3.2 |
| 01/12/2018 | 3 |
| 02/12/2018 | 2.7 |
| 02/12/2018 | 2.5 |
| 02/12/2018 | 2.5 |
| 02/12/2018 | 2.4 |
| 02/12/2018 | 2.4 |
| 02/12/2018 | 2.4 |
| 02/12/2018 | 2.5 |
| 02/12/2018 | 2.7 |
| 02/12/2018 | 3 |
| 02/12/2018 | 3.2 |
| 02/12/2018 | 3.4 |
| 02/12/2018 | 3.6 |
| 02/12/2018 | 3.6 |
| 02/12/2018 | 3.6 |
| 02/12/2018 | 3.5 |
| 02/12/2018 | 3.6 |
| 02/12/2018 | 3.9 |
| 02/12/2018 | 4.1 |
| 02/12/2018 | 4.2 |
| 02/12/2018 | 4 |
| 02/12/2018 | 3.7 |
| 02/12/2018 | 3.5 |
| 02/12/2018 | 3.3 |
| 02/12/2018 | 3 |
| 03/12/2018 | 2.7 |
| 03/12/2018 | 2.5 |
| 03/12/2018 | 2.5 |
| 03/12/2018 | 2.4 |
| 03/12/2018 | 2.6 |
| 03/12/2018 | 2.9 |
| 03/12/2018 | 3.5 |
| 03/12/2018 | 4.2 |
| 03/12/2018 | 4.5 |
| 03/12/2018 | 4.7 |
| 03/12/2018 | 4.8 |
| 03/12/2018 | 4.9 |
| 03/12/2018 | 4.9 |
| 03/12/2018 | 4.8 |
| 03/12/2018 | 4.8 |
| 03/12/2018 | 4.8 |
| 03/12/2018 | 5.2 |
| 03/12/2018 | 5.4 |
| 03/12/2018 | 5.4 |
| 03/12/2018 | 5.1 |
| 03/12/2018 | 4.6 |
| 03/12/2018 | 4 |
| 03/12/2018 | 3.6 |
| 03/12/2018 | 3.2 |
| 04/12/2018 | 2.9 |
| 04/12/2018 | 2.7 |
| 04/12/2018 | 2.6 |
| 04/12/2018 | 2.5 |
| 04/12/2018 | 2.6 |
| 04/12/2018 | 2.9 |
| 04/12/2018 | 3.6 |
| 04/12/2018 | 4.2 |
| 04/12/2018 | 4.6 |
| 04/12/2018 | 4.7 |
| 04/12/2018 | 4.9 |
| 04/12/2018 | 4.9 |
| 04/12/2018 | 4.9 |
| 04/12/2018 | 4.8 |
| 04/12/2018 | 4.8 |
| 04/12/2018 | 4.9 |
| 04/12/2018 | 5.2 |
| 04/12/2018 | 5.5 |
| 04/12/2018 | 5.4 |
| 04/12/2018 | 5.2 |
| 04/12/2018 | 4.6 |
| 04/12/2018 | 4 |
| 04/12/2018 | 3.6 |
| 04/12/2018 | 3.2 |
| 05/12/2018 | 2.9 |
| 05/12/2018 | 2.7 |
| 05/12/2018 | 2.6 |
| 05/12/2018 | 2.5 |
| 05/12/2018 | 2.6 |
| 05/12/2018 | 2.9 |
| 05/12/2018 | 3.6 |
| 05/12/2018 | 4.2 |
| 05/12/2018 | 4.6 |
| 05/12/2018 | 4.8 |
| 05/12/2018 | 4.9 |
| 05/12/2018 | 4.9 |
| 05/12/2018 | 4.9 |
| 05/12/2018 | 4.8 |
| 05/12/2018 | 4.8 |
| 05/12/2018 | 4.9 |
| 05/12/2018 | 5.2 |
| 05/12/2018 | 5.4 |
| 05/12/2018 | 5.4 |
| 05/12/2018 | 5.1 |
| 05/12/2018 | 4.6 |
| 05/12/2018 | 4 |
| 05/12/2018 | 3.6 |
| 05/12/2018 | 3.2 |
| 06/12/2018 | 2.9 |
| 06/12/2018 | 2.7 |
| 06/12/2018 | 2.6 |
| 06/12/2018 | 2.5 |
| 06/12/2018 | 2.7 |
| 06/12/2018 | 2.9 |
| 06/12/2018 | 3.6 |
| 06/12/2018 | 4.2 |
| 06/12/2018 | 4.6 |
| 06/12/2018 | 4.8 |
| 06/12/2018 | 4.9 |
| 06/12/2018 | 4.9 |
| 06/12/2018 | 4.9 |
| 06/12/2018 | 4.8 |
| 06/12/2018 | 4.8 |
| 06/12/2018 | 4.9 |
| 06/12/2018 | 5.2 |
| 06/12/2018 | 5.5 |
| 06/12/2018 | 5.4 |
| 06/12/2018 | 5.2 |
| 06/12/2018 | 4.6 |
| 06/12/2018 | 4 |
| 06/12/2018 | 3.6 |
| 06/12/2018 | 3.2 |
| 07/12/2018 | 2.9 |
| 07/12/2018 | 2.7 |
| 07/12/2018 | 2.6 |
| 07/12/2018 | 2.5 |
| 07/12/2018 | 2.7 |
| 07/12/2018 | 2.9 |
| 07/12/2018 | 3.6 |
| 07/12/2018 | 4.2 |
| 07/12/2018 | 4.6 |
| 07/12/2018 | 4.8 |
| 07/12/2018 | 4.9 |
| 07/12/2018 | 4.9 |
| 07/12/2018 | 4.9 |
| 07/12/2018 | 4.8 |
| 07/12/2018 | 4.7 |
| 07/12/2018 | 4.7 |
| 07/12/2018 | 5.1 |
| 07/12/2018 | 5.3 |
| 07/12/2018 | 5.2 |
| 07/12/2018 | 4.9 |
| 07/12/2018 | 4.4 |
| 07/12/2018 | 3.9 |
| 07/12/2018 | 3.5 |
| 07/12/2018 | 3.2 |
| 08/12/2018 | 2.9 |
| 08/12/2018 | 2.6 |
| 08/12/2018 | 2.5 |
| 08/12/2018 | 2.5 |
| 08/12/2018 | 2.5 |
| 08/12/2018 | 2.6 |
| 08/12/2018 | 2.7 |
| 08/12/2018 | 3.1 |
| 08/12/2018 | 3.4 |
| 08/12/2018 | 3.8 |
| 08/12/2018 | 4 |
| 08/12/2018 | 4.1 |
| 08/12/2018 | 4.1 |
| 08/12/2018 | 4 |
| 08/12/2018 | 3.9 |
| 08/12/2018 | 4 |
| 08/12/2018 | 4.3 |
| 08/12/2018 | 4.5 |
| 08/12/2018 | 4.5 |
| 08/12/2018 | 4.3 |
| 08/12/2018 | 3.9 |
| 08/12/2018 | 3.6 |
| 08/12/2018 | 3.3 |
| 08/12/2018 | 3 |
| 09/12/2018 | 2.7 |
| 09/12/2018 | 2.6 |
| 09/12/2018 | 2.5 |
| 09/12/2018 | 2.4 |
| 09/12/2018 | 2.4 |
| 09/12/2018 | 2.4 |
| 09/12/2018 | 2.5 |
| 09/12/2018 | 2.7 |
| 09/12/2018 | 3 |
| 09/12/2018 | 3.2 |
| 09/12/2018 | 3.4 |
| 09/12/2018 | 3.6 |
| 09/12/2018 | 3.7 |
| 09/12/2018 | 3.6 |
| 09/12/2018 | 3.5 |
| 09/12/2018 | 3.6 |
| 09/12/2018 | 3.9 |
| 09/12/2018 | 4.2 |
| 09/12/2018 | 4.2 |
| 09/12/2018 | 4 |
| 09/12/2018 | 3.8 |
| 09/12/2018 | 3.5 |
| 09/12/2018 | 3.3 |
| 09/12/2018 | 3 |
| 10/12/2018 | 2.7 |
| 10/12/2018 | 2.5 |
| 10/12/2018 | 2.5 |
| 10/12/2018 | 2.5 |
| 10/12/2018 | 2.6 |
| 10/12/2018 | 2.9 |
| 10/12/2018 | 3.5 |
| 10/12/2018 | 4.2 |
| 10/12/2018 | 4.5 |
| 10/12/2018 | 4.7 |
| 10/12/2018 | 4.8 |
| 10/12/2018 | 4.9 |
| 10/12/2018 | 4.9 |
| 10/12/2018 | 4.9 |
| 10/12/2018 | 4.8 |
| 10/12/2018 | 4.9 |
| 10/12/2018 | 5.3 |
| 10/12/2018 | 5.5 |
| 10/12/2018 | 5.4 |
| 10/12/2018 | 5.1 |
| 10/12/2018 | 4.6 |
| 10/12/2018 | 4 |
| 10/12/2018 | 3.6 |
| 10/12/2018 | 3.2 |
| 11/12/2018 | 2.9 |
| 11/12/2018 | 2.7 |
| 11/12/2018 | 2.6 |
| 11/12/2018 | 2.5 |
| 11/12/2018 | 2.6 |
| 11/12/2018 | 2.9 |
| 11/12/2018 | 3.6 |
| 11/12/2018 | 4.2 |
| 11/12/2018 | 4.6 |
| 11/12/2018 | 4.8 |
| 11/12/2018 | 4.9 |
| 11/12/2018 | 4.9 |
| 11/12/2018 | 4.9 |
| 11/12/2018 | 4.9 |
| 11/12/2018 | 4.8 |
| 11/12/2018 | 4.9 |
| 11/12/2018 | 5.3 |
| 11/12/2018 | 5.6 |
| 11/12/2018 | 5.5 |
| 11/12/2018 | 5.2 |
| 11/12/2018 | 4.6 |
| 11/12/2018 | 4.1 |
| 11/12/2018 | 3.6 |
| 11/12/2018 | 3.2 |
| 12/12/2018 | 2.9 |
| 12/12/2018 | 2.7 |
| 12/12/2018 | 2.6 |
| 12/12/2018 | 2.5 |
| 12/12/2018 | 2.6 |
| 12/12/2018 | 2.9 |
| 12/12/2018 | 3.6 |
| 12/12/2018 | 4.3 |
| 12/12/2018 | 4.6 |
| 12/12/2018 | 4.8 |
| 12/12/2018 | 4.9 |
| 12/12/2018 | 4.9 |
| 12/12/2018 | 4.9 |
| 12/12/2018 | 4.9 |
| 12/12/2018 | 4.8 |
| 12/12/2018 | 4.9 |
| 12/12/2018 | 5.3 |
| 12/12/2018 | 5.5 |
| 12/12/2018 | 5.4 |
| 12/12/2018 | 5.1 |
| 12/12/2018 | 4.6 |
| 12/12/2018 | 4 |
| 12/12/2018 | 3.6 |
| 12/12/2018 | 3.2 |
| 13/12/2018 | 2.9 |
| 13/12/2018 | 2.7 |
| 13/12/2018 | 2.6 |
| 13/12/2018 | 2.6 |
| 13/12/2018 | 2.7 |
| 13/12/2018 | 2.9 |
| 13/12/2018 | 3.6 |
| 13/12/2018 | 4.3 |
| 13/12/2018 | 4.6 |
| 13/12/2018 | 4.8 |
| 13/12/2018 | 4.9 |
| 13/12/2018 | 4.9 |
| 13/12/2018 | 4.9 |
| 13/12/2018 | 4.9 |
| 13/12/2018 | 4.8 |
| 13/12/2018 | 4.9 |
| 13/12/2018 | 5.3 |
| 13/12/2018 | 5.5 |
| 13/12/2018 | 5.4 |
| 13/12/2018 | 5.1 |
| 13/12/2018 | 4.6 |
| 13/12/2018 | 4.1 |
| 13/12/2018 | 3.6 |
| 13/12/2018 | 3.2 |
| 14/12/2018 | 2.9 |
| 14/12/2018 | 2.7 |
| 14/12/2018 | 2.6 |
| 14/12/2018 | 2.6 |
| 14/12/2018 | 2.7 |
| 14/12/2018 | 2.9 |
| 14/12/2018 | 3.6 |
| 14/12/2018 | 4.2 |
| 14/12/2018 | 4.6 |
| 14/12/2018 | 4.8 |
| 14/12/2018 | 4.9 |
| 14/12/2018 | 5 |
| 14/12/2018 | 4.9 |
| 14/12/2018 | 4.8 |
| 14/12/2018 | 4.7 |
| 14/12/2018 | 4.8 |
| 14/12/2018 | 5.2 |
| 14/12/2018 | 5.4 |
| 14/12/2018 | 5.2 |
| 14/12/2018 | 4.9 |
| 14/12/2018 | 4.4 |
| 14/12/2018 | 3.9 |
| 14/12/2018 | 3.5 |
| 14/12/2018 | 3.2 |
| 15/12/2018 | 2.9 |
| 15/12/2018 | 2.7 |
| 15/12/2018 | 2.5 |
| 15/12/2018 | 2.5 |
| 15/12/2018 | 2.5 |
| 15/12/2018 | 2.6 |
| 15/12/2018 | 2.7 |
| 15/12/2018 | 3.1 |
| 15/12/2018 | 3.4 |
| 15/12/2018 | 3.8 |
| 15/12/2018 | 4 |
| 15/12/2018 | 4.1 |
| 15/12/2018 | 4.1 |
| 15/12/2018 | 4 |
| 15/12/2018 | 4 |
| 15/12/2018 | 4 |
| 15/12/2018 | 4.4 |
| 15/12/2018 | 4.6 |
| 15/12/2018 | 4.5 |
| 15/12/2018 | 4.3 |
| 15/12/2018 | 3.9 |
| 15/12/2018 | 3.6 |
| 15/12/2018 | 3.3 |
| 15/12/2018 | 3 |
| 16/12/2018 | 2.8 |
| 16/12/2018 | 2.6 |
| 16/12/2018 | 2.5 |
| 16/12/2018 | 2.4 |
| 16/12/2018 | 2.4 |
| 16/12/2018 | 2.4 |
| 16/12/2018 | 2.5 |
| 16/12/2018 | 2.7 |
| 16/12/2018 | 3 |
| 16/12/2018 | 3.3 |
| 16/12/2018 | 3.5 |
| 16/12/2018 | 3.6 |
| 16/12/2018 | 3.7 |
| 16/12/2018 | 3.6 |
| 16/12/2018 | 3.6 |
| 16/12/2018 | 3.6 |
| 16/12/2018 | 4 |
| 16/12/2018 | 4.3 |
| 16/12/2018 | 4.2 |
| 16/12/2018 | 4 |
| 16/12/2018 | 3.8 |
| 16/12/2018 | 3.5 |
| 16/12/2018 | 3.3 |
| 16/12/2018 | 3 |
| 17/12/2018 | 2.8 |
| 17/12/2018 | 2.6 |
| 17/12/2018 | 2.5 |
| 17/12/2018 | 2.5 |
| 17/12/2018 | 2.6 |
| 17/12/2018 | 2.8 |
| 17/12/2018 | 3.5 |
| 17/12/2018 | 4.2 |
| 17/12/2018 | 4.6 |
| 17/12/2018 | 4.7 |
| 17/12/2018 | 4.9 |
| 17/12/2018 | 4.9 |
| 17/12/2018 | 4.9 |
| 17/12/2018 | 4.9 |
| 17/12/2018 | 4.9 |
| 17/12/2018 | 4.9 |
| 17/12/2018 | 5.4 |
| 17/12/2018 | 5.6 |
| 17/12/2018 | 5.4 |
| 17/12/2018 | 5.1 |
| 17/12/2018 | 4.6 |
| 17/12/2018 | 4.1 |
| 17/12/2018 | 3.6 |
| 17/12/2018 | 3.2 |
| 18/12/2018 | 2.9 |
| 18/12/2018 | 2.7 |
| 18/12/2018 | 2.6 |
| 18/12/2018 | 2.5 |
| 18/12/2018 | 2.6 |
| 18/12/2018 | 2.9 |
| 18/12/2018 | 3.6 |
| 18/12/2018 | 4.3 |
| 18/12/2018 | 4.6 |
| 18/12/2018 | 4.8 |
| 18/12/2018 | 4.9 |
| 18/12/2018 | 5 |
| 18/12/2018 | 5 |
| 18/12/2018 | 4.9 |
| 18/12/2018 | 4.9 |
| 18/12/2018 | 5 |
| 18/12/2018 | 5.4 |
| 18/12/2018 | 5.6 |
| 18/12/2018 | 5.5 |
| 18/12/2018 | 5.2 |
| 18/12/2018 | 4.6 |
| 18/12/2018 | 4.1 |
| 18/12/2018 | 3.6 |
| 18/12/2018 | 3.2 |
| 19/12/2018 | 2.9 |
| 19/12/2018 | 2.7 |
| 19/12/2018 | 2.6 |
| 19/12/2018 | 2.5 |
| 19/12/2018 | 2.6 |
| 19/12/2018 | 2.9 |
| 19/12/2018 | 3.6 |
| 19/12/2018 | 4.3 |
| 19/12/2018 | 4.6 |
| 19/12/2018 | 4.8 |
| 19/12/2018 | 4.9 |
| 19/12/2018 | 5 |
| 19/12/2018 | 5 |
| 19/12/2018 | 4.9 |
| 19/12/2018 | 4.9 |
| 19/12/2018 | 5 |
| 19/12/2018 | 5.4 |
| 19/12/2018 | 5.6 |
| 19/12/2018 | 5.4 |
| 19/12/2018 | 5.1 |
| 19/12/2018 | 4.6 |
| 19/12/2018 | 4.1 |
| 19/12/2018 | 3.7 |
| 19/12/2018 | 3.2 |
| 20/12/2018 | 2.9 |
| 20/12/2018 | 2.7 |
| 20/12/2018 | 2.6 |
| 20/12/2018 | 2.6 |
| 20/12/2018 | 2.7 |
| 20/12/2018 | 2.9 |
| 20/12/2018 | 3.6 |
| 20/12/2018 | 4.3 |
| 20/12/2018 | 4.6 |
| 20/12/2018 | 4.8 |
| 20/12/2018 | 4.9 |
| 20/12/2018 | 5 |
| 20/12/2018 | 5 |
| 20/12/2018 | 4.9 |
| 20/12/2018 | 4.9 |
| 20/12/2018 | 5 |
| 20/12/2018 | 5.4 |
| 20/12/2018 | 5.6 |
| 20/12/2018 | 5.5 |
| 20/12/2018 | 5.1 |
| 20/12/2018 | 4.6 |
| 20/12/2018 | 4.1 |
| 20/12/2018 | 3.7 |
| 20/12/2018 | 3.3 |
| 21/12/2018 | 2.9 |
| 21/12/2018 | 2.7 |
| 21/12/2018 | 2.6 |
| 21/12/2018 | 2.6 |
| 21/12/2018 | 2.7 |
| 21/12/2018 | 2.9 |
| 21/12/2018 | 3.6 |
| 21/12/2018 | 4.3 |
| 21/12/2018 | 4.6 |
| 21/12/2018 | 4.8 |
| 21/12/2018 | 4.9 |
| 21/12/2018 | 5 |
| 21/12/2018 | 4.9 |
| 21/12/2018 | 4.8 |
| 21/12/2018 | 4.8 |
| 21/12/2018 | 4.8 |
| 21/12/2018 | 5.3 |
| 21/12/2018 | 5.5 |
| 21/12/2018 | 5.2 |
| 21/12/2018 | 4.9 |
| 21/12/2018 | 4.4 |
| 21/12/2018 | 3.9 |
| 21/12/2018 | 3.5 |
| 21/12/2018 | 3.2 |
| 22/12/2018 | 2.9 |
| 22/12/2018 | 2.7 |
| 22/12/2018 | 2.6 |
| 22/12/2018 | 2.5 |
| 22/12/2018 | 2.5 |
| 22/12/2018 | 2.6 |
| 22/12/2018 | 2.8 |
| 22/12/2018 | 3.1 |
| 22/12/2018 | 3.5 |
| 22/12/2018 | 3.8 |
| 22/12/2018 | 4.1 |
| 22/12/2018 | 4.2 |
| 22/12/2018 | 4.2 |
| 22/12/2018 | 4 |
| 22/12/2018 | 4 |
| 22/12/2018 | 4.1 |
| 22/12/2018 | 4.5 |
| 22/12/2018 | 4.6 |
| 22/12/2018 | 4.5 |
| 22/12/2018 | 4.3 |
| 22/12/2018 | 4 |
| 22/12/2018 | 3.6 |
| 22/12/2018 | 3.3 |
| 22/12/2018 | 3 |
| 23/12/2018 | 2.8 |
| 23/12/2018 | 2.6 |
| 23/12/2018 | 2.5 |
| 23/12/2018 | 2.4 |
| 23/12/2018 | 2.4 |
| 23/12/2018 | 2.4 |
| 23/12/2018 | 2.5 |
| 23/12/2018 | 2.8 |
| 23/12/2018 | 3 |
| 23/12/2018 | 3.3 |
| 23/12/2018 | 3.5 |
| 23/12/2018 | 3.7 |
| 23/12/2018 | 3.7 |
| 23/12/2018 | 3.6 |
| 23/12/2018 | 3.6 |
| 23/12/2018 | 3.7 |
| 23/12/2018 | 4.1 |
| 23/12/2018 | 4.3 |
| 23/12/2018 | 4.3 |
| 23/12/2018 | 4 |
| 23/12/2018 | 3.8 |
| 23/12/2018 | 3.5 |
| 23/12/2018 | 3.3 |
| 23/12/2018 | 3 |
| 24/12/2018 | 2.6 |
| 24/12/2018 | 2.5 |
| 24/12/2018 | 2.4 |
| 24/12/2018 | 2.3 |
| 24/12/2018 | 2.4 |
| 24/12/2018 | 2.5 |
| 24/12/2018 | 2.6 |
| 24/12/2018 | 2.9 |
| 24/12/2018 | 3.3 |
| 24/12/2018 | 3.6 |
| 24/12/2018 | 3.8 |
| 24/12/2018 | 3.9 |
| 24/12/2018 | 3.8 |
| 24/12/2018 | 3.7 |
| 24/12/2018 | 3.5 |
| 24/12/2018 | 3.3 |
| 24/12/2018 | 3.5 |
| 24/12/2018 | 3.6 |
| 24/12/2018 | 3.5 |
| 24/12/2018 | 3.4 |
| 24/12/2018 | 3.2 |
| 24/12/2018 | 3 |
| 24/12/2018 | 2.9 |
| 24/12/2018 | 2.7 |
| 25/12/2018 | 2.5 |
| 25/12/2018 | 2.4 |
| 25/12/2018 | 2.3 |
| 25/12/2018 | 2.3 |
| 25/12/2018 | 2.3 |
| 25/12/2018 | 2.3 |
| 25/12/2018 | 2.4 |
| 25/12/2018 | 2.5 |
| 25/12/2018 | 2.7 |
| 25/12/2018 | 3 |
| 25/12/2018 | 3.2 |
| 25/12/2018 | 3.4 |
| 25/12/2018 | 3.4 |
| 25/12/2018 | 3.2 |
| 25/12/2018 | 3.1 |
| 25/12/2018 | 3.2 |
| 25/12/2018 | 3.4 |
| 25/12/2018 | 3.5 |
| 25/12/2018 | 3.5 |
| 25/12/2018 | 3.4 |
| 25/12/2018 | 3.2 |
| 25/12/2018 | 3.1 |
| 25/12/2018 | 2.9 |
| 25/12/2018 | 2.7 |
| 26/12/2018 | 2.5 |
| 26/12/2018 | 2.4 |
| 26/12/2018 | 2.3 |
| 26/12/2018 | 2.3 |
| 26/12/2018 | 2.3 |
| 26/12/2018 | 2.3 |
| 26/12/2018 | 2.4 |
| 26/12/2018 | 2.5 |
| 26/12/2018 | 2.7 |
| 26/12/2018 | 3 |
| 26/12/2018 | 3.2 |
| 26/12/2018 | 3.4 |
| 26/12/2018 | 3.4 |
| 26/12/2018 | 3.2 |
| 26/12/2018 | 3.2 |
| 26/12/2018 | 3.2 |
| 26/12/2018 | 3.4 |
| 26/12/2018 | 3.5 |
| 26/12/2018 | 3.5 |
| 26/12/2018 | 3.4 |
| 26/12/2018 | 3.2 |
| 26/12/2018 | 3.1 |
| 26/12/2018 | 2.9 |
| 26/12/2018 | 2.7 |
| 27/12/2018 | 2.7 |
| 27/12/2018 | 2.5 |
| 27/12/2018 | 2.4 |
| 27/12/2018 | 2.3 |
| 27/12/2018 | 2.4 |
| 27/12/2018 | 2.6 |
| 27/12/2018 | 2.9 |
| 27/12/2018 | 3.3 |
| 27/12/2018 | 3.6 |
| 27/12/2018 | 3.9 |
| 27/12/2018 | 4.1 |
| 27/12/2018 | 4.1 |
| 27/12/2018 | 4.1 |
| 27/12/2018 | 4 |
| 27/12/2018 | 4 |
| 27/12/2018 | 4 |
| 27/12/2018 | 4.5 |
| 27/12/2018 | 4.6 |
| 27/12/2018 | 4.6 |
| 27/12/2018 | 4.4 |
| 27/12/2018 | 4 |
| 27/12/2018 | 3.6 |
| 27/12/2018 | 3.3 |
| 27/12/2018 | 3 |
| 28/12/2018 | 2.7 |
| 28/12/2018 | 2.5 |
| 28/12/2018 | 2.4 |
| 28/12/2018 | 2.3 |
| 28/12/2018 | 2.4 |
| 28/12/2018 | 2.6 |
| 28/12/2018 | 2.9 |
| 28/12/2018 | 3.3 |
| 28/12/2018 | 3.6 |
| 28/12/2018 | 3.9 |
| 28/12/2018 | 4.1 |
| 28/12/2018 | 4.1 |
| 28/12/2018 | 4.1 |
| 28/12/2018 | 4 |
| 28/12/2018 | 4 |
| 28/12/2018 | 4 |
| 28/12/2018 | 4.5 |
| 28/12/2018 | 4.6 |
| 28/12/2018 | 4.6 |
| 28/12/2018 | 4.4 |
| 28/12/2018 | 4 |
| 28/12/2018 | 3.6 |
| 28/12/2018 | 3.3 |
| 28/12/2018 | 3 |
| 29/12/2018 | 2.7 |
| 29/12/2018 | 2.5 |
| 29/12/2018 | 2.4 |
| 29/12/2018 | 2.3 |
| 29/12/2018 | 2.4 |
| 29/12/2018 | 2.6 |
| 29/12/2018 | 2.9 |
| 29/12/2018 | 3.3 |
| 29/12/2018 | 3.6 |
| 29/12/2018 | 3.9 |
| 29/12/2018 | 4.1 |
| 29/12/2018 | 4.2 |
| 29/12/2018 | 4.1 |
| 29/12/2018 | 4 |
| 29/12/2018 | 4 |
| 29/12/2018 | 4 |
| 29/12/2018 | 4.5 |
| 29/12/2018 | 4.7 |
| 29/12/2018 | 4.6 |
| 29/12/2018 | 4.4 |
| 29/12/2018 | 4 |
| 29/12/2018 | 3.6 |
| 29/12/2018 | 3.3 |
| 29/12/2018 | 3 |
| 30/12/2018 | 2.8 |
| 30/12/2018 | 2.6 |
| 30/12/2018 | 2.5 |
| 30/12/2018 | 2.4 |
| 30/12/2018 | 2.4 |
| 30/12/2018 | 2.4 |
| 30/12/2018 | 2.5 |
| 30/12/2018 | 2.7 |
| 30/12/2018 | 2.9 |
| 30/12/2018 | 3.2 |
| 30/12/2018 | 3.5 |
| 30/12/2018 | 3.6 |
| 30/12/2018 | 3.7 |
| 30/12/2018 | 3.6 |
| 30/12/2018 | 3.6 |
| 30/12/2018 | 3.7 |
| 30/12/2018 | 4.1 |
| 30/12/2018 | 4.3 |
| 30/12/2018 | 4.2 |
| 30/12/2018 | 3.9 |
| 30/12/2018 | 3.7 |
| 30/12/2018 | 3.5 |
| 30/12/2018 | 3.3 |
| 30/12/2018 | 3.1 |
| 31/12/2018 | 2.9 |
| 31/12/2018 | 2.6 |
| 31/12/2018 | 2.5 |
| 31/12/2018 | 2.4 |
| 31/12/2018 | 2.4 |
| 31/12/2018 | 2.5 |
| 31/12/2018 | 2.7 |
| 31/12/2018 | 2.9 |
| 31/12/2018 | 3.2 |
| 31/12/2018 | 3.6 |
| 31/12/2018 | 3.8 |
| 31/12/2018 | 3.9 |
| 31/12/2018 | 3.9 |
| 31/12/2018 | 3.9 |
| 31/12/2018 | 3.8 |
| 31/12/2018 | 4 |
| 31/12/2018 | 4.2 |
| 31/12/2018 | 4.3 |
| 31/12/2018 | 4.2 |
| 31/12/2018 | 3.9 |
| 31/12/2018 | 3.6 |
| 31/12/2018 | 3.3 |
| 31/12/2018 | 3.1 |
| 31/12/2018 | 3 |